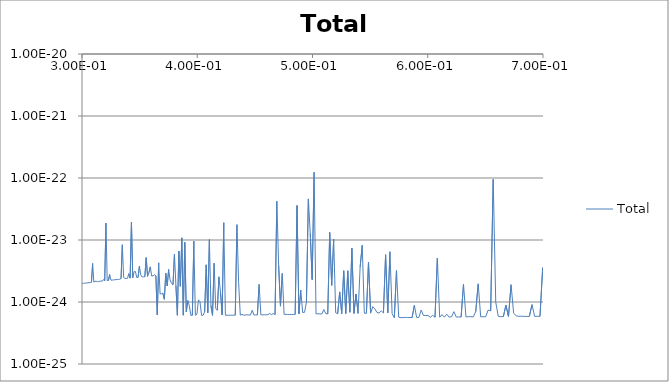
| Category | Total |
|---|---|
| 29929300.0 | 0 |
| 29829700.0 | 0 |
| 29730400.0 | 0 |
| 29631500.0 | 0 |
| 29532900.0 | 0 |
| 29434700.0 | 0 |
| 29336700.0 | 0 |
| 29239100.0 | 0 |
| 29141800.0 | 0 |
| 29044800.0 | 0 |
| 28948200.0 | 0 |
| 28851900.0 | 0 |
| 28755900.0 | 0 |
| 28660200.0 | 0 |
| 28564800.0 | 0 |
| 28469800.0 | 0 |
| 28375000.0 | 0 |
| 28280600.0 | 0 |
| 28186500.0 | 0 |
| 28092700.0 | 0 |
| 27999300.0 | 0 |
| 27906100.0 | 0 |
| 27813200.0 | 0 |
| 27720700.0 | 0 |
| 27628500.0 | 0 |
| 27536500.0 | 0 |
| 27444900.0 | 0 |
| 27353600.0 | 0 |
| 27262600.0 | 0 |
| 27171800.0 | 0 |
| 27081400.0 | 0 |
| 26991300.0 | 0 |
| 26901500.0 | 0 |
| 26812000.0 | 0 |
| 26722800.0 | 0 |
| 26633900.0 | 0 |
| 26545200.0 | 0 |
| 26456900.0 | 0 |
| 26368900.0 | 0 |
| 26281100.0 | 0 |
| 26193700.0 | 0 |
| 26106500.0 | 0 |
| 26019700.0 | 0 |
| 25933100.0 | 0 |
| 25846800.0 | 0 |
| 25760800.0 | 0 |
| 25675100.0 | 0 |
| 25589600.0 | 0 |
| 25504500.0 | 0 |
| 25419600.0 | 0 |
| 25335100.0 | 0 |
| 25250800.0 | 0 |
| 25166700.0 | 0 |
| 25083000.0 | 0 |
| 24999500.0 | 0 |
| 24916300.0 | 0 |
| 24833400.0 | 0 |
| 24750800.0 | 0 |
| 24668500.0 | 0 |
| 24586400.0 | 0 |
| 24504600.0 | 0 |
| 24423000.0 | 0 |
| 24341800.0 | 0 |
| 24260800.0 | 0 |
| 24180000.0 | 0 |
| 24099600.0 | 0 |
| 24019400.0 | 0 |
| 23939500.0 | 0 |
| 23859800.0 | 0 |
| 23780400.0 | 0 |
| 23701300.0 | 0 |
| 23622400.0 | 0 |
| 23543800.0 | 0 |
| 23465500.0 | 0 |
| 23387400.0 | 0 |
| 23309600.0 | 0 |
| 23232000.0 | 0 |
| 23154700.0 | 0 |
| 23077700.0 | 0 |
| 23000900.0 | 0 |
| 22924400.0 | 0 |
| 22848100.0 | 0 |
| 22772000.0 | 0 |
| 22696300.0 | 0 |
| 22620800.0 | 0 |
| 22545500.0 | 0 |
| 22470500.0 | 0 |
| 22395700.0 | 0 |
| 22321200.0 | 0 |
| 22246900.0 | 0 |
| 22172900.0 | 0 |
| 22099100.0 | 0 |
| 22025600.0 | 0 |
| 21952300.0 | 0 |
| 21879200.0 | 0 |
| 21806400.0 | 0 |
| 21733900.0 | 0 |
| 21661600.0 | 0 |
| 21589500.0 | 0 |
| 21517600.0 | 0 |
| 21446000.0 | 0 |
| 21374700.0 | 0 |
| 21303600.0 | 0 |
| 21232700.0 | 0 |
| 21162000.0 | 0 |
| 21091600.0 | 0 |
| 21021400.0 | 0 |
| 20951500.0 | 0 |
| 20881800.0 | 0 |
| 20812300.0 | 0 |
| 20743000.0 | 0 |
| 20674000.0 | 0 |
| 20605200.0 | 0 |
| 20536700.0 | 0 |
| 20468300.0 | 0 |
| 20400200.0 | 0 |
| 20332300.0 | 0 |
| 20264700.0 | 0 |
| 20197300.0 | 0 |
| 20130100.0 | 0 |
| 20063100.0 | 0 |
| 19996300.0 | 0 |
| 19929800.0 | 0 |
| 19863500.0 | 0 |
| 19797400.0 | 0 |
| 19731500.0 | 0 |
| 19665800.0 | 0 |
| 19600400.0 | 0 |
| 19535200.0 | 0 |
| 19470200.0 | 0 |
| 19405400.0 | 0 |
| 19340800.0 | 0 |
| 19276500.0 | 0 |
| 19212300.0 | 0 |
| 19148400.0 | 0 |
| 19084700.0 | 0 |
| 19021200.0 | 0 |
| 18957900.0 | 0 |
| 18894800.0 | 0 |
| 18831900.0 | 0 |
| 18769300.0 | 0 |
| 18706800.0 | 0 |
| 18644600.0 | 0 |
| 18582500.0 | 0 |
| 18520700.0 | 0 |
| 18459100.0 | 0 |
| 18397700.0 | 0 |
| 18336400.0 | 0 |
| 18275400.0 | 0 |
| 18214600.0 | 0 |
| 18154000.0 | 0 |
| 18093600.0 | 0 |
| 18033400.0 | 0 |
| 17973400.0 | 0 |
| 17913600.0 | 0 |
| 17854000.0 | 0 |
| 17794600.0 | 0 |
| 17735400.0 | 0 |
| 17676400.0 | 0 |
| 17617500.0 | 0 |
| 17558900.0 | 0 |
| 17500500.0 | 0 |
| 17442300.0 | 0 |
| 17384200.0 | 0 |
| 17326400.0 | 0 |
| 17268700.0 | 0 |
| 17211300.0 | 0 |
| 17154000.0 | 0 |
| 17096900.0 | 0 |
| 17040000.0 | 0 |
| 16983300.0 | 0 |
| 16926800.0 | 0 |
| 16870500.0 | 0 |
| 16814400.0 | 0 |
| 16758400.0 | 0 |
| 16702700.0 | 0 |
| 16647100.0 | 0 |
| 16591700.0 | 0 |
| 16536500.0 | 0 |
| 16481500.0 | 0 |
| 16426600.0 | 0 |
| 16372000.0 | 0 |
| 16317500.0 | 0 |
| 16263200.0 | 0 |
| 16209100.0 | 0 |
| 16155100.0 | 0 |
| 16101400.0 | 0 |
| 16047800.0 | 0 |
| 15994400.0 | 0 |
| 15941200.0 | 0 |
| 15888100.0 | 0 |
| 15835300.0 | 0 |
| 15782600.0 | 0 |
| 15730100.0 | 0 |
| 15677700.0 | 0 |
| 15625600.0 | 0 |
| 15573600.0 | 0 |
| 15521700.0 | 0 |
| 15470100.0 | 0 |
| 15418600.0 | 0 |
| 15367300.0 | 0 |
| 15316200.0 | 0 |
| 15265200.0 | 0 |
| 15214400.0 | 0 |
| 15163800.0 | 0 |
| 15113300.0 | 0 |
| 15063100.0 | 0 |
| 15012900.0 | 0 |
| 14963000.0 | 0 |
| 14913200.0 | 0 |
| 14863600.0 | 0 |
| 14814100.0 | 0 |
| 14764800.0 | 0 |
| 14715700.0 | 0 |
| 14666700.0 | 0 |
| 14617900.0 | 0 |
| 14569300.0 | 0 |
| 14520800.0 | 0 |
| 14472500.0 | 0 |
| 14424300.0 | 0 |
| 14376300.0 | 0 |
| 14328500.0 | 0 |
| 14280800.0 | 0 |
| 14233300.0 | 0 |
| 14185900.0 | 0 |
| 14138700.0 | 0 |
| 14091700.0 | 0 |
| 14044800.0 | 0 |
| 13998100.0 | 0 |
| 13951500.0 | 0 |
| 13905100.0 | 0 |
| 13858800.0 | 0 |
| 13812700.0 | 0 |
| 13766700.0 | 0 |
| 13720900.0 | 0 |
| 13675300.0 | 0 |
| 13629800.0 | 0 |
| 13584400.0 | 0 |
| 13539200.0 | 0 |
| 13494200.0 | 0 |
| 13449300.0 | 0 |
| 13404500.0 | 0 |
| 13359900.0 | 0 |
| 13315500.0 | 0 |
| 13271200.0 | 0 |
| 13227000.0 | 0 |
| 13183000.0 | 0 |
| 13139100.0 | 0 |
| 13095400.0 | 0 |
| 13051800.0 | 0 |
| 13008400.0 | 0 |
| 12965100.0 | 0 |
| 12922000.0 | 0 |
| 12879000.0 | 0 |
| 12836100.0 | 0 |
| 12793400.0 | 0 |
| 12750800.0 | 0 |
| 12708400.0 | 0 |
| 12666100.0 | 0 |
| 12624000.0 | 0 |
| 12582000.0 | 0 |
| 12540100.0 | 0 |
| 12498400.0 | 0 |
| 12456800.0 | 0 |
| 12415300.0 | 0 |
| 12374000.0 | 0 |
| 12332900.0 | 0 |
| 12291800.0 | 0 |
| 12250900.0 | 0 |
| 12210200.0 | 0 |
| 12169500.0 | 0 |
| 12129000.0 | 0 |
| 12088700.0 | 0 |
| 12048500.0 | 0 |
| 12008400.0 | 0 |
| 11968400.0 | 0 |
| 11928600.0 | 0 |
| 11888900.0 | 0 |
| 11849300.0 | 0 |
| 11809900.0 | 0 |
| 11770600.0 | 0 |
| 11731400.0 | 0 |
| 11692400.0 | 0 |
| 11653500.0 | 0 |
| 11614700.0 | 0 |
| 11576100.0 | 0 |
| 11537600.0 | 0 |
| 11499200.0 | 0 |
| 11460900.0 | 0 |
| 11422800.0 | 0 |
| 11384800.0 | 0 |
| 11346900.0 | 0 |
| 11309100.0 | 0 |
| 11271500.0 | 0 |
| 11234000.0 | 0 |
| 11196600.0 | 0 |
| 11159400.0 | 0 |
| 11122200.0 | 0 |
| 11085200.0 | 0 |
| 11048300.0 | 0 |
| 11011600.0 | 0 |
| 10974900.0 | 0 |
| 10938400.0 | 0 |
| 10902000.0 | 0 |
| 10865700.0 | 0 |
| 10829600.0 | 0 |
| 10793500.0 | 0 |
| 10757600.0 | 0 |
| 10721800.0 | 0 |
| 10686200.0 | 0 |
| 10650600.0 | 0 |
| 10615200.0 | 0 |
| 10579800.0 | 0 |
| 10544600.0 | 0 |
| 10509600.0 | 0 |
| 10474600.0 | 0 |
| 10439700.0 | 0 |
| 10405000.0 | 0 |
| 10370400.0 | 0 |
| 10335900.0 | 0 |
| 10301500.0 | 0 |
| 10267200.0 | 0 |
| 10233000.0 | 0 |
| 10199000.0 | 0 |
| 10165000.0 | 0 |
| 10131200.0 | 0 |
| 10097500.0 | 0 |
| 10063900.0 | 0 |
| 10030400.0 | 0 |
| 9997050.0 | 0 |
| 9963790.0 | 0 |
| 9930630.0 | 0 |
| 9897590.0 | 0 |
| 9864650.0 | 0 |
| 9831830.0 | 0 |
| 9799120.0 | 0 |
| 9766510.0 | 0 |
| 9734010.0 | 0 |
| 9701620.0 | 0 |
| 9669340.0 | 0 |
| 9637170.0 | 0 |
| 9605100.0 | 0 |
| 9573140.0 | 0 |
| 9541290.0 | 0 |
| 9509540.0 | 0 |
| 9477900.0 | 0 |
| 9446360.0 | 0 |
| 9414930.0 | 0 |
| 9383600.0 | 0 |
| 9352380.0 | 0 |
| 9321260.0 | 0 |
| 9290240.0 | 0 |
| 9259330.0 | 0 |
| 9228520.0 | 0 |
| 9197810.0 | 0 |
| 9167210.0 | 0 |
| 9136700.0 | 0 |
| 9106300.0 | 0 |
| 9076000.0 | 0 |
| 9045800.0 | 0 |
| 9015700.0 | 0 |
| 8985700.0 | 0 |
| 8955810.0 | 0 |
| 8926010.0 | 0 |
| 8896300.0 | 0 |
| 8866700.0 | 0 |
| 8837200.0 | 0 |
| 8807790.0 | 0 |
| 8778490.0 | 0 |
| 8749280.0 | 0 |
| 8720160.0 | 0 |
| 8691150.0 | 0 |
| 8662230.0 | 0 |
| 8633410.0 | 0 |
| 8604680.0 | 0 |
| 8576050.0 | 0 |
| 8547510.0 | 0 |
| 8519070.0 | 0 |
| 8490720.0 | 0 |
| 8462470.0 | 0 |
| 8434310.0 | 0 |
| 8406250.0 | 0 |
| 8378280.0 | 0 |
| 8350400.0 | 0 |
| 8322620.0 | 0 |
| 8294920.0 | 0 |
| 8267320.0 | 0 |
| 8239810.0 | 0 |
| 8212400.0 | 0 |
| 8185070.0 | 0 |
| 8157830.0 | 0 |
| 8130690.0 | 0 |
| 8103640.0 | 0 |
| 8076670.0 | 0 |
| 8049800.0 | 0 |
| 8023010.0 | 0 |
| 7996320.0 | 0 |
| 7969710.0 | 0 |
| 7943190.0 | 0 |
| 7916760.0 | 0 |
| 7890420.0 | 0 |
| 7864160.0 | 0 |
| 7838000.0 | 0 |
| 7811910.0 | 0 |
| 7785920.0 | 0 |
| 7760010.0 | 0 |
| 7734190.0 | 0 |
| 7708460.0 | 0 |
| 7682810.0 | 0 |
| 7657250.0 | 0 |
| 7631770.0 | 0 |
| 7606370.0 | 0 |
| 7581060.0 | 0 |
| 7555840.0 | 0 |
| 7530700.0 | 0 |
| 7505640.0 | 0 |
| 7480660.0 | 0 |
| 7455770.0 | 0 |
| 7430960.0 | 0 |
| 7406240.0 | 0 |
| 7381590.0 | 0 |
| 7357030.0 | 0 |
| 7332550.0 | 0 |
| 7308150.0 | 0 |
| 7283840.0 | 0 |
| 7259600.0 | 0 |
| 7235440.0 | 0 |
| 7211370.0 | 0 |
| 7187370.0 | 0 |
| 7163460.0 | 0 |
| 7139620.0 | 0 |
| 7115870.0 | 0 |
| 7092190.0 | 0 |
| 7068590.0 | 0 |
| 7045070.0 | 0 |
| 7021630.0 | 0 |
| 6998260.0 | 0 |
| 6974980.0 | 0 |
| 6951770.0 | 0 |
| 6928640.0 | 0 |
| 6905580.0 | 0 |
| 6882600.0 | 0 |
| 6859700.0 | 0 |
| 6836880.0 | 0 |
| 6814130.0 | 0 |
| 6791460.0 | 0 |
| 6768860.0 | 0 |
| 6746330.0 | 0 |
| 6723890.0 | 0 |
| 6701510.0 | 0 |
| 6679220.0 | 0 |
| 6656990.0 | 0 |
| 6634840.0 | 0 |
| 6612760.0 | 0 |
| 6590760.0 | 0 |
| 6568830.0 | 0 |
| 6546970.0 | 0 |
| 6525190.0 | 0 |
| 6503480.0 | 0 |
| 6481840.0 | 0 |
| 6460270.0 | 0 |
| 6438770.0 | 0 |
| 6417350.0 | 0 |
| 6395990.0 | 0 |
| 6374710.0 | 0 |
| 6353500.0 | 0 |
| 6332360.0 | 0 |
| 6311290.0 | 0 |
| 6290290.0 | 0 |
| 6269360.0 | 0 |
| 6248500.0 | 0 |
| 6227710.0 | 0 |
| 6206980.0 | 0 |
| 6186330.0 | 0 |
| 6165750.0 | 0 |
| 6145230.0 | 0 |
| 6124780.0 | 0 |
| 6104400.0 | 0 |
| 6084090.0 | 0 |
| 6063850.0 | 0 |
| 6043670.0 | 0 |
| 6023560.0 | 0 |
| 6003520.0 | 0 |
| 5983540.0 | 0 |
| 5963630.0 | 0 |
| 5943790.0 | 0 |
| 5924010.0 | 0 |
| 5904300.0 | 0 |
| 5884650.0 | 0 |
| 5865070.0 | 0 |
| 5845560.0 | 0 |
| 5826100.0 | 0 |
| 5806720.0 | 0 |
| 5787400.0 | 0 |
| 5768140.0 | 0 |
| 5748950.0 | 0 |
| 5729820.0 | 0 |
| 5710750.0 | 0 |
| 5691750.0 | 0 |
| 5672810.0 | 0 |
| 5653940.0 | 0 |
| 5635120.0 | 0 |
| 5616370.0 | 0 |
| 5597680.0 | 0 |
| 5579060.0 | 0 |
| 5560490.0 | 0 |
| 5541990.0 | 0 |
| 5523550.0 | 0 |
| 5505170.0 | 0 |
| 5486850.0 | 0 |
| 5468600.0 | 0 |
| 5450400.0 | 0 |
| 5432270.0 | 0 |
| 5414190.0 | 0 |
| 5396180.0 | 0 |
| 5378220.0 | 0 |
| 5360320.0 | 0 |
| 5342490.0 | 0 |
| 5324710.0 | 0 |
| 5306990.0 | 0 |
| 5289340.0 | 0 |
| 5271730.0 | 0 |
| 5254190.0 | 0 |
| 5236710.0 | 0 |
| 5219290.0 | 0 |
| 5201920.0 | 0 |
| 5184610.0 | 0 |
| 5167360.0 | 0 |
| 5150170.0 | 0 |
| 5133030.0 | 0 |
| 5115950.0 | 0 |
| 5098930.0 | 0 |
| 5081960.0 | 0 |
| 5065050.0 | 0 |
| 5048200.0 | 0 |
| 5031400.0 | 0 |
| 5014660.0 | 0 |
| 4997970.0 | 0 |
| 4981340.0 | 0 |
| 4964770.0 | 0 |
| 4948250.0 | 0 |
| 4931780.0 | 0 |
| 4915370.0 | 0 |
| 4899010.0 | 0 |
| 4882710.0 | 0 |
| 4866470.0 | 0 |
| 4850270.0 | 0 |
| 4834140.0 | 0 |
| 4818050.0 | 0 |
| 4802020.0 | 0 |
| 4786040.0 | 0 |
| 4770120.0 | 0 |
| 4754240.0 | 0 |
| 4738420.0 | 0 |
| 4722660.0 | 0 |
| 4706940.0 | 0 |
| 4691280.0 | 0 |
| 4675670.0 | 0 |
| 4660110.0 | 0 |
| 4644610.0 | 0 |
| 4629150.0 | 0 |
| 4613750.0 | 0 |
| 4598400.0 | 0 |
| 4583100.0 | 0 |
| 4567850.0 | 0 |
| 4552650.0 | 0 |
| 4537500.0 | 0 |
| 4522400.0 | 0 |
| 4507350.0 | 0 |
| 4492350.0 | 0 |
| 4477410.0 | 0 |
| 4462510.0 | 0 |
| 4447660.0 | 0 |
| 4432860.0 | 0 |
| 4418110.0 | 0 |
| 4403410.0 | 0 |
| 4388760.0 | 0 |
| 4374150.0 | 0 |
| 4359600.0 | 0 |
| 4345090.0 | 0 |
| 4330640.0 | 0 |
| 4316230.0 | 0 |
| 4301860.0 | 0 |
| 4287550.0 | 0 |
| 4273280.0 | 0 |
| 4259060.0 | 0 |
| 4244890.0 | 0 |
| 4230770.0 | 0 |
| 4216690.0 | 0 |
| 4202660.0 | 0 |
| 4188680.0 | 0 |
| 4174740.0 | 0 |
| 4160850.0 | 0 |
| 4147000.0 | 0 |
| 4133200.0 | 0 |
| 4119450.0 | 0 |
| 4105740.0 | 0 |
| 4092080.0 | 0 |
| 4078470.0 | 0 |
| 4064890.0 | 0 |
| 4051370.0 | 0 |
| 4037890.0 | 0 |
| 4024450.0 | 0 |
| 4011060.0 | 0 |
| 3997720.0 | 0 |
| 3984410.0 | 0 |
| 3971160.0 | 0 |
| 3957940.0 | 0 |
| 3944770.0 | 0 |
| 3931650.0 | 0 |
| 3918560.0 | 0 |
| 3905520.0 | 0 |
| 3892530.0 | 0 |
| 3879580.0 | 0 |
| 3866670.0 | 0 |
| 3853800.0 | 0 |
| 3840980.0 | 0 |
| 3828200.0 | 0 |
| 3815460.0 | 0 |
| 3802760.0 | 0 |
| 3790110.0 | 0 |
| 3777500.0 | 0 |
| 3764930.0 | 0 |
| 3752400.0 | 0 |
| 3739920.0 | 0 |
| 3727470.0 | 0 |
| 3715070.0 | 0 |
| 3702710.0 | 0 |
| 3690390.0 | 0 |
| 3678110.0 | 0 |
| 3665870.0 | 0 |
| 3653670.0 | 0 |
| 3641510.0 | 0 |
| 3629400.0 | 0 |
| 3617320.0 | 0 |
| 3605290.0 | 0 |
| 3593290.0 | 0 |
| 3581330.0 | 0 |
| 3569420.0 | 0 |
| 3557540.0 | 0 |
| 3545700.0 | 0 |
| 3533900.0 | 0 |
| 3522140.0 | 0 |
| 3510420.0 | 0 |
| 3498740.0 | 0 |
| 3487100.0 | 0 |
| 3475500.0 | 0 |
| 3463930.0 | 0 |
| 3452410.0 | 0 |
| 3440920.0 | 0 |
| 3429470.0 | 0 |
| 3418060.0 | 0 |
| 3406690.0 | 0 |
| 3395350.0 | 0 |
| 3384050.0 | 0 |
| 3372790.0 | 0 |
| 3361570.0 | 0 |
| 3350390.0 | 0 |
| 3339240.0 | 0 |
| 3328130.0 | 0 |
| 3317050.0 | 0 |
| 3306020.0 | 0 |
| 3295010.0 | 0 |
| 3284050.0 | 0 |
| 3273120.0 | 0 |
| 3262230.0 | 0 |
| 3251380.0 | 0 |
| 3240560.0 | 0 |
| 3229780.0 | 0 |
| 3219030.0 | 0 |
| 3208320.0 | 0 |
| 3197640.0 | 0 |
| 3187000.0 | 0 |
| 3176400.0 | 0 |
| 3165830.0 | 0 |
| 3155300.0 | 0 |
| 3144800.0 | 0 |
| 3134330.0 | 0 |
| 3123900.0 | 0 |
| 3113510.0 | 0 |
| 3103150.0 | 0 |
| 3092820.0 | 0 |
| 3082530.0 | 0 |
| 3072270.0 | 0 |
| 3062050.0 | 0 |
| 3051860.0 | 0 |
| 3041710.0 | 0 |
| 3031590.0 | 0 |
| 3021500.0 | 0 |
| 3011450.0 | 0 |
| 3001430.0 | 0 |
| 2991440.0 | 0 |
| 2981480.0 | 0 |
| 2971560.0 | 0 |
| 2961680.0 | 0 |
| 2951820.0 | 0 |
| 2942000.0 | 0 |
| 2932210.0 | 0 |
| 2922450.0 | 0 |
| 2912730.0 | 0 |
| 2903040.0 | 0 |
| 2893380.0 | 0 |
| 2883750.0 | 0 |
| 2874160.0 | 0 |
| 2864590.0 | 0 |
| 2855060.0 | 0 |
| 2845560.0 | 0 |
| 2836090.0 | 0 |
| 2826650.0 | 0 |
| 2817250.0 | 0 |
| 2807870.0 | 0 |
| 2798530.0 | 0 |
| 2789220.0 | 0 |
| 2779940.0 | 0 |
| 2770690.0 | 0 |
| 2761470.0 | 0 |
| 2752280.0 | 0 |
| 2743120.0 | 0 |
| 2734000.0 | 0 |
| 2724900.0 | 0 |
| 2715830.0 | 0 |
| 2706800.0 | 0 |
| 2697790.0 | 0 |
| 2688810.0 | 0 |
| 2679860.0 | 0 |
| 2670950.0 | 0 |
| 2662060.0 | 0 |
| 2653200.0 | 0 |
| 2644370.0 | 0 |
| 2635580.0 | 0 |
| 2626810.0 | 0 |
| 2618070.0 | 0 |
| 2609350.0 | 0 |
| 2600670.0 | 0 |
| 2592020.0 | 0 |
| 2583390.0 | 0 |
| 2574800.0 | 0 |
| 2566230.0 | 0 |
| 2557690.0 | 0 |
| 2549180.0 | 0 |
| 2540700.0 | 0 |
| 2532240.0 | 0 |
| 2523820.0 | 0 |
| 2515420.0 | 0 |
| 2507050.0 | 0 |
| 2498710.0 | 0 |
| 2490390.0 | 0 |
| 2482110.0 | 0 |
| 2473850.0 | 0 |
| 2465620.0 | 0 |
| 2457410.0 | 0 |
| 2449240.0 | 0 |
| 2441090.0 | 0 |
| 2432960.0 | 0 |
| 2424870.0 | 0 |
| 2416800.0 | 0 |
| 2408760.0 | 0 |
| 2400740.0 | 0 |
| 2392750.0 | 0 |
| 2384790.0 | 0 |
| 2376860.0 | 0 |
| 2368950.0 | 0 |
| 2361070.0 | 0 |
| 2353210.0 | 0 |
| 2345380.0 | 0 |
| 2337580.0 | 0 |
| 2329800.0 | 0 |
| 2322050.0 | 0 |
| 2314320.0 | 0 |
| 2306620.0 | 0 |
| 2298940.0 | 0 |
| 2291290.0 | 0 |
| 2283670.0 | 0 |
| 2276070.0 | 0 |
| 2268500.0 | 0 |
| 2260950.0 | 0 |
| 2253430.0 | 0 |
| 2245930.0 | 0 |
| 2238460.0 | 0 |
| 2231010.0 | 0 |
| 2223580.0 | 0 |
| 2216180.0 | 0 |
| 2208810.0 | 0 |
| 2201460.0 | 0 |
| 2194140.0 | 0 |
| 2186830.0 | 0 |
| 2179560.0 | 0 |
| 2172310.0 | 0 |
| 2165080.0 | 0 |
| 2157870.0 | 0 |
| 2150690.0 | 0 |
| 2143540.0 | 0 |
| 2136400.0 | 0 |
| 2129300.0 | 0 |
| 2122210.0 | 0 |
| 2115150.0 | 0 |
| 2108110.0 | 0 |
| 2101100.0 | 0 |
| 2094110.0 | 0 |
| 2087140.0 | 0 |
| 2080190.0 | 0 |
| 2073270.0 | 0 |
| 2066370.0 | 0 |
| 2059500.0 | 0 |
| 2052640.0 | 0 |
| 2045810.0 | 0 |
| 2039010.0 | 0 |
| 2032220.0 | 0 |
| 2025460.0 | 0 |
| 2018720.0 | 0 |
| 2012000.0 | 0 |
| 2005310.0 | 0 |
| 1998640.0 | 0 |
| 1991990.0 | 0 |
| 1985360.0 | 0 |
| 1978750.0 | 0 |
| 1972170.0 | 0 |
| 1965600.0 | 0 |
| 1959060.0 | 0 |
| 1952550.0 | 0 |
| 1946050.0 | 0 |
| 1939570.0 | 0 |
| 1933120.0 | 0 |
| 1926690.0 | 0 |
| 1920280.0 | 0 |
| 1913890.0 | 0 |
| 1907520.0 | 0 |
| 1901170.0 | 0 |
| 1894850.0 | 0 |
| 1888540.0 | 0 |
| 1882260.0 | 0 |
| 1875990.0 | 0 |
| 1869750.0 | 0 |
| 1863530.0 | 0 |
| 1857330.0 | 0 |
| 1851150.0 | 0 |
| 1844990.0 | 0 |
| 1838850.0 | 0 |
| 1832730.0 | 0 |
| 1826630.0 | 0 |
| 1820560.0 | 0 |
| 1814500.0 | 0 |
| 1808460.0 | 0 |
| 1802440.0 | 0 |
| 1796450.0 | 0 |
| 1790470.0 | 0 |
| 1784510.0 | 0 |
| 1778570.0 | 0 |
| 1772650.0 | 0 |
| 1766760.0 | 0 |
| 1760880.0 | 0 |
| 1755020.0 | 0 |
| 1749180.0 | 0 |
| 1743360.0 | 0 |
| 1737560.0 | 0 |
| 1731780.0 | 0 |
| 1726010.0 | 0 |
| 1720270.0 | 0 |
| 1714550.0 | 0 |
| 1708840.0 | 0 |
| 1703150.0 | 0 |
| 1697490.0 | 0 |
| 1691840.0 | 0 |
| 1686210.0 | 0 |
| 1680600.0 | 0 |
| 1675010.0 | 0 |
| 1669430.0 | 0 |
| 1663880.0 | 0 |
| 1658340.0 | 0 |
| 1652820.0 | 0 |
| 1647320.0 | 0 |
| 1641840.0 | 0 |
| 1636380.0 | 0 |
| 1630940.0 | 0 |
| 1625510.0 | 0 |
| 1620100.0 | 0 |
| 1614710.0 | 0 |
| 1609340.0 | 0 |
| 1603980.0 | 0 |
| 1598640.0 | 0 |
| 1593320.0 | 0 |
| 1588020.0 | 0 |
| 1582740.0 | 0 |
| 1577470.0 | 0 |
| 1572220.0 | 0 |
| 1566990.0 | 0 |
| 1561780.0 | 0 |
| 1556580.0 | 0 |
| 1551400.0 | 0 |
| 1546240.0 | 0 |
| 1541100.0 | 0 |
| 1535970.0 | 0 |
| 1530860.0 | 0 |
| 1525760.0 | 0 |
| 1520690.0 | 0 |
| 1515630.0 | 0 |
| 1510580.0 | 0 |
| 1505560.0 | 0 |
| 1500550.0 | 0 |
| 1495550.0 | 0 |
| 1490580.0 | 0 |
| 1485620.0 | 0 |
| 1480670.0 | 0 |
| 1475750.0 | 0 |
| 1470840.0 | 0 |
| 1465940.0 | 0 |
| 1461070.0 | 0 |
| 1456200.0 | 0 |
| 1451360.0 | 0 |
| 1446530.0 | 0 |
| 1441720.0 | 0 |
| 1436920.0 | 0 |
| 1432140.0 | 0 |
| 1427370.0 | 0 |
| 1422620.0 | 0 |
| 1417890.0 | 0 |
| 1413170.0 | 0 |
| 1408470.0 | 0 |
| 1403780.0 | 0 |
| 1399110.0 | 0 |
| 1394460.0 | 0 |
| 1389820.0 | 0 |
| 1385190.0 | 0 |
| 1380580.0 | 0 |
| 1375990.0 | 0 |
| 1371410.0 | 0 |
| 1366850.0 | 0 |
| 1362300.0 | 0 |
| 1357770.0 | 0 |
| 1353250.0 | 0 |
| 1348740.0 | 0 |
| 1344260.0 | 0 |
| 1339780.0 | 0 |
| 1335330.0 | 0 |
| 1330880.0 | 0 |
| 1326450.0 | 0 |
| 1322040.0 | 0 |
| 1317640.0 | 0 |
| 1313260.0 | 0 |
| 1308890.0 | 0 |
| 1304530.0 | 0 |
| 1300190.0 | 0 |
| 1295870.0 | 0 |
| 1291550.0 | 0 |
| 1287260.0 | 0 |
| 1282970.0 | 0 |
| 1278700.0 | 0 |
| 1274450.0 | 0 |
| 1270210.0 | 0 |
| 1265980.0 | 0 |
| 1261770.0 | 0 |
| 1257570.0 | 0 |
| 1253390.0 | 0 |
| 1249220.0 | 0 |
| 1245060.0 | 0 |
| 1240920.0 | 0 |
| 1236790.0 | 0 |
| 1232670.0 | 0 |
| 1228570.0 | 0 |
| 1224480.0 | 0 |
| 1220410.0 | 0 |
| 1216350.0 | 0 |
| 1212300.0 | 0 |
| 1208270.0 | 0 |
| 1204250.0 | 0 |
| 1200240.0 | 0 |
| 1196240.0 | 0 |
| 1192260.0 | 0 |
| 1188300.0 | 0 |
| 1184340.0 | 0 |
| 1180400.0 | 0 |
| 1176470.0 | 0 |
| 1172560.0 | 0 |
| 1168660.0 | 0 |
| 1164770.0 | 0 |
| 1160890.0 | 0 |
| 1157030.0 | 0 |
| 1153180.0 | 0 |
| 1149340.0 | 0 |
| 1145520.0 | 0 |
| 1141710.0 | 0 |
| 1137910.0 | 0 |
| 1134120.0 | 0 |
| 1130350.0 | 0 |
| 1126590.0 | 0 |
| 1122840.0 | 0 |
| 1119100.0 | 0 |
| 1115380.0 | 0 |
| 1111670.0 | 0 |
| 1107970.0 | 0 |
| 1104280.0 | 0 |
| 1100610.0 | 0 |
| 1096950.0 | 0 |
| 1093300.0 | 0 |
| 1089660.0 | 0 |
| 1086030.0 | 0 |
| 1082420.0 | 0 |
| 1078820.0 | 0 |
| 1075230.0 | 0 |
| 1071650.0 | 0 |
| 1068080.0 | 0 |
| 1064530.0 | 0 |
| 1060990.0 | 0 |
| 1057460.0 | 0 |
| 1053940.0 | 0 |
| 1050430.0 | 0 |
| 1046940.0 | 0 |
| 1043450.0 | 0 |
| 1039980.0 | 0 |
| 1036520.0 | 0 |
| 1033070.0 | 0 |
| 1029630.0 | 0 |
| 1026210.0 | 0 |
| 1022790.0 | 0 |
| 1019390.0 | 0 |
| 1016000.0 | 0 |
| 1012620.0 | 0 |
| 1009250.0 | 0 |
| 1005890.0 | 0 |
| 1002540.0 | 0 |
| 999207.0 | 0 |
| 995882.0 | 0 |
| 992569.0 | 0 |
| 989266.0 | 0 |
| 985974.0 | 0 |
| 982694.0 | 0 |
| 979424.0 | 0 |
| 976165.0 | 0 |
| 972917.0 | 0 |
| 969679.0 | 0 |
| 966453.0 | 0 |
| 963237.0 | 0 |
| 960032.0 | 0 |
| 956838.0 | 0 |
| 953654.0 | 0 |
| 950481.0 | 0 |
| 947318.0 | 0 |
| 944166.0 | 0 |
| 941024.0 | 0 |
| 937893.0 | 0 |
| 934772.0 | 0 |
| 931662.0 | 0 |
| 928562.0 | 0 |
| 925472.0 | 0 |
| 922393.0 | 0 |
| 919323.0 | 0 |
| 916264.0 | 0 |
| 913216.0 | 0 |
| 910177.0 | 0 |
| 907148.0 | 0 |
| 904130.0 | 0 |
| 901122.0 | 0 |
| 898123.0 | 0 |
| 895135.0 | 0 |
| 892156.0 | 0 |
| 889188.0 | 0 |
| 886229.0 | 0 |
| 883280.0 | 0 |
| 880341.0 | 0 |
| 877412.0 | 0 |
| 874492.0 | 0 |
| 871582.0 | 0 |
| 868682.0 | 0 |
| 865792.0 | 0 |
| 862911.0 | 0 |
| 860040.0 | 0 |
| 857178.0 | 0 |
| 854326.0 | 0 |
| 851483.0 | 0 |
| 848650.0 | 0 |
| 845826.0 | 0 |
| 843012.0 | 0 |
| 840207.0 | 0 |
| 837411.0 | 0 |
| 834624.0 | 0 |
| 831847.0 | 0 |
| 829079.0 | 0 |
| 826321.0 | 0 |
| 823571.0 | 0 |
| 820831.0 | 0 |
| 818100.0 | 0 |
| 815377.0 | 0 |
| 812664.0 | 0 |
| 809960.0 | 0 |
| 807265.0 | 0 |
| 804579.0 | 0 |
| 801902.0 | 0 |
| 799234.0 | 0 |
| 796574.0 | 0 |
| 793924.0 | 0 |
| 791282.0 | 0 |
| 788649.0 | 0 |
| 786025.0 | 0 |
| 783409.0 | 0 |
| 780803.0 | 0 |
| 778205.0 | 0 |
| 775615.0 | 0 |
| 773034.0 | 0 |
| 770462.0 | 0 |
| 767898.0 | 0 |
| 765343.0 | 0 |
| 762797.0 | 0 |
| 760259.0 | 0 |
| 757729.0 | 0 |
| 755208.0 | 0 |
| 752695.0 | 0 |
| 750190.0 | 0 |
| 747694.0 | 0 |
| 745206.0 | 0 |
| 742726.0 | 0 |
| 740255.0 | 0 |
| 737792.0 | 0 |
| 735337.0 | 0 |
| 732890.0 | 0 |
| 730452.0 | 0 |
| 728021.0 | 0 |
| 725599.0 | 0 |
| 723184.0 | 0 |
| 720778.0 | 0 |
| 718380.0 | 0 |
| 715989.0 | 0 |
| 713607.0 | 0 |
| 711232.0 | 0 |
| 708866.0 | 0 |
| 706507.0 | 0 |
| 704156.0 | 0 |
| 701813.0 | 0 |
| 699478.0 | 0 |
| 697151.0 | 0 |
| 694831.0 | 0 |
| 692519.0 | 0 |
| 690215.0 | 0 |
| 687918.0 | 0 |
| 685629.0 | 0 |
| 683348.0 | 0 |
| 681074.0 | 0 |
| 678807.0 | 0 |
| 676549.0 | 0 |
| 674298.0 | 0 |
| 672054.0 | 0 |
| 669818.0 | 0 |
| 667589.0 | 0 |
| 665368.0 | 0 |
| 663154.0 | 0 |
| 660947.0 | 0 |
| 658748.0 | 0 |
| 656556.0 | 0 |
| 654371.0 | 0 |
| 652194.0 | 0 |
| 650024.0 | 0 |
| 647861.0 | 0 |
| 645705.0 | 0 |
| 643557.0 | 0 |
| 641415.0 | 0 |
| 639281.0 | 0 |
| 637154.0 | 0 |
| 635034.0 | 0 |
| 632921.0 | 0 |
| 630815.0 | 0 |
| 628716.0 | 0 |
| 626624.0 | 0 |
| 624539.0 | 0 |
| 622461.0 | 0 |
| 620389.0 | 0 |
| 618325.0 | 0 |
| 616268.0 | 0 |
| 614217.0 | 0 |
| 612173.0 | 0 |
| 610136.0 | 0 |
| 608106.0 | 0 |
| 606083.0 | 0 |
| 604066.0 | 0 |
| 602056.0 | 0 |
| 600053.0 | 0 |
| 598056.0 | 0 |
| 596066.0 | 0 |
| 594083.0 | 0 |
| 592106.0 | 0 |
| 590136.0 | 0 |
| 588172.0 | 0 |
| 586215.0 | 0 |
| 584265.0 | 0 |
| 582320.0 | 0 |
| 580383.0 | 0 |
| 578452.0 | 0 |
| 576527.0 | 0 |
| 574609.0 | 0 |
| 572697.0 | 0 |
| 570791.0 | 0 |
| 568892.0 | 0 |
| 566999.0 | 0 |
| 565112.0 | 0 |
| 563232.0 | 0 |
| 561358.0 | 0 |
| 559490.0 | 0 |
| 557628.0 | 0 |
| 555773.0 | 0 |
| 553923.0 | 0 |
| 552080.0 | 0 |
| 550243.0 | 0 |
| 548412.0 | 0 |
| 546588.0 | 0 |
| 544769.0 | 0 |
| 542956.0 | 0 |
| 541150.0 | 0 |
| 539349.0 | 0 |
| 537554.0 | 0 |
| 535766.0 | 0 |
| 533983.0 | 0 |
| 532206.0 | 0 |
| 530435.0 | 0 |
| 528670.0 | 0 |
| 526911.0 | 0 |
| 525158.0 | 0 |
| 523410.0 | 0 |
| 521669.0 | 0 |
| 519933.0 | 0 |
| 518203.0 | 0 |
| 516479.0 | 0 |
| 514760.0 | 0 |
| 513047.0 | 0 |
| 511340.0 | 0 |
| 509639.0 | 0 |
| 507943.0 | 0 |
| 506253.0 | 0 |
| 504568.0 | 0 |
| 502889.0 | 0 |
| 501216.0 | 0 |
| 499548.0 | 0 |
| 497886.0 | 0 |
| 496229.0 | 0 |
| 494578.0 | 0 |
| 492933.0 | 0 |
| 491292.0 | 0 |
| 489658.0 | 0 |
| 488028.0 | 0 |
| 486404.0 | 0 |
| 484786.0 | 0 |
| 483173.0 | 0 |
| 481565.0 | 0 |
| 479963.0 | 0 |
| 478366.0 | 0 |
| 476774.0 | 0 |
| 475188.0 | 0 |
| 473606.0 | 0 |
| 472031.0 | 0 |
| 470460.0 | 0 |
| 468895.0 | 0 |
| 467334.0 | 0 |
| 465779.0 | 0 |
| 464229.0 | 0 |
| 462685.0 | 0 |
| 461145.0 | 0 |
| 459611.0 | 0 |
| 458081.0 | 0 |
| 456557.0 | 0 |
| 455038.0 | 0 |
| 453524.0 | 0 |
| 452015.0 | 0 |
| 450511.0 | 0 |
| 449012.0 | 0 |
| 447518.0 | 0 |
| 446029.0 | 0 |
| 444545.0 | 0 |
| 443065.0 | 0 |
| 441591.0 | 0 |
| 440122.0 | 0 |
| 438657.0 | 0 |
| 437198.0 | 0 |
| 435743.0 | 0 |
| 434293.0 | 0 |
| 432848.0 | 0 |
| 431408.0 | 0 |
| 429972.0 | 0 |
| 428542.0 | 0 |
| 427116.0 | 0 |
| 425694.0 | 0 |
| 424278.0 | 0 |
| 422866.0 | 0 |
| 421459.0 | 0 |
| 420057.0 | 0 |
| 418659.0 | 0 |
| 417266.0 | 0 |
| 415878.0 | 0 |
| 414494.0 | 0 |
| 413115.0 | 0 |
| 411740.0 | 0 |
| 410370.0 | 0 |
| 409004.0 | 0 |
| 407644.0 | 0 |
| 406287.0 | 0 |
| 404935.0 | 0 |
| 403588.0 | 0 |
| 402245.0 | 0 |
| 400906.0 | 0 |
| 399573.0 | 0 |
| 398243.0 | 0 |
| 396918.0 | 0 |
| 395597.0 | 0 |
| 394281.0 | 0 |
| 392969.0 | 0 |
| 391661.0 | 0 |
| 390358.0 | 0 |
| 389059.0 | 0 |
| 387765.0 | 0 |
| 386474.0 | 0 |
| 385188.0 | 0 |
| 383907.0 | 0 |
| 382629.0 | 0 |
| 381356.0 | 0 |
| 380087.0 | 0 |
| 378822.0 | 0 |
| 377562.0 | 0 |
| 376306.0 | 0 |
| 375054.0 | 0 |
| 373806.0 | 0 |
| 372562.0 | 0 |
| 371322.0 | 0 |
| 370087.0 | 0 |
| 368855.0 | 0 |
| 367628.0 | 0 |
| 366405.0 | 0 |
| 365185.0 | 0 |
| 363970.0 | 0 |
| 362759.0 | 0 |
| 361552.0 | 0 |
| 360349.0 | 0 |
| 359150.0 | 0 |
| 357955.0 | 0 |
| 356764.0 | 0 |
| 355577.0 | 0 |
| 354394.0 | 0 |
| 353214.0 | 0 |
| 352039.0 | 0 |
| 350868.0 | 0 |
| 349700.0 | 0 |
| 348537.0 | 0 |
| 347377.0 | 0 |
| 346221.0 | 0 |
| 345069.0 | 0 |
| 343921.0 | 0 |
| 342776.0 | 0 |
| 341636.0 | 0 |
| 340499.0 | 0 |
| 339366.0 | 0 |
| 338237.0 | 0 |
| 337111.0 | 0 |
| 335990.0 | 0 |
| 334872.0 | 0 |
| 333758.0 | 0 |
| 332647.0 | 0 |
| 331540.0 | 0 |
| 330437.0 | 0 |
| 329337.0 | 0 |
| 328242.0 | 0 |
| 327149.0 | 0 |
| 326061.0 | 0 |
| 324976.0 | 0 |
| 323895.0 | 0 |
| 322817.0 | 0 |
| 321743.0 | 0 |
| 320672.0 | 0 |
| 319605.0 | 0 |
| 318542.0 | 0 |
| 317482.0 | 0 |
| 316425.0 | 0 |
| 315372.0 | 0 |
| 314323.0 | 0 |
| 313277.0 | 0 |
| 312235.0 | 0 |
| 311196.0 | 0 |
| 310160.0 | 0 |
| 309128.0 | 0 |
| 308100.0 | 0 |
| 307075.0 | 0 |
| 306053.0 | 0 |
| 305034.0 | 0 |
| 304019.0 | 0 |
| 303008.0 | 0 |
| 302000.0 | 0 |
| 300995.0 | 0 |
| 299993.0 | 0 |
| 298995.0 | 0 |
| 298000.0 | 0 |
| 297009.0 | 0 |
| 296020.0 | 0 |
| 295035.0 | 0 |
| 294054.0 | 0 |
| 293075.0 | 0 |
| 292100.0 | 0 |
| 291128.0 | 0 |
| 290159.0 | 0 |
| 289194.0 | 0 |
| 288232.0 | 0 |
| 287272.0 | 0 |
| 286317.0 | 0 |
| 285364.0 | 0 |
| 284414.0 | 0 |
| 283468.0 | 0 |
| 282525.0 | 0 |
| 281585.0 | 0 |
| 280648.0 | 0 |
| 279714.0 | 0 |
| 278783.0 | 0 |
| 277856.0 | 0 |
| 276931.0 | 0 |
| 276010.0 | 0 |
| 275091.0 | 0 |
| 274176.0 | 0 |
| 273264.0 | 0 |
| 272354.0 | 0 |
| 271448.0 | 0 |
| 270545.0 | 0 |
| 269645.0 | 0 |
| 268747.0 | 0 |
| 267853.0 | 0 |
| 266962.0 | 0 |
| 266074.0 | 0 |
| 265188.0 | 0 |
| 264306.0 | 0 |
| 263426.0 | 0 |
| 262550.0 | 0 |
| 261676.0 | 0 |
| 260806.0 | 0 |
| 259938.0 | 0 |
| 259073.0 | 0 |
| 258211.0 | 0 |
| 257352.0 | 0 |
| 256495.0 | 0 |
| 255642.0 | 0 |
| 254791.0 | 0 |
| 253943.0 | 0 |
| 253098.0 | 0 |
| 252256.0 | 0 |
| 251417.0 | 0 |
| 250580.0 | 0 |
| 249746.0 | 0 |
| 248915.0 | 0 |
| 248087.0 | 0 |
| 247262.0 | 0 |
| 246439.0 | 0 |
| 245619.0 | 0 |
| 244802.0 | 0 |
| 243987.0 | 0 |
| 243175.0 | 0 |
| 242366.0 | 0 |
| 241560.0 | 0 |
| 240756.0 | 0 |
| 239955.0 | 0 |
| 239156.0 | 0 |
| 238361.0 | 0 |
| 237567.0 | 0 |
| 236777.0 | 0 |
| 235989.0 | 0 |
| 235204.0 | 0 |
| 234421.0 | 0 |
| 233641.0 | 0 |
| 232864.0 | 0 |
| 232089.0 | 0 |
| 231317.0 | 0 |
| 230547.0 | 0 |
| 229780.0 | 0 |
| 229015.0 | 0 |
| 228253.0 | 0 |
| 227494.0 | 0 |
| 226737.0 | 0 |
| 225982.0 | 0 |
| 225230.0 | 0 |
| 224481.0 | 0 |
| 223734.0 | 0 |
| 222990.0 | 0 |
| 222248.0 | 0 |
| 221508.0 | 0 |
| 220771.0 | 0 |
| 220036.0 | 0 |
| 219304.0 | 0 |
| 218575.0 | 0 |
| 217847.0 | 0 |
| 217122.0 | 0 |
| 216400.0 | 0 |
| 215680.0 | 0 |
| 214962.0 | 0 |
| 214247.0 | 0 |
| 213534.0 | 0 |
| 212824.0 | 0 |
| 212115.0 | 0 |
| 211410.0 | 0 |
| 210706.0 | 0 |
| 210005.0 | 0 |
| 209306.0 | 0 |
| 208610.0 | 0 |
| 207916.0 | 0 |
| 207224.0 | 0 |
| 206534.0 | 0 |
| 205847.0 | 0 |
| 205162.0 | 0 |
| 204480.0 | 0 |
| 203799.0 | 0 |
| 203121.0 | 0 |
| 202445.0 | 0 |
| 201772.0 | 0 |
| 201100.0 | 0 |
| 200431.0 | 0 |
| 199764.0 | 0 |
| 199099.0 | 0 |
| 198437.0 | 0 |
| 197777.0 | 0 |
| 197119.0 | 0 |
| 196463.0 | 0 |
| 195809.0 | 0 |
| 195157.0 | 0 |
| 194508.0 | 0 |
| 193861.0 | 0 |
| 193216.0 | 0 |
| 192573.0 | 0 |
| 191932.0 | 0 |
| 191293.0 | 0 |
| 190657.0 | 0 |
| 190023.0 | 0 |
| 189390.0 | 0 |
| 188760.0 | 0 |
| 188132.0 | 0 |
| 187506.0 | 0 |
| 186882.0 | 0 |
| 186260.0 | 0 |
| 185640.0 | 0 |
| 185023.0 | 0 |
| 184407.0 | 0 |
| 183794.0 | 0 |
| 183182.0 | 0 |
| 182572.0 | 0 |
| 181965.0 | 0 |
| 181359.0 | 0 |
| 180756.0 | 0 |
| 180155.0 | 0 |
| 179555.0 | 0 |
| 178958.0 | 0 |
| 178362.0 | 0 |
| 177769.0 | 0 |
| 177177.0 | 0 |
| 176588.0 | 0 |
| 176000.0 | 0 |
| 175414.0 | 0 |
| 174831.0 | 0 |
| 174249.0 | 0 |
| 173669.0 | 0 |
| 173091.0 | 0 |
| 172515.0 | 0 |
| 171941.0 | 0 |
| 171369.0 | 0 |
| 170799.0 | 0 |
| 170231.0 | 0 |
| 169664.0 | 0 |
| 169100.0 | 0 |
| 168537.0 | 0 |
| 167976.0 | 0 |
| 167417.0 | 0 |
| 166860.0 | 0 |
| 166305.0 | 0 |
| 165752.0 | 0 |
| 165200.0 | 0 |
| 164650.0 | 0 |
| 164103.0 | 0 |
| 163557.0 | 0 |
| 163012.0 | 0 |
| 162470.0 | 0 |
| 161929.0 | 0 |
| 161391.0 | 0 |
| 160854.0 | 0 |
| 160318.0 | 0 |
| 159785.0 | 0 |
| 159253.0 | 0 |
| 158723.0 | 0 |
| 158195.0 | 0 |
| 157669.0 | 0 |
| 157144.0 | 0 |
| 156621.0 | 0 |
| 156100.0 | 0 |
| 155581.0 | 0 |
| 155063.0 | 0 |
| 154547.0 | 0 |
| 154033.0 | 0 |
| 153520.0 | 0 |
| 153009.0 | 0 |
| 152500.0 | 0 |
| 151993.0 | 0 |
| 151487.0 | 0 |
| 150983.0 | 0 |
| 150481.0 | 0 |
| 149980.0 | 0 |
| 149481.0 | 0 |
| 148984.0 | 0 |
| 148488.0 | 0 |
| 147994.0 | 0 |
| 147501.0 | 0 |
| 147010.0 | 0 |
| 146521.0 | 0 |
| 146034.0 | 0 |
| 145548.0 | 0 |
| 145064.0 | 0 |
| 144581.0 | 0 |
| 144100.0 | 0 |
| 143620.0 | 0 |
| 143142.0 | 0 |
| 142666.0 | 0 |
| 142191.0 | 0 |
| 141718.0 | 0 |
| 141247.0 | 0 |
| 140777.0 | 0 |
| 140308.0 | 0 |
| 139841.0 | 0 |
| 139376.0 | 0 |
| 138912.0 | 0 |
| 138450.0 | 0 |
| 137989.0 | 0 |
| 137530.0 | 0 |
| 137073.0 | 0 |
| 136617.0 | 0 |
| 136162.0 | 0 |
| 135709.0 | 0 |
| 135257.0 | 0 |
| 134807.0 | 0 |
| 134359.0 | 0 |
| 133912.0 | 0 |
| 133466.0 | 0 |
| 133022.0 | 0 |
| 132579.0 | 0 |
| 132138.0 | 0 |
| 131699.0 | 0 |
| 131260.0 | 0 |
| 130824.0 | 0 |
| 130388.0 | 0 |
| 129954.0 | 0 |
| 129522.0 | 0 |
| 129091.0 | 0 |
| 128662.0 | 0 |
| 128233.0 | 0 |
| 127807.0 | 0 |
| 127381.0 | 0 |
| 126958.0 | 0 |
| 126535.0 | 0 |
| 126114.0 | 0 |
| 125694.0 | 0 |
| 125276.0 | 0 |
| 124859.0 | 0 |
| 124444.0 | 0 |
| 124030.0 | 0 |
| 123617.0 | 0 |
| 123206.0 | 0 |
| 122796.0 | 0 |
| 122387.0 | 0 |
| 121980.0 | 0 |
| 121574.0 | 0 |
| 121170.0 | 0 |
| 120766.0 | 0 |
| 120365.0 | 0 |
| 119964.0 | 0 |
| 119565.0 | 0 |
| 119167.0 | 0 |
| 118771.0 | 0 |
| 118375.0 | 0 |
| 117981.0 | 0 |
| 117589.0 | 0 |
| 117198.0 | 0 |
| 116808.0 | 0 |
| 116419.0 | 0 |
| 116032.0 | 0 |
| 115646.0 | 0 |
| 115261.0 | 0 |
| 114877.0 | 0 |
| 114495.0 | 0 |
| 114114.0 | 0 |
| 113734.0 | 0 |
| 113356.0 | 0 |
| 112979.0 | 0 |
| 112603.0 | 0 |
| 112228.0 | 0 |
| 111855.0 | 0 |
| 111482.0 | 0 |
| 111112.0 | 0 |
| 110742.0 | 0 |
| 110373.0 | 0 |
| 110006.0 | 0 |
| 109640.0 | 0 |
| 109275.0 | 0 |
| 108912.0 | 0 |
| 108549.0 | 0 |
| 108188.0 | 0 |
| 107828.0 | 0 |
| 107469.0 | 0 |
| 107112.0 | 0 |
| 106755.0 | 0 |
| 106400.0 | 0 |
| 106046.0 | 0 |
| 105693.0 | 0 |
| 105341.0 | 0 |
| 104991.0 | 0 |
| 104642.0 | 0 |
| 104293.0 | 0 |
| 103946.0 | 0 |
| 103600.0 | 0 |
| 103256.0 | 0 |
| 102912.0 | 0 |
| 102570.0 | 0 |
| 102228.0 | 0 |
| 101888.0 | 0 |
| 101549.0 | 0 |
| 101211.0 | 0 |
| 100875.0 | 0 |
| 100539.0 | 0 |
| 100204.0 | 0 |
| 99871.0 | 0 |
| 99538.7 | 0 |
| 99207.5 | 0 |
| 98877.4 | 0 |
| 98548.4 | 0 |
| 98220.4 | 0 |
| 97893.6 | 0 |
| 97567.9 | 0 |
| 97243.2 | 0 |
| 96919.7 | 0 |
| 96597.2 | 0 |
| 96275.8 | 0 |
| 95955.4 | 0 |
| 95636.1 | 0 |
| 95317.9 | 0 |
| 95000.7 | 0 |
| 94684.6 | 0 |
| 94369.6 | 0 |
| 94055.6 | 0 |
| 93742.6 | 0 |
| 93430.7 | 0 |
| 93119.8 | 0 |
| 92809.9 | 0 |
| 92501.1 | 0 |
| 92193.3 | 0 |
| 91886.6 | 0 |
| 91580.8 | 0 |
| 91276.1 | 0 |
| 90972.4 | 0 |
| 90669.7 | 0 |
| 90368.0 | 0 |
| 90067.3 | 0 |
| 89767.6 | 0 |
| 89468.9 | 0 |
| 89171.2 | 0 |
| 88874.5 | 0 |
| 88578.8 | 0 |
| 88284.0 | 0 |
| 87990.3 | 0 |
| 87697.5 | 0 |
| 87405.7 | 0 |
| 87114.9 | 0 |
| 86825.0 | 0 |
| 86536.1 | 0 |
| 86248.1 | 0 |
| 85961.2 | 0 |
| 85675.1 | 0 |
| 85390.1 | 0 |
| 85105.9 | 0 |
| 84822.7 | 0 |
| 84540.5 | 0 |
| 84259.2 | 0 |
| 83978.8 | 0 |
| 83699.4 | 0 |
| 83420.9 | 0 |
| 83143.3 | 0 |
| 82866.7 | 0 |
| 82590.9 | 0 |
| 82316.1 | 0 |
| 82042.2 | 0 |
| 81769.2 | 0 |
| 81497.1 | 0 |
| 81226.0 | 0 |
| 80955.7 | 0 |
| 80686.3 | 0 |
| 80417.9 | 0 |
| 80150.3 | 0 |
| 79883.6 | 0 |
| 79617.8 | 0 |
| 79352.8 | 0 |
| 79088.8 | 0 |
| 78825.6 | 0 |
| 78563.4 | 0 |
| 78301.9 | 0 |
| 78041.4 | 0 |
| 77781.7 | 0 |
| 77522.9 | 0 |
| 77265.0 | 0 |
| 77007.9 | 0 |
| 76751.6 | 0 |
| 76496.2 | 0 |
| 76241.7 | 0 |
| 75988.0 | 0 |
| 75735.2 | 0 |
| 75483.2 | 0 |
| 75232.0 | 0 |
| 74981.7 | 0 |
| 74732.2 | 0 |
| 74483.5 | 0 |
| 74235.7 | 0 |
| 73988.7 | 0 |
| 73742.5 | 0 |
| 73497.1 | 0 |
| 73252.5 | 0 |
| 73008.8 | 0 |
| 72765.9 | 0 |
| 72523.7 | 0 |
| 72282.4 | 0 |
| 72041.9 | 0 |
| 71802.2 | 0 |
| 71563.3 | 0 |
| 71325.2 | 0 |
| 71087.8 | 0 |
| 70851.3 | 0 |
| 70615.5 | 0 |
| 70380.6 | 0 |
| 70146.4 | 0 |
| 69913.0 | 0 |
| 69680.3 | 0 |
| 69448.5 | 0 |
| 69217.4 | 0 |
| 68987.1 | 0 |
| 68757.5 | 0 |
| 68528.8 | 0 |
| 68300.7 | 0 |
| 68073.5 | 0 |
| 67847.0 | 0 |
| 67621.2 | 0 |
| 67396.2 | 0 |
| 67171.9 | 0 |
| 66948.4 | 0 |
| 66725.7 | 0 |
| 66503.6 | 0 |
| 66282.4 | 0 |
| 66061.8 | 0 |
| 65842.0 | 0 |
| 65622.9 | 0 |
| 65404.6 | 0 |
| 65186.9 | 0 |
| 64970.0 | 0 |
| 64753.8 | 0 |
| 64538.4 | 0 |
| 64323.6 | 0 |
| 64109.6 | 0 |
| 63896.3 | 0 |
| 63683.7 | 0 |
| 63471.8 | 0 |
| 63260.6 | 0 |
| 63050.1 | 0 |
| 62840.3 | 0 |
| 62631.2 | 0 |
| 62422.8 | 0 |
| 62215.1 | 0 |
| 62008.1 | 0 |
| 61801.7 | 0 |
| 61596.1 | 0 |
| 61391.1 | 0 |
| 61186.9 | 0 |
| 60983.3 | 0 |
| 60780.3 | 0 |
| 60578.1 | 0 |
| 60376.5 | 0 |
| 60175.6 | 0 |
| 59975.4 | 0 |
| 59775.8 | 0 |
| 59576.9 | 0 |
| 59378.7 | 0 |
| 59181.1 | 0 |
| 58984.2 | 0 |
| 58787.9 | 0 |
| 58592.3 | 0 |
| 58397.4 | 0 |
| 58203.1 | 0 |
| 58009.4 | 0 |
| 57816.4 | 0 |
| 57624.0 | 0 |
| 57432.3 | 0 |
| 57241.2 | 0 |
| 57050.7 | 0 |
| 56860.9 | 0 |
| 56671.7 | 0 |
| 56483.1 | 0 |
| 56295.1 | 0 |
| 56107.8 | 0 |
| 55921.1 | 0 |
| 55735.1 | 0 |
| 55549.6 | 0 |
| 55364.8 | 0 |
| 55180.5 | 0 |
| 54996.9 | 0 |
| 54813.9 | 0 |
| 54631.5 | 0 |
| 54449.8 | 0 |
| 54268.6 | 0 |
| 54088.0 | 0 |
| 53908.0 | 0 |
| 53728.7 | 0 |
| 53549.9 | 0 |
| 53371.7 | 0 |
| 53194.1 | 0 |
| 53017.1 | 0 |
| 52840.7 | 0 |
| 52664.9 | 0 |
| 52489.6 | 0 |
| 52315.0 | 0 |
| 52140.9 | 0 |
| 51967.4 | 0 |
| 51794.5 | 0 |
| 51622.2 | 0 |
| 51450.4 | 0 |
| 51279.2 | 0 |
| 51108.6 | 0 |
| 50938.5 | 0 |
| 50769.0 | 0 |
| 50600.1 | 0 |
| 50431.7 | 0 |
| 50263.9 | 0 |
| 50096.7 | 0 |
| 49930.0 | 0 |
| 49763.8 | 0 |
| 49598.2 | 0 |
| 49433.2 | 0 |
| 49268.7 | 0 |
| 49104.8 | 0 |
| 48941.4 | 0 |
| 48778.5 | 0 |
| 48616.2 | 0 |
| 48454.5 | 0 |
| 48293.2 | 0 |
| 48132.5 | 0 |
| 47972.4 | 0 |
| 47812.8 | 0 |
| 47653.7 | 0 |
| 47495.1 | 0 |
| 47337.1 | 0 |
| 47179.6 | 0 |
| 47022.6 | 0 |
| 46866.1 | 0 |
| 46710.2 | 0 |
| 46554.7 | 0 |
| 46399.8 | 0 |
| 46245.4 | 0 |
| 46091.6 | 0 |
| 45938.2 | 0 |
| 45785.3 | 0 |
| 45633.0 | 0 |
| 45481.2 | 0 |
| 45329.8 | 0 |
| 45179.0 | 0 |
| 45028.7 | 0 |
| 44878.8 | 0 |
| 44729.5 | 0 |
| 44580.7 | 0 |
| 44432.3 | 0 |
| 44284.5 | 0 |
| 44137.1 | 0 |
| 43990.3 | 0 |
| 43843.9 | 0 |
| 43698.0 | 0 |
| 43552.6 | 0 |
| 43407.7 | 0 |
| 43263.2 | 0 |
| 43119.3 | 0 |
| 42975.8 | 0 |
| 42832.8 | 0 |
| 42690.3 | 0 |
| 42548.2 | 0 |
| 42406.7 | 0 |
| 42265.6 | 0 |
| 42124.9 | 0 |
| 41984.8 | 0 |
| 41845.1 | 0 |
| 41705.8 | 0 |
| 41567.1 | 0 |
| 41428.7 | 0 |
| 41290.9 | 0 |
| 41153.5 | 0 |
| 41016.6 | 0 |
| 40880.1 | 0 |
| 40744.1 | 0 |
| 40608.5 | 0 |
| 40473.4 | 0 |
| 40338.7 | 0 |
| 40204.5 | 0 |
| 40070.7 | 0 |
| 39937.4 | 0 |
| 39804.5 | 0 |
| 39672.0 | 0 |
| 39540.0 | 0 |
| 39408.5 | 0 |
| 39277.3 | 0 |
| 39146.6 | 0 |
| 39016.4 | 0 |
| 38886.6 | 0 |
| 38757.2 | 0 |
| 38628.2 | 0 |
| 38499.7 | 0 |
| 38371.6 | 0 |
| 38243.9 | 0 |
| 38116.6 | 0 |
| 37989.8 | 0 |
| 37863.4 | 0 |
| 37737.4 | 0 |
| 37611.8 | 0 |
| 37486.7 | 0 |
| 37361.9 | 0 |
| 37237.6 | 0 |
| 37113.7 | 0 |
| 36990.2 | 0 |
| 36867.1 | 0 |
| 36744.5 | 0 |
| 36622.2 | 0 |
| 36500.4 | 0 |
| 36378.9 | 0 |
| 36257.9 | 0 |
| 36137.2 | 0 |
| 36017.0 | 0 |
| 35897.1 | 0 |
| 35777.7 | 0 |
| 35658.6 | 0 |
| 35540.0 | 0 |
| 35421.7 | 0 |
| 35303.9 | 0 |
| 35186.4 | 0 |
| 35069.3 | 0 |
| 34952.6 | 0 |
| 34836.3 | 0 |
| 34720.4 | 0 |
| 34604.9 | 0 |
| 34489.7 | 0 |
| 34375.0 | 0 |
| 34260.6 | 0 |
| 34146.6 | 0 |
| 34033.0 | 0 |
| 33919.7 | 0 |
| 33806.9 | 0 |
| 33694.4 | 0 |
| 33582.3 | 0 |
| 33470.5 | 0 |
| 33359.1 | 0 |
| 33248.1 | 0 |
| 33137.5 | 0 |
| 33027.2 | 0 |
| 32917.4 | 0 |
| 32807.8 | 0 |
| 32698.7 | 0 |
| 32589.9 | 0 |
| 32481.4 | 0 |
| 32373.3 | 0 |
| 32265.6 | 0 |
| 32158.3 | 0 |
| 32051.2 | 0 |
| 31944.6 | 0 |
| 31838.3 | 0 |
| 31732.4 | 0 |
| 31626.8 | 0 |
| 31521.5 | 0 |
| 31416.7 | 0 |
| 31312.1 | 0 |
| 31207.9 | 0 |
| 31104.1 | 0 |
| 31000.6 | 0 |
| 30897.4 | 0 |
| 30794.6 | 0 |
| 30692.2 | 0 |
| 30590.0 | 0 |
| 30488.3 | 0 |
| 30386.8 | 0 |
| 30285.7 | 0 |
| 30184.9 | 0 |
| 30084.5 | 0 |
| 29984.4 | 0 |
| 29884.6 | 0 |
| 29785.2 | 0 |
| 29686.1 | 0 |
| 29587.3 | 0 |
| 29488.8 | 0 |
| 29390.7 | 0 |
| 29292.9 | 0 |
| 29195.5 | 0 |
| 29098.3 | 0 |
| 29001.5 | 0 |
| 28905.0 | 0 |
| 28808.8 | 0 |
| 28712.9 | 0 |
| 28617.4 | 0 |
| 28522.2 | 0 |
| 28427.3 | 0 |
| 28332.7 | 0 |
| 28238.4 | 0 |
| 28144.5 | 0 |
| 28050.8 | 0 |
| 27957.5 | 0 |
| 27864.4 | 0 |
| 27771.7 | 0 |
| 27679.3 | 0 |
| 27587.2 | 0 |
| 27495.4 | 0 |
| 27403.9 | 0 |
| 27312.7 | 0 |
| 27221.9 | 0 |
| 27131.3 | 0 |
| 27041.0 | 0 |
| 26951.0 | 0 |
| 26861.4 | 0 |
| 26772.0 | 0 |
| 26682.9 | 0 |
| 26594.1 | 0 |
| 26505.6 | 0 |
| 26417.4 | 0 |
| 26329.5 | 0 |
| 26241.9 | 0 |
| 26154.6 | 0 |
| 26067.6 | 0 |
| 25980.8 | 0 |
| 25894.4 | 0 |
| 25808.2 | 0 |
| 25722.3 | 0 |
| 25636.8 | 0 |
| 25551.5 | 0 |
| 25466.4 | 0 |
| 25381.7 | 0 |
| 25297.2 | 0 |
| 25213.1 | 0 |
| 25129.2 | 0 |
| 25045.6 | 0 |
| 24962.2 | 0 |
| 24879.2 | 0 |
| 24796.4 | 0 |
| 24713.9 | 0 |
| 24631.6 | 0 |
| 24549.7 | 0 |
| 24468.0 | 0 |
| 24386.6 | 0 |
| 24305.4 | 0 |
| 24224.5 | 0 |
| 24143.9 | 0 |
| 24063.6 | 0 |
| 23983.5 | 0 |
| 23903.7 | 0 |
| 23824.2 | 0 |
| 23744.9 | 0 |
| 23665.9 | 0 |
| 23587.2 | 0 |
| 23508.7 | 0 |
| 23430.5 | 0 |
| 23352.5 | 0 |
| 23274.8 | 0 |
| 23197.3 | 0 |
| 23120.2 | 0 |
| 23043.2 | 0 |
| 22966.6 | 0 |
| 22890.1 | 0 |
| 22814.0 | 0 |
| 22738.1 | 0 |
| 22662.4 | 0 |
| 22587.0 | 0 |
| 22511.8 | 0 |
| 22436.9 | 0 |
| 22362.3 | 0 |
| 22287.9 | 0 |
| 22213.7 | 0 |
| 22139.8 | 0 |
| 22066.1 | 0 |
| 21992.7 | 0 |
| 21919.5 | 0 |
| 21846.6 | 0 |
| 21773.9 | 0 |
| 21701.4 | 0 |
| 21629.2 | 0 |
| 21557.3 | 0 |
| 21485.5 | 0 |
| 21414.0 | 0 |
| 21342.8 | 0 |
| 21271.8 | 0 |
| 21201.0 | 0 |
| 21130.4 | 0 |
| 21060.1 | 0 |
| 20990.1 | 0 |
| 20920.2 | 0 |
| 20850.6 | 0 |
| 20781.2 | 0 |
| 20712.1 | 0 |
| 20643.2 | 0 |
| 20574.5 | 0 |
| 20506.0 | 0 |
| 20437.8 | 0 |
| 20369.8 | 0 |
| 20302.0 | 0 |
| 20234.4 | 0 |
| 20167.1 | 0 |
| 20100.0 | 0 |
| 20033.1 | 0 |
| 19966.5 | 0 |
| 19900.0 | 0 |
| 19833.8 | 0 |
| 19767.8 | 0 |
| 19702.0 | 0 |
| 19636.5 | 0 |
| 19571.1 | 0 |
| 19506.0 | 0 |
| 19441.1 | 0 |
| 19376.4 | 0 |
| 19312.0 | 0 |
| 19247.7 | 0 |
| 19183.7 | 0 |
| 19119.8 | 0 |
| 19056.2 | 0 |
| 18992.8 | 0 |
| 18929.6 | 0 |
| 18866.6 | 0 |
| 18803.8 | 0 |
| 18741.3 | 0 |
| 18678.9 | 0 |
| 18616.8 | 0 |
| 18554.8 | 0 |
| 18493.1 | 0 |
| 18431.5 | 0 |
| 18370.2 | 0 |
| 18309.1 | 0 |
| 18248.2 | 0 |
| 18187.4 | 0 |
| 18126.9 | 0 |
| 18066.6 | 0 |
| 18006.5 | 0 |
| 17946.6 | 0 |
| 17886.9 | 0 |
| 17827.3 | 0 |
| 17768.0 | 0 |
| 17708.9 | 0 |
| 17650.0 | 0 |
| 17591.2 | 0 |
| 17532.7 | 0 |
| 17474.4 | 0 |
| 17416.2 | 0 |
| 17358.3 | 0 |
| 17300.5 | 0 |
| 17243.0 | 0 |
| 17185.6 | 0 |
| 17128.4 | 0 |
| 17071.4 | 0 |
| 17014.6 | 0 |
| 16958.0 | 0 |
| 16901.6 | 0 |
| 16845.3 | 0 |
| 16789.3 | 0 |
| 16733.4 | 0 |
| 16677.7 | 0 |
| 16622.2 | 0 |
| 16566.9 | 0 |
| 16511.8 | 0 |
| 16456.9 | 0 |
| 16402.1 | 0 |
| 16347.5 | 0 |
| 16293.1 | 0 |
| 16238.9 | 0 |
| 16184.9 | 0 |
| 16131.0 | 0 |
| 16077.3 | 0 |
| 16023.8 | 0 |
| 15970.5 | 0 |
| 15917.4 | 0 |
| 15864.4 | 0 |
| 15811.6 | 0 |
| 15759.0 | 0 |
| 15706.6 | 0 |
| 15654.3 | 0 |
| 15602.2 | 0 |
| 15550.3 | 0 |
| 15498.6 | 0 |
| 15447.0 | 0 |
| 15395.6 | 0 |
| 15344.4 | 0 |
| 15293.3 | 0 |
| 15242.4 | 0 |
| 15191.7 | 0 |
| 15141.2 | 0 |
| 15090.8 | 0 |
| 15040.6 | 0 |
| 14990.5 | 0 |
| 14940.7 | 0 |
| 14890.9 | 0 |
| 14841.4 | 0 |
| 14792.0 | 0 |
| 14742.8 | 0 |
| 14693.7 | 0 |
| 14644.8 | 0 |
| 14596.1 | 0 |
| 14547.5 | 0 |
| 14499.1 | 0 |
| 14450.9 | 0 |
| 14402.8 | 0 |
| 14354.9 | 0 |
| 14307.1 | 0 |
| 14259.5 | 0 |
| 14212.1 | 0 |
| 14164.8 | 0 |
| 14117.6 | 0 |
| 14070.7 | 0 |
| 14023.8 | 0 |
| 13977.2 | 0 |
| 13930.7 | 0 |
| 13884.3 | 0 |
| 13838.1 | 0 |
| 13792.1 | 0 |
| 13746.2 | 0 |
| 13700.4 | 0 |
| 13654.9 | 0 |
| 13609.4 | 0 |
| 13564.1 | 0 |
| 13519.0 | 0 |
| 13474.0 | 0 |
| 13429.2 | 0 |
| 13384.5 | 0 |
| 13340.0 | 0 |
| 13295.6 | 0 |
| 13251.3 | 0 |
| 13207.2 | 0 |
| 13163.3 | 0 |
| 13119.5 | 0 |
| 13075.8 | 0 |
| 13032.3 | 0 |
| 12989.0 | 0 |
| 12945.8 | 0 |
| 12902.7 | 0 |
| 12859.7 | 0 |
| 12817.0 | 0 |
| 12774.3 | 0 |
| 12731.8 | 0 |
| 12689.4 | 0 |
| 12647.2 | 0 |
| 12605.1 | 0 |
| 12563.2 | 0 |
| 12521.4 | 0 |
| 12479.7 | 0 |
| 12438.2 | 0 |
| 12396.8 | 0 |
| 12355.6 | 0 |
| 12314.5 | 0 |
| 12273.5 | 0 |
| 12232.6 | 0 |
| 12191.9 | 0 |
| 12151.4 | 0 |
| 12110.9 | 0 |
| 12070.6 | 0 |
| 12030.5 | 0 |
| 11990.4 | 0 |
| 11950.5 | 0 |
| 11910.8 | 0 |
| 11871.1 | 0 |
| 11831.6 | 0 |
| 11792.3 | 0 |
| 11753.0 | 0 |
| 11713.9 | 0 |
| 11675.0 | 0 |
| 11636.1 | 0 |
| 11597.4 | 0 |
| 11558.8 | 0 |
| 11520.3 | 0 |
| 11482.0 | 0 |
| 11443.8 | 0 |
| 11405.7 | 0 |
| 11367.8 | 0 |
| 11329.9 | 0 |
| 11292.2 | 0 |
| 11254.7 | 0 |
| 11217.2 | 0 |
| 11179.9 | 0 |
| 11142.7 | 0 |
| 11105.6 | 0 |
| 11068.7 | 0 |
| 11031.8 | 0 |
| 10995.1 | 0 |
| 10958.5 | 0 |
| 10922.1 | 0 |
| 10885.7 | 0 |
| 10849.5 | 0 |
| 10813.4 | 0 |
| 10777.4 | 0 |
| 10741.6 | 0 |
| 10705.8 | 0 |
| 10670.2 | 0 |
| 10634.7 | 0 |
| 10599.3 | 0 |
| 10564.1 | 0 |
| 10528.9 | 0 |
| 10493.9 | 0 |
| 10458.9 | 0 |
| 10424.1 | 0 |
| 10389.5 | 0 |
| 10354.9 | 0 |
| 10320.4 | 0 |
| 10286.1 | 0 |
| 10251.9 | 0 |
| 10217.8 | 0 |
| 10183.8 | 0 |
| 10149.9 | 0 |
| 10116.1 | 0 |
| 10082.4 | 0 |
| 10048.9 | 0 |
| 10015.5 | 0 |
| 9982.13 | 0 |
| 9948.91 | 0 |
| 9915.81 | 0 |
| 9882.81 | 0 |
| 9849.93 | 0 |
| 9817.16 | 0 |
| 9784.49 | 0 |
| 9751.93 | 0 |
| 9719.48 | 0 |
| 9687.14 | 0 |
| 9654.91 | 0 |
| 9622.78 | 0 |
| 9590.76 | 0 |
| 9558.85 | 0 |
| 9527.05 | 0 |
| 9495.35 | 0 |
| 9463.75 | 0 |
| 9432.26 | 0 |
| 9400.87 | 0 |
| 9369.59 | 0 |
| 9338.42 | 0 |
| 9307.34 | 0 |
| 9276.38 | 0 |
| 9245.51 | 0 |
| 9214.75 | 0 |
| 9184.08 | 0 |
| 9153.52 | 0 |
| 9123.07 | 0 |
| 9092.71 | 0 |
| 9062.46 | 0 |
| 9032.3 | 0 |
| 9002.25 | 0 |
| 8972.29 | 0 |
| 8942.44 | 0 |
| 8912.68 | 0 |
| 8883.03 | 0 |
| 8853.47 | 0 |
| 8824.01 | 0 |
| 8794.65 | 0 |
| 8765.38 | 0 |
| 8736.22 | 0 |
| 8707.15 | 0 |
| 8678.18 | 0 |
| 8649.3 | 0 |
| 8620.52 | 0 |
| 8591.84 | 0 |
| 8563.25 | 0 |
| 8534.75 | 0 |
| 8506.36 | 0 |
| 8478.05 | 0 |
| 8449.84 | 0 |
| 8421.73 | 0 |
| 8393.7 | 0 |
| 8365.77 | 0 |
| 8337.94 | 0 |
| 8310.19 | 0 |
| 8282.54 | 0 |
| 8254.98 | 0 |
| 8227.51 | 0 |
| 8200.14 | 0 |
| 8172.85 | 0 |
| 8145.66 | 0 |
| 8118.55 | 0 |
| 8091.54 | 0 |
| 8064.62 | 0 |
| 8037.78 | 0 |
| 8011.04 | 0 |
| 7984.38 | 0 |
| 7957.81 | 0 |
| 7931.33 | 0 |
| 7904.94 | 0 |
| 7878.64 | 0 |
| 7852.42 | 0 |
| 7826.3 | 0 |
| 7800.25 | 0 |
| 7774.3 | 0 |
| 7748.43 | 0 |
| 7722.65 | 0 |
| 7696.95 | 0 |
| 7671.34 | 0 |
| 7645.82 | 0 |
| 7620.38 | 0 |
| 7595.02 | 0 |
| 7569.75 | 0 |
| 7544.56 | 0 |
| 7519.46 | 0 |
| 7494.44 | 0 |
| 7469.5 | 0 |
| 7444.64 | 0 |
| 7419.87 | 0 |
| 7395.18 | 0 |
| 7370.58 | 0 |
| 7346.05 | 0 |
| 7321.61 | 0 |
| 7297.25 | 0 |
| 7272.96 | 0 |
| 7248.76 | 0 |
| 7224.64 | 0 |
| 7200.61 | 0 |
| 7176.65 | 0 |
| 7152.77 | 0 |
| 7128.97 | 0 |
| 7105.24 | 0 |
| 7081.6 | 0 |
| 7058.04 | 0 |
| 7034.55 | 0 |
| 7011.15 | 0 |
| 6987.82 | 0 |
| 6964.57 | 0 |
| 6941.39 | 0 |
| 6918.3 | 0 |
| 6895.28 | 0 |
| 6872.33 | 0 |
| 6849.47 | 0 |
| 6826.67 | 0 |
| 6803.96 | 0 |
| 6781.32 | 0 |
| 6758.75 | 0 |
| 6736.27 | 0 |
| 6713.85 | 0 |
| 6691.51 | 0 |
| 6669.25 | 0 |
| 6647.05 | 0 |
| 6624.94 | 0 |
| 6602.89 | 0 |
| 6580.92 | 0 |
| 6559.02 | 0 |
| 6537.2 | 0 |
| 6515.45 | 0 |
| 6493.77 | 0 |
| 6472.16 | 0 |
| 6450.63 | 0 |
| 6429.16 | 0 |
| 6407.77 | 0 |
| 6386.45 | 0 |
| 6365.2 | 0 |
| 6344.02 | 0 |
| 6322.91 | 0 |
| 6301.87 | 0 |
| 6280.9 | 0 |
| 6260.0 | 0 |
| 6239.17 | 0 |
| 6218.41 | 0 |
| 6197.72 | 0 |
| 6177.1 | 0 |
| 6156.54 | 0 |
| 6136.06 | 0 |
| 6115.64 | 0 |
| 6095.29 | 0 |
| 6075.01 | 0 |
| 6054.8 | 0 |
| 6034.65 | 0 |
| 6014.57 | 0 |
| 5994.56 | 0 |
| 5974.61 | 0 |
| 5954.73 | 0 |
| 5934.92 | 0 |
| 5915.17 | 0 |
| 5895.49 | 0 |
| 5875.87 | 0 |
| 5856.32 | 0 |
| 5836.83 | 0 |
| 5817.41 | 0 |
| 5798.05 | 0 |
| 5778.76 | 0 |
| 5759.53 | 0 |
| 5740.37 | 0 |
| 5721.27 | 0 |
| 5702.23 | 0 |
| 5683.25 | 0 |
| 5664.34 | 0 |
| 5645.5 | 0 |
| 5626.71 | 0 |
| 5607.99 | 0 |
| 5589.33 | 0 |
| 5570.73 | 0 |
| 5552.2 | 0 |
| 5533.72 | 0 |
| 5515.31 | 0 |
| 5496.96 | 0 |
| 5478.67 | 0 |
| 5460.44 | 0 |
| 5442.27 | 0 |
| 5424.16 | 0 |
| 5406.11 | 0 |
| 5388.12 | 0 |
| 5370.19 | 0 |
| 5352.32 | 0 |
| 5334.51 | 0 |
| 5316.76 | 0 |
| 5299.07 | 0 |
| 5281.44 | 0 |
| 5263.87 | 0 |
| 5246.35 | 0 |
| 5228.89 | 0 |
| 5211.5 | 0 |
| 5194.15 | 0 |
| 5176.87 | 0 |
| 5159.65 | 0 |
| 5142.48 | 0 |
| 5125.37 | 0 |
| 5108.31 | 0 |
| 5091.31 | 0 |
| 5074.37 | 0 |
| 5057.49 | 0 |
| 5040.66 | 0 |
| 5023.89 | 0 |
| 5007.17 | 0 |
| 4990.51 | 0 |
| 4973.91 | 0 |
| 4957.35 | 0 |
| 4940.86 | 0 |
| 4924.42 | 0 |
| 4908.03 | 0 |
| 4891.7 | 0 |
| 4875.43 | 0 |
| 4859.2 | 0 |
| 4843.03 | 0 |
| 4826.92 | 0 |
| 4810.86 | 0 |
| 4794.85 | 0 |
| 4778.9 | 0 |
| 4763.0 | 0 |
| 4747.15 | 0 |
| 4731.35 | 0 |
| 4715.61 | 0 |
| 4699.92 | 0 |
| 4684.28 | 0 |
| 4668.69 | 0 |
| 4653.16 | 0 |
| 4637.67 | 0 |
| 4622.24 | 0 |
| 4606.86 | 0 |
| 4591.53 | 0 |
| 4576.26 | 0 |
| 4561.03 | 0 |
| 4545.85 | 0 |
| 4530.73 | 0 |
| 4515.65 | 0 |
| 4500.62 | 0 |
| 4485.65 | 0 |
| 4470.72 | 0 |
| 4455.85 | 0 |
| 4441.02 | 0 |
| 4426.24 | 0 |
| 4411.52 | 0 |
| 4396.84 | 0 |
| 4382.21 | 0 |
| 4367.63 | 0 |
| 4353.09 | 0 |
| 4338.61 | 0 |
| 4324.17 | 0 |
| 4309.78 | 0 |
| 4295.44 | 0 |
| 4281.15 | 0 |
| 4266.9 | 0 |
| 4252.71 | 0 |
| 4238.56 | 0 |
| 4224.45 | 0 |
| 4210.4 | 0 |
| 4196.39 | 0 |
| 4182.42 | 0 |
| 4168.51 | 0 |
| 4154.64 | 0 |
| 4140.81 | 0 |
| 4127.03 | 0 |
| 4113.3 | 0 |
| 4099.61 | 0 |
| 4085.97 | 0 |
| 4072.38 | 0 |
| 4058.83 | 0 |
| 4045.32 | 0 |
| 4031.86 | 0 |
| 4018.45 | 0 |
| 4005.07 | 0 |
| 3991.75 | 0 |
| 3978.47 | 0 |
| 3965.23 | 0 |
| 3952.03 | 0 |
| 3938.88 | 0 |
| 3925.78 | 0 |
| 3912.71 | 0 |
| 3899.7 | 0 |
| 3886.72 | 0 |
| 3873.79 | 0 |
| 3860.9 | 0 |
| 3848.05 | 0 |
| 3835.25 | 0 |
| 3822.48 | 0 |
| 3809.77 | 0 |
| 3797.09 | 0 |
| 3784.45 | 0 |
| 3771.86 | 0 |
| 3759.31 | 0 |
| 3746.8 | 0 |
| 3734.34 | 0 |
| 3721.91 | 0 |
| 3709.53 | 0 |
| 3697.18 | 0 |
| 3684.88 | 0 |
| 3672.62 | 0 |
| 3660.4 | 0 |
| 3648.22 | 0 |
| 3636.08 | 0 |
| 3623.98 | 0 |
| 3611.92 | 0 |
| 3599.9 | 0 |
| 3587.93 | 0 |
| 3575.99 | 0 |
| 3564.09 | 0 |
| 3552.23 | 0 |
| 3540.41 | 0 |
| 3528.63 | 0 |
| 3516.89 | 0 |
| 3505.19 | 0 |
| 3493.52 | 0 |
| 3481.9 | 0 |
| 3470.31 | 0 |
| 3458.76 | 0 |
| 3447.26 | 0 |
| 3435.79 | 0 |
| 3424.35 | 0 |
| 3412.96 | 0 |
| 3401.6 | 0 |
| 3390.28 | 0 |
| 3379.0 | 0 |
| 3367.76 | 0 |
| 3356.55 | 0 |
| 3345.38 | 0 |
| 3334.25 | 0 |
| 3323.16 | 0 |
| 3312.1 | 0 |
| 3301.08 | 0 |
| 3290.1 | 0 |
| 3279.15 | 0 |
| 3268.24 | 0 |
| 3257.36 | 0 |
| 3246.52 | 0 |
| 3235.72 | 0 |
| 3224.96 | 0 |
| 3214.22 | 0 |
| 3203.53 | 0 |
| 3192.87 | 0 |
| 3182.25 | 0 |
| 3171.66 | 0 |
| 3161.1 | 0 |
| 3150.59 | 0 |
| 3140.1 | 0 |
| 3129.65 | 0 |
| 3119.24 | 0 |
| 3108.86 | 0 |
| 3098.52 | 0 |
| 3088.21 | 0 |
| 3077.93 | 0 |
| 3067.69 | 0 |
| 3057.48 | 0 |
| 3047.31 | 0 |
| 3037.17 | 0 |
| 3027.06 | 0 |
| 3016.99 | 0 |
| 3006.95 | 0 |
| 2996.95 | 0 |
| 2986.97 | 0 |
| 2977.03 | 0 |
| 2967.13 | 0 |
| 2957.26 | 0 |
| 2947.42 | 0 |
| 2937.61 | 0 |
| 2927.83 | 0 |
| 2918.09 | 0 |
| 2908.38 | 0 |
| 2898.7 | 0 |
| 2889.06 | 0 |
| 2879.45 | 0 |
| 2869.87 | 0 |
| 2860.32 | 0 |
| 2850.8 | 0 |
| 2841.31 | 0 |
| 2831.86 | 0 |
| 2822.44 | 0 |
| 2813.04 | 0 |
| 2803.68 | 0 |
| 2794.35 | 0 |
| 2785.06 | 0 |
| 2775.79 | 0 |
| 2766.55 | 0 |
| 2757.35 | 0 |
| 2748.17 | 0 |
| 2739.03 | 0 |
| 2729.92 | 0 |
| 2720.83 | 0 |
| 2711.78 | 0 |
| 2702.75 | 0 |
| 2693.76 | 0 |
| 2684.8 | 0 |
| 2675.86 | 0 |
| 2666.96 | 0 |
| 2658.09 | 0 |
| 2649.24 | 0 |
| 2640.43 | 0 |
| 2631.64 | 0 |
| 2622.89 | 0 |
| 2614.16 | 0 |
| 2605.46 | 0 |
| 2596.79 | 0 |
| 2588.15 | 0 |
| 2579.54 | 0 |
| 2570.95 | 0 |
| 2562.4 | 0 |
| 2553.87 | 0 |
| 2545.38 | 0 |
| 2536.91 | 0 |
| 2528.46 | 0 |
| 2520.05 | 0 |
| 2511.67 | 0 |
| 2503.31 | 0 |
| 2494.98 | 0 |
| 2486.68 | 0 |
| 2478.4 | 0 |
| 2470.16 | 0 |
| 2461.94 | 0 |
| 2453.75 | 0 |
| 2445.58 | 0 |
| 2437.44 | 0 |
| 2429.33 | 0 |
| 2421.25 | 0 |
| 2413.19 | 0 |
| 2405.16 | 0 |
| 2397.16 | 0 |
| 2389.18 | 0 |
| 2381.23 | 0 |
| 2373.31 | 0 |
| 2365.41 | 0 |
| 2357.54 | 0 |
| 2349.7 | 0 |
| 2341.88 | 0 |
| 2334.09 | 0 |
| 2326.32 | 0 |
| 2318.58 | 0 |
| 2310.87 | 0 |
| 2303.18 | 0 |
| 2295.51 | 0 |
| 2287.87 | 0 |
| 2280.26 | 0 |
| 2272.67 | 0 |
| 2265.11 | 0 |
| 2257.57 | 0 |
| 2250.06 | 0 |
| 2242.58 | 0 |
| 2235.11 | 0 |
| 2227.68 | 0 |
| 2220.26 | 0 |
| 2212.88 | 0 |
| 2205.51 | 0 |
| 2198.17 | 0 |
| 2190.86 | 0 |
| 2183.57 | 0 |
| 2176.31 | 0 |
| 2169.06 | 0 |
| 2161.85 | 0 |
| 2154.65 | 0 |
| 2147.48 | 0 |
| 2140.34 | 0 |
| 2133.22 | 0 |
| 2126.12 | 0 |
| 2119.04 | 0 |
| 2111.99 | 0 |
| 2104.96 | 0 |
| 2097.96 | 0 |
| 2090.98 | 0 |
| 2084.02 | 0 |
| 2077.09 | 0 |
| 2070.18 | 0 |
| 2063.29 | 0 |
| 2056.42 | 0 |
| 2049.58 | 0 |
| 2042.76 | 0 |
| 2035.96 | 0 |
| 2029.19 | 0 |
| 2022.44 | 0 |
| 2015.71 | 0 |
| 2009.0 | 0 |
| 2002.32 | 0 |
| 1995.65 | 0 |
| 1989.01 | 0 |
| 1982.39 | 0 |
| 1975.8 | 0 |
| 1969.22 | 0 |
| 1962.67 | 0 |
| 1956.14 | 0 |
| 1949.63 | 0 |
| 1943.14 | 0 |
| 1936.68 | 0 |
| 1930.23 | 0 |
| 1923.81 | 0 |
| 1917.41 | 0 |
| 1911.03 | 0 |
| 1904.67 | 0 |
| 1898.33 | 0 |
| 1892.02 | 0 |
| 1885.72 | 0 |
| 1879.45 | 0 |
| 1873.19 | 0 |
| 1866.96 | 0 |
| 1860.75 | 0 |
| 1854.56 | 0 |
| 1848.39 | 0 |
| 1842.24 | 0 |
| 1836.11 | 0 |
| 1830.0 | 0 |
| 1823.91 | 0 |
| 1817.84 | 0 |
| 1811.79 | 0 |
| 1805.76 | 0 |
| 1799.75 | 0 |
| 1793.76 | 0 |
| 1787.8 | 0 |
| 1781.85 | 0 |
| 1775.92 | 0 |
| 1770.01 | 0 |
| 1764.12 | 0 |
| 1758.25 | 0 |
| 1752.4 | 0 |
| 1746.57 | 0 |
| 1740.76 | 0 |
| 1734.96 | 0 |
| 1729.19 | 0 |
| 1723.44 | 0 |
| 1717.7 | 0 |
| 1711.99 | 0 |
| 1706.29 | 0 |
| 1700.61 | 0 |
| 1694.95 | 0 |
| 1689.31 | 0 |
| 1683.69 | 0 |
| 1678.09 | 0 |
| 1672.51 | 0 |
| 1666.94 | 0 |
| 1661.4 | 0 |
| 1655.87 | 0 |
| 1650.36 | 0 |
| 1644.87 | 0 |
| 1639.39 | 0 |
| 1633.94 | 0 |
| 1628.5 | 0 |
| 1623.08 | 0 |
| 1617.68 | 0 |
| 1612.3 | 0 |
| 1606.93 | 0 |
| 1601.59 | 0 |
| 1596.26 | 0 |
| 1590.95 | 0 |
| 1585.65 | 0 |
| 1580.38 | 0 |
| 1575.12 | 0 |
| 1569.88 | 0 |
| 1564.65 | 0 |
| 1559.45 | 0 |
| 1554.26 | 0 |
| 1549.09 | 0 |
| 1543.93 | 0 |
| 1538.79 | 0 |
| 1533.67 | 0 |
| 1528.57 | 0 |
| 1523.49 | 0 |
| 1518.42 | 0 |
| 1513.36 | 0 |
| 1508.33 | 0 |
| 1503.31 | 0 |
| 1498.31 | 0 |
| 1493.32 | 0 |
| 1488.35 | 0 |
| 1483.4 | 0 |
| 1478.46 | 0 |
| 1473.54 | 0 |
| 1468.64 | 0 |
| 1463.75 | 0 |
| 1458.88 | 0 |
| 1454.03 | 0 |
| 1449.19 | 0 |
| 1444.37 | 0 |
| 1439.56 | 0 |
| 1434.77 | 0 |
| 1430.0 | 0 |
| 1425.24 | 0 |
| 1420.5 | 0 |
| 1415.77 | 0 |
| 1411.06 | 0 |
| 1406.37 | 0 |
| 1401.69 | 0 |
| 1397.02 | 0 |
| 1392.37 | 0 |
| 1387.74 | 0 |
| 1383.12 | 0 |
| 1378.52 | 0 |
| 1373.93 | 0 |
| 1369.36 | 0 |
| 1364.81 | 0 |
| 1360.27 | 0 |
| 1355.74 | 0 |
| 1351.23 | 0 |
| 1346.73 | 0 |
| 1342.25 | 0 |
| 1337.78 | 0 |
| 1333.33 | 0 |
| 1328.9 | 0 |
| 1324.47 | 0 |
| 1320.07 | 0 |
| 1315.68 | 0 |
| 1311.3 | 0 |
| 1306.93 | 0 |
| 1302.59 | 0 |
| 1298.25 | 0 |
| 1293.93 | 0 |
| 1289.63 | 0 |
| 1285.33 | 0 |
| 1281.06 | 0 |
| 1276.8 | 0 |
| 1272.55 | 0 |
| 1268.31 | 0 |
| 1264.09 | 0 |
| 1259.89 | 0 |
| 1255.69 | 0 |
| 1251.52 | 0 |
| 1247.35 | 0 |
| 1243.2 | 0 |
| 1239.06 | 0 |
| 1234.94 | 0 |
| 1230.83 | 0 |
| 1226.74 | 0 |
| 1222.65 | 0 |
| 1218.59 | 0 |
| 1214.53 | 0 |
| 1210.49 | 0 |
| 1206.46 | 0 |
| 1202.45 | 0 |
| 1198.45 | 0 |
| 1194.46 | 0 |
| 1190.48 | 0 |
| 1186.52 | 0 |
| 1182.58 | 0 |
| 1178.64 | 0 |
| 1174.72 | 0 |
| 1170.81 | 0 |
| 1166.91 | 0 |
| 1163.03 | 0 |
| 1159.16 | 0 |
| 1155.3 | 0 |
| 1151.46 | 0 |
| 1147.63 | 0 |
| 1143.81 | 0 |
| 1140.0 | 0 |
| 1136.21 | 0 |
| 1132.43 | 0 |
| 1128.66 | 0 |
| 1124.91 | 0 |
| 1121.16 | 0 |
| 1117.43 | 0 |
| 1113.72 | 0 |
| 1110.01 | 0 |
| 1106.32 | 0 |
| 1102.63 | 0 |
| 1098.97 | 0 |
| 1095.31 | 0 |
| 1091.66 | 0 |
| 1088.03 | 0 |
| 1084.41 | 0 |
| 1080.8 | 0 |
| 1077.21 | 0 |
| 1073.62 | 0 |
| 1070.05 | 0 |
| 1066.49 | 0 |
| 1062.94 | 0 |
| 1059.4 | 0 |
| 1055.88 | 0 |
| 1052.37 | 0 |
| 1048.86 | 0 |
| 1045.37 | 0 |
| 1041.9 | 0 |
| 1038.43 | 0 |
| 1034.97 | 0 |
| 1031.53 | 0 |
| 1028.1 | 0 |
| 1024.68 | 0 |
| 1021.27 | 0 |
| 1017.87 | 0 |
| 1014.48 | 0 |
| 1011.11 | 0 |
| 1007.74 | 0 |
| 1004.39 | 0 |
| 1001.05 | 0 |
| 997.716 | 0 |
| 994.396 | 0 |
| 991.087 | 0 |
| 987.79 | 0 |
| 984.503 | 0 |
| 981.227 | 0 |
| 977.962 | 0 |
| 974.708 | 0 |
| 971.465 | 0 |
| 968.232 | 0 |
| 965.01 | 0 |
| 961.799 | 0 |
| 958.599 | 0 |
| 955.409 | 0 |
| 952.23 | 0 |
| 949.062 | 0 |
| 945.904 | 0 |
| 942.757 | 0 |
| 939.62 | 0 |
| 936.493 | 0 |
| 933.377 | 0 |
| 930.271 | 0 |
| 927.176 | 0 |
| 924.091 | 0 |
| 921.016 | 0 |
| 917.951 | 0 |
| 914.897 | 0 |
| 911.853 | 0 |
| 908.818 | 0 |
| 905.794 | 0 |
| 902.78 | 0 |
| 899.777 | 0 |
| 896.783 | 0 |
| 893.799 | 0 |
| 890.825 | 0 |
| 887.86 | 0 |
| 884.906 | 0 |
| 881.962 | 0 |
| 879.027 | 0 |
| 876.102 | 0 |
| 873.187 | 0 |
| 870.281 | 0 |
| 867.386 | 0 |
| 864.5 | 0 |
| 861.623 | 0 |
| 858.756 | 0 |
| 855.899 | 0 |
| 853.051 | 0 |
| 850.212 | 0 |
| 847.383 | 0 |
| 844.564 | 0 |
| 841.753 | 0 |
| 838.952 | 0 |
| 836.161 | 0 |
| 833.379 | 0 |
| 830.606 | 0 |
| 827.842 | 0 |
| 825.087 | 0 |
| 822.342 | 0 |
| 819.606 | 0 |
| 816.878 | 0 |
| 814.16 | 0 |
| 811.451 | 0 |
| 808.751 | 0 |
| 806.06 | 0 |
| 803.378 | 0 |
| 800.705 | 0 |
| 798.041 | 0 |
| 795.385 | 0 |
| 792.739 | 0 |
| 790.101 | 0 |
| 787.472 | 0 |
| 784.852 | 0 |
| 782.24 | 0 |
| 779.637 | 0 |
| 777.043 | 0 |
| 774.457 | 0 |
| 771.881 | 0 |
| 769.312 | 0 |
| 766.752 | 0 |
| 764.201 | 0 |
| 761.658 | 0 |
| 759.124 | 0 |
| 756.598 | 0 |
| 754.08 | 0 |
| 751.571 | 0 |
| 749.07 | 0 |
| 746.578 | 0 |
| 744.094 | 0 |
| 741.618 | 0 |
| 739.15 | 0 |
| 736.691 | 0 |
| 734.239 | 0 |
| 731.796 | 0 |
| 729.361 | 0 |
| 726.934 | 0 |
| 724.516 | 0 |
| 722.105 | 0 |
| 719.702 | 0 |
| 717.307 | 0 |
| 714.921 | 0 |
| 712.542 | 0 |
| 710.171 | 0 |
| 707.808 | 0 |
| 705.453 | 0 |
| 703.105 | 0 |
| 700.766 | 0 |
| 698.434 | 0 |
| 696.11 | 0 |
| 693.794 | 0 |
| 691.485 | 0 |
| 689.184 | 0 |
| 686.891 | 0 |
| 684.606 | 0 |
| 682.328 | 0 |
| 680.057 | 0 |
| 677.794 | 0 |
| 675.539 | 0 |
| 673.291 | 0 |
| 671.051 | 0 |
| 668.818 | 0 |
| 666.593 | 0 |
| 664.375 | 0 |
| 662.164 | 0 |
| 659.961 | 0 |
| 657.765 | 0 |
| 655.576 | 0 |
| 653.395 | 0 |
| 651.22 | 0 |
| 649.054 | 0 |
| 646.894 | 0 |
| 644.741 | 0 |
| 642.596 | 0 |
| 640.458 | 0 |
| 638.327 | 0 |
| 636.203 | 0 |
| 634.086 | 0 |
| 631.976 | 0 |
| 629.873 | 0 |
| 627.777 | 0 |
| 625.688 | 0 |
| 623.607 | 0 |
| 621.532 | 0 |
| 619.463 | 0 |
| 617.402 | 0 |
| 615.348 | 0 |
| 613.3 | 0 |
| 611.26 | 0 |
| 609.226 | 0 |
| 607.199 | 0 |
| 605.178 | 0 |
| 603.164 | 0 |
| 601.157 | 0 |
| 599.157 | 0 |
| 597.163 | 0 |
| 595.177 | 0 |
| 593.196 | 0 |
| 591.222 | 0 |
| 589.255 | 0 |
| 587.294 | 0 |
| 585.34 | 0 |
| 583.393 | 0 |
| 581.451 | 0 |
| 579.517 | 0 |
| 577.588 | 0 |
| 575.666 | 0 |
| 573.751 | 0 |
| 571.842 | 0 |
| 569.939 | 0 |
| 568.043 | 0 |
| 566.153 | 0 |
| 564.269 | 0 |
| 562.391 | 0 |
| 560.52 | 0 |
| 558.655 | 0 |
| 556.796 | 0 |
| 554.943 | 0 |
| 553.097 | 0 |
| 551.256 | 0 |
| 549.422 | 0 |
| 547.594 | 0 |
| 545.772 | 0 |
| 543.956 | 0 |
| 542.146 | 0 |
| 540.342 | 0 |
| 538.544 | 0 |
| 536.752 | 0 |
| 534.966 | 0 |
| 533.186 | 0 |
| 531.412 | 0 |
| 529.643 | 0 |
| 527.881 | 0 |
| 526.125 | 0 |
| 524.374 | 0 |
| 522.629 | 0 |
| 520.89 | 0 |
| 519.157 | 0 |
| 517.429 | 0 |
| 515.708 | 0 |
| 513.992 | 0 |
| 512.282 | 0 |
| 510.577 | 0 |
| 508.878 | 0 |
| 507.185 | 0 |
| 505.497 | 0 |
| 503.815 | 0 |
| 502.139 | 0 |
| 500.468 | 0 |
| 498.803 | 0 |
| 497.143 | 0 |
| 495.489 | 0 |
| 493.84 | 0 |
| 492.197 | 0 |
| 490.559 | 0 |
| 488.927 | 0 |
| 487.3 | 0 |
| 485.678 | 0 |
| 484.062 | 0 |
| 482.452 | 0 |
| 480.846 | 0 |
| 479.246 | 0 |
| 477.652 | 0 |
| 476.062 | 0 |
| 474.478 | 0 |
| 472.9 | 0 |
| 471.326 | 0 |
| 469.758 | 0 |
| 468.195 | 0 |
| 466.637 | 0 |
| 465.084 | 0 |
| 463.537 | 0 |
| 461.994 | 0 |
| 460.457 | 0 |
| 458.925 | 0 |
| 457.398 | 0 |
| 455.876 | 0 |
| 454.359 | 0 |
| 452.847 | 0 |
| 451.34 | 0 |
| 449.838 | 0 |
| 448.342 | 0 |
| 446.85 | 0 |
| 445.363 | 0 |
| 443.881 | 0 |
| 442.404 | 0 |
| 440.932 | 0 |
| 439.465 | 0 |
| 438.003 | 0 |
| 436.545 | 0 |
| 435.093 | 0 |
| 433.645 | 0 |
| 432.202 | 0 |
| 430.764 | 0 |
| 429.33 | 0 |
| 427.902 | 0 |
| 426.478 | 0 |
| 425.059 | 0 |
| 423.645 | 0 |
| 422.235 | 0 |
| 420.83 | 0 |
| 419.43 | 0 |
| 418.034 | 0 |
| 416.643 | 0 |
| 415.257 | 0 |
| 413.875 | 0 |
| 412.498 | 0 |
| 411.125 | 0 |
| 409.757 | 0 |
| 408.394 | 0 |
| 407.035 | 0 |
| 405.681 | 0 |
| 404.331 | 0 |
| 402.985 | 0 |
| 401.645 | 0 |
| 400.308 | 0 |
| 398.976 | 0 |
| 397.649 | 0 |
| 396.325 | 0 |
| 395.007 | 0 |
| 393.692 | 0 |
| 392.382 | 0 |
| 391.077 | 0 |
| 389.775 | 0 |
| 388.478 | 0 |
| 387.186 | 0 |
| 385.898 | 0 |
| 384.613 | 0 |
| 383.334 | 0 |
| 382.058 | 0 |
| 380.787 | 0 |
| 379.52 | 0 |
| 378.257 | 0 |
| 376.998 | 0 |
| 375.744 | 0 |
| 374.494 | 0 |
| 373.248 | 0 |
| 372.006 | 0 |
| 370.768 | 0 |
| 369.534 | 0 |
| 368.305 | 0 |
| 367.079 | 0 |
| 365.858 | 0 |
| 364.64 | 0 |
| 363.427 | 0 |
| 362.218 | 0 |
| 361.012 | 0 |
| 359.811 | 0 |
| 358.614 | 0 |
| 357.421 | 0 |
| 356.231 | 0 |
| 355.046 | 0 |
| 353.865 | 0 |
| 352.687 | 0 |
| 351.514 | 0 |
| 350.344 | 0 |
| 349.178 | 0 |
| 348.016 | 0 |
| 346.858 | 0 |
| 345.704 | 0 |
| 344.554 | 0 |
| 343.408 | 0 |
| 342.265 | 0 |
| 341.126 | 0 |
| 339.991 | 0 |
| 338.86 | 0 |
| 337.732 | 0 |
| 336.608 | 0 |
| 335.488 | 0 |
| 334.372 | 0 |
| 333.259 | 0 |
| 332.15 | 0 |
| 331.045 | 0 |
| 329.944 | 0 |
| 328.846 | 0 |
| 327.752 | 0 |
| 326.661 | 0 |
| 325.574 | 0 |
| 324.491 | 0 |
| 323.411 | 0 |
| 322.335 | 0 |
| 321.262 | 0 |
| 320.193 | 0 |
| 319.128 | 0 |
| 318.066 | 0 |
| 317.008 | 0 |
| 315.953 | 0 |
| 314.902 | 0 |
| 313.854 | 0 |
| 312.81 | 0 |
| 311.769 | 0 |
| 310.731 | 0 |
| 309.697 | 0 |
| 308.667 | 0 |
| 307.64 | 0 |
| 306.616 | 0 |
| 305.596 | 0 |
| 304.579 | 0 |
| 303.566 | 0 |
| 302.556 | 0 |
| 301.549 | 0 |
| 300.545 | 0 |
| 299.545 | 0 |
| 298.549 | 0 |
| 297.555 | 0 |
| 296.565 | 0 |
| 295.578 | 0 |
| 294.595 | 0 |
| 293.615 | 0 |
| 292.638 | 0 |
| 291.664 | 0 |
| 290.693 | 0 |
| 289.726 | 0 |
| 288.762 | 0 |
| 287.801 | 0 |
| 286.844 | 0 |
| 285.889 | 0 |
| 284.938 | 0 |
| 283.99 | 0 |
| 283.045 | 0 |
| 282.103 | 0 |
| 281.164 | 0 |
| 280.229 | 0 |
| 279.296 | 0 |
| 278.367 | 0 |
| 277.441 | 0 |
| 276.518 | 0 |
| 275.598 | 0 |
| 274.681 | 0 |
| 273.767 | 0 |
| 272.856 | 0 |
| 271.948 | 0 |
| 271.043 | 0 |
| 270.141 | 0 |
| 269.242 | 0 |
| 268.346 | 0 |
| 267.453 | 0 |
| 266.563 | 0 |
| 265.676 | 0 |
| 264.792 | 0 |
| 263.911 | 0 |
| 263.033 | 0 |
| 262.158 | 0 |
| 261.286 | 0 |
| 260.416 | 0 |
| 259.55 | 0 |
| 258.686 | 0 |
| 257.825 | 0 |
| 256.967 | 0 |
| 256.112 | 0 |
| 255.26 | 0 |
| 254.411 | 0 |
| 253.564 | 0 |
| 252.721 | 0 |
| 251.88 | 0 |
| 251.042 | 0 |
| 250.206 | 0 |
| 249.374 | 0 |
| 248.544 | 0 |
| 247.717 | 0 |
| 246.893 | 0 |
| 246.071 | 0 |
| 245.252 | 0 |
| 244.436 | 0 |
| 243.623 | 0 |
| 242.812 | 0 |
| 242.004 | 0 |
| 241.199 | 0 |
| 240.397 | 0 |
| 239.597 | 0 |
| 238.799 | 0 |
| 238.005 | 0 |
| 237.213 | 0 |
| 236.424 | 0 |
| 235.637 | 0 |
| 234.853 | 0 |
| 234.071 | 0 |
| 233.293 | 0 |
| 232.516 | 0 |
| 231.743 | 0 |
| 230.971 | 0 |
| 230.203 | 0 |
| 229.437 | 0 |
| 228.674 | 0 |
| 227.913 | 0 |
| 227.154 | 0 |
| 226.398 | 0 |
| 225.645 | 0 |
| 224.894 | 0 |
| 224.146 | 0 |
| 223.4 | 0 |
| 222.657 | 0 |
| 221.916 | 0 |
| 221.178 | 0 |
| 220.442 | 0 |
| 219.708 | 0 |
| 218.977 | 0 |
| 218.248 | 0 |
| 217.522 | 0 |
| 216.798 | 0 |
| 216.077 | 0 |
| 215.358 | 0 |
| 214.641 | 0 |
| 213.927 | 0 |
| 213.215 | 0 |
| 212.506 | 0 |
| 211.799 | 0 |
| 211.094 | 0 |
| 210.392 | 0 |
| 209.692 | 0 |
| 208.994 | 0 |
| 208.299 | 0 |
| 207.605 | 0 |
| 206.915 | 0 |
| 206.226 | 0 |
| 205.54 | 0 |
| 204.856 | 0 |
| 204.174 | 0 |
| 203.495 | 0 |
| 202.818 | 0 |
| 202.143 | 0 |
| 201.47 | 0 |
| 200.8 | 0 |
| 200.132 | 0 |
| 199.466 | 0 |
| 198.802 | 0 |
| 198.141 | 0 |
| 197.481 | 0 |
| 196.824 | 0 |
| 196.169 | 0 |
| 195.517 | 0 |
| 194.866 | 0 |
| 194.218 | 0 |
| 193.571 | 0 |
| 192.927 | 0 |
| 192.285 | 0 |
| 191.646 | 0 |
| 191.008 | 0 |
| 190.372 | 0 |
| 189.739 | 0 |
| 189.108 | 0 |
| 188.478 | 0 |
| 187.851 | 0 |
| 187.226 | 0 |
| 186.603 | 0 |
| 185.982 | 0 |
| 185.363 | 0 |
| 184.747 | 0 |
| 184.132 | 0 |
| 183.519 | 0 |
| 182.909 | 0 |
| 182.3 | 0 |
| 181.693 | 0 |
| 181.089 | 0 |
| 180.486 | 0 |
| 179.886 | 0 |
| 179.287 | 0 |
| 178.691 | 0 |
| 178.096 | 0 |
| 177.503 | 0 |
| 176.913 | 0 |
| 176.324 | 0 |
| 175.737 | 0 |
| 175.153 | 0 |
| 174.57 | 0 |
| 173.989 | 0 |
| 173.41 | 0 |
| 172.833 | 0 |
| 172.258 | 0 |
| 171.685 | 0 |
| 171.113 | 0 |
| 170.544 | 0 |
| 169.977 | 0 |
| 169.411 | 0 |
| 168.847 | 0 |
| 168.286 | 0 |
| 167.726 | 0 |
| 167.167 | 0 |
| 166.611 | 0 |
| 166.057 | 0 |
| 165.504 | 0 |
| 164.954 | 0 |
| 164.405 | 0 |
| 163.858 | 0 |
| 163.312 | 0 |
| 162.769 | 0 |
| 162.227 | 0 |
| 161.688 | 0 |
| 161.15 | 0 |
| 160.613 | 0 |
| 160.079 | 0 |
| 159.546 | 0 |
| 159.015 | 0 |
| 158.486 | 0 |
| 157.959 | 0 |
| 157.433 | 0 |
| 156.91 | 0 |
| 156.387 | 0 |
| 155.867 | 0 |
| 155.348 | 0 |
| 154.832 | 0 |
| 154.316 | 0 |
| 153.803 | 0 |
| 153.291 | 0 |
| 152.781 | 0 |
| 152.273 | 0 |
| 151.766 | 0 |
| 151.261 | 0 |
| 150.758 | 0 |
| 150.256 | 0 |
| 149.756 | 0 |
| 149.258 | 0 |
| 148.761 | 0 |
| 148.266 | 0 |
| 147.773 | 0 |
| 147.281 | 0 |
| 146.791 | 0 |
| 146.303 | 0 |
| 145.816 | 0 |
| 145.331 | 0 |
| 144.847 | 0 |
| 144.365 | 0 |
| 143.885 | 0 |
| 143.406 | 0 |
| 142.929 | 0 |
| 142.453 | 0 |
| 141.979 | 0 |
| 141.507 | 0 |
| 141.036 | 0 |
| 140.567 | 0 |
| 140.099 | 0 |
| 139.633 | 0 |
| 139.168 | 0 |
| 138.705 | 0 |
| 138.244 | 0 |
| 137.784 | 0 |
| 137.325 | 0 |
| 136.868 | 0 |
| 136.413 | 0 |
| 135.959 | 0 |
| 135.506 | 0 |
| 135.056 | 0 |
| 134.606 | 0 |
| 134.158 | 0 |
| 133.712 | 0 |
| 133.267 | 0 |
| 132.823 | 0 |
| 132.382 | 0 |
| 131.941 | 0 |
| 131.502 | 0 |
| 131.064 | 0 |
| 130.628 | 0 |
| 130.194 | 0 |
| 129.76 | 0 |
| 129.329 | 0 |
| 128.898 | 0 |
| 128.469 | 0 |
| 128.042 | 0 |
| 127.616 | 0 |
| 127.191 | 0 |
| 126.768 | 0 |
| 126.346 | 0 |
| 125.926 | 0 |
| 125.507 | 0 |
| 125.089 | 0 |
| 124.673 | 0 |
| 124.258 | 0 |
| 123.845 | 0 |
| 123.433 | 0 |
| 123.022 | 0 |
| 122.613 | 0 |
| 122.205 | 0 |
| 121.798 | 0 |
| 121.393 | 0 |
| 120.989 | 0 |
| 120.586 | 0 |
| 120.185 | 0 |
| 119.785 | 0 |
| 119.386 | 0 |
| 118.989 | 0 |
| 118.593 | 0 |
| 118.199 | 0 |
| 117.805 | 0 |
| 117.413 | 0 |
| 117.023 | 0 |
| 116.633 | 0 |
| 116.245 | 0 |
| 115.858 | 0 |
| 115.473 | 0 |
| 115.089 | 0 |
| 114.706 | 0 |
| 114.324 | 0 |
| 113.944 | 0 |
| 113.565 | 0 |
| 113.187 | 0 |
| 112.81 | 0 |
| 112.435 | 0 |
| 112.061 | 0 |
| 111.688 | 0 |
| 111.316 | 0 |
| 110.946 | 0 |
| 110.577 | 0 |
| 110.209 | 0 |
| 109.842 | 0 |
| 109.476 | 0 |
| 109.112 | 0 |
| 108.749 | 0 |
| 108.387 | 0 |
| 108.027 | 0 |
| 107.667 | 0 |
| 107.309 | 0 |
| 106.952 | 0 |
| 106.596 | 0 |
| 106.241 | 0 |
| 105.888 | 0 |
| 105.535 | 0 |
| 105.184 | 0 |
| 104.834 | 0 |
| 104.485 | 0 |
| 104.138 | 0 |
| 103.791 | 0 |
| 103.446 | 0 |
| 103.102 | 0 |
| 102.759 | 0 |
| 102.417 | 0 |
| 102.076 | 0 |
| 101.736 | 0 |
| 101.398 | 0 |
| 101.06 | 0 |
| 100.724 | 0 |
| 100.389 | 0 |
| 100.055 | 0 |
| 99.7219 | 0 |
| 99.3901 | 0 |
| 99.0594 | 0 |
| 98.7298 | 0 |
| 98.4013 | 0 |
| 98.0738 | 0 |
| 97.7475 | 0 |
| 97.4223 | 0 |
| 97.0981 | 0 |
| 96.775 | 0 |
| 96.453 | 0 |
| 96.1321 | 0 |
| 95.8122 | 0 |
| 95.4934 | 0 |
| 95.1756 | 0 |
| 94.8589 | 0 |
| 94.5433 | 0 |
| 94.2287 | 0 |
| 93.9152 | 0 |
| 93.6027 | 0 |
| 93.2912 | 0 |
| 92.9808 | 0 |
| 92.6714 | 0 |
| 92.3631 | 0 |
| 92.0557 | 0 |
| 91.7494 | 0 |
| 91.4441 | 0 |
| 91.1399 | 0 |
| 90.8366 | 0 |
| 90.5344 | 0 |
| 90.2331 | 0 |
| 89.9329 | 0 |
| 89.6336 | 0 |
| 89.3354 | 0 |
| 89.0381 | 0 |
| 88.7418 | 0 |
| 88.4466 | 0 |
| 88.1523 | 0 |
| 87.8589 | 0 |
| 87.5666 | 0 |
| 87.2752 | 0 |
| 86.9848 | 0 |
| 86.6954 | 0 |
| 86.4069 | 0 |
| 86.1194 | 0 |
| 85.8329 | 0 |
| 85.5472 | 0 |
| 85.2626 | 0 |
| 84.9789 | 0 |
| 84.6961 | 0 |
| 84.4143 | 0 |
| 84.1334 | 0 |
| 83.8535 | 0 |
| 83.5745 | 0 |
| 83.2964 | 0 |
| 83.0192 | 0 |
| 82.743 | 0 |
| 82.4677 | 0 |
| 82.1933 | 0 |
| 81.9198 | 0 |
| 81.6472 | 0 |
| 81.3755 | 0 |
| 81.1047 | 0 |
| 80.8349 | 0 |
| 80.5659 | 0 |
| 80.2978 | 0 |
| 80.0306 | 0 |
| 79.7643 | 0 |
| 79.4989 | 0 |
| 79.2344 | 0 |
| 78.9707 | 0 |
| 78.708 | 0 |
| 78.4461 | 0 |
| 78.1851 | 0 |
| 77.9249 | 0 |
| 77.6656 | 0 |
| 77.4072 | 0 |
| 77.1496 | 0 |
| 76.8929 | 0 |
| 76.6371 | 0 |
| 76.3821 | 0 |
| 76.1279 | 0 |
| 75.8746 | 0 |
| 75.6221 | 0 |
| 75.3705 | 0 |
| 75.1197 | 0 |
| 74.8698 | 0 |
| 74.6206 | 0 |
| 74.3723 | 0 |
| 74.1249 | 0 |
| 73.8782 | 0 |
| 73.6324 | 0 |
| 73.3874 | 0 |
| 73.1432 | 0 |
| 72.8998 | 0 |
| 72.6573 | 0 |
| 72.4155 | 0 |
| 72.1745 | 0 |
| 71.9344 | 0 |
| 71.695 | 0 |
| 71.4565 | 0 |
| 71.2187 | 0 |
| 70.9817 | 0 |
| 70.7455 | 0 |
| 70.5101 | 0 |
| 70.2755 | 0 |
| 70.0417 | 0 |
| 69.8086 | 0 |
| 69.5763 | 0 |
| 69.3448 | 0 |
| 69.1141 | 0 |
| 68.8841 | 0 |
| 68.6549 | 0 |
| 68.4265 | 0 |
| 68.1988 | 0 |
| 67.9719 | 0 |
| 67.7457 | 0 |
| 67.5203 | 0 |
| 67.2956 | 0 |
| 67.0717 | 0 |
| 66.8485 | 0 |
| 66.6261 | 0 |
| 66.4044 | 0 |
| 66.1834 | 0 |
| 65.9632 | 0 |
| 65.7437 | 0 |
| 65.525 | 0 |
| 65.3069 | 0 |
| 65.0896 | 0 |
| 64.8731 | 0 |
| 64.6572 | 0 |
| 64.442 | 0 |
| 64.2276 | 0 |
| 64.0139 | 0 |
| 63.8009 | 0 |
| 63.5886 | 0 |
| 63.377 | 0 |
| 63.1661 | 0 |
| 62.956 | 0 |
| 62.7465 | 0 |
| 62.5377 | 0 |
| 62.3296 | 0 |
| 62.1222 | 0 |
| 61.9155 | 0 |
| 61.7095 | 0 |
| 61.5042 | 0 |
| 61.2995 | 0 |
| 61.0955 | 0 |
| 60.8922 | 0 |
| 60.6896 | 0 |
| 60.4877 | 0 |
| 60.2864 | 0 |
| 60.0858 | 0 |
| 59.8859 | 0 |
| 59.6866 | 0 |
| 59.488 | 0 |
| 59.2901 | 0 |
| 59.0928 | 0 |
| 58.8962 | 0 |
| 58.7002 | 0 |
| 58.5049 | 0 |
| 58.3102 | 0 |
| 58.1162 | 0 |
| 57.9228 | 0 |
| 57.7301 | 0 |
| 57.538 | 0 |
| 57.3465 | 0 |
| 57.1557 | 0 |
| 56.9655 | 0 |
| 56.776 | 0 |
| 56.5871 | 0 |
| 56.3988 | 0 |
| 56.2111 | 0 |
| 56.0241 | 0 |
| 55.8377 | 0 |
| 55.6519 | 0 |
| 55.4667 | 0 |
| 55.2821 | 0 |
| 55.0982 | 0 |
| 54.9148 | 0 |
| 54.7321 | 0 |
| 54.55 | 0 |
| 54.3685 | 0 |
| 54.1876 | 0 |
| 54.0073 | 0 |
| 53.8276 | 0 |
| 53.6485 | 0 |
| 53.47 | 0 |
| 53.292 | 0 |
| 53.1147 | 0 |
| 52.938 | 0 |
| 52.7618 | 0 |
| 52.5863 | 0 |
| 52.4113 | 0 |
| 52.2369 | 0 |
| 52.0631 | 0 |
| 51.8898 | 0 |
| 51.7172 | 0 |
| 51.5451 | 0 |
| 51.3736 | 0 |
| 51.2026 | 0 |
| 51.0323 | 0 |
| 50.8625 | 0 |
| 50.6932 | 0 |
| 50.5246 | 0 |
| 50.3564 | 0 |
| 50.1889 | 0 |
| 50.0219 | 0 |
| 49.8554 | 0 |
| 49.6895 | 0 |
| 49.5242 | 0 |
| 49.3594 | 0 |
| 49.1952 | 0 |
| 49.0315 | 0 |
| 48.8683 | 0 |
| 48.7057 | 0 |
| 48.5437 | 0 |
| 48.3821 | 0 |
| 48.2212 | 0 |
| 48.0607 | 0 |
| 47.9008 | 0 |
| 47.7414 | 0 |
| 47.5825 | 0 |
| 47.4242 | 0 |
| 47.2664 | 0 |
| 47.1091 | 0 |
| 46.9524 | 0 |
| 46.7962 | 0 |
| 46.6404 | 0 |
| 46.4853 | 0 |
| 46.3306 | 0 |
| 46.1764 | 0 |
| 46.0228 | 0 |
| 45.8696 | 0 |
| 45.717 | 0 |
| 45.5649 | 0 |
| 45.4133 | 0 |
| 45.2622 | 0 |
| 45.1116 | 0 |
| 44.9614 | 0 |
| 44.8118 | 0 |
| 44.6627 | 0 |
| 44.5141 | 0 |
| 44.366 | 0 |
| 44.2184 | 0 |
| 44.0712 | 0 |
| 43.9246 | 0 |
| 43.7785 | 0 |
| 43.6328 | 0 |
| 43.4876 | 0 |
| 43.3429 | 0 |
| 43.1987 | 0 |
| 43.0549 | 0 |
| 42.9117 | 0 |
| 42.7689 | 0 |
| 42.6266 | 0 |
| 42.4847 | 0 |
| 42.3434 | 0 |
| 42.2025 | 0 |
| 42.0621 | 0 |
| 41.9221 | 0 |
| 41.7826 | 0 |
| 41.6436 | 0 |
| 41.505 | 0 |
| 41.3669 | 0 |
| 41.2293 | 0 |
| 41.0921 | 0 |
| 40.9553 | 0 |
| 40.8191 | 0 |
| 40.6832 | 0 |
| 40.5479 | 0 |
| 40.413 | 0 |
| 40.2785 | 0 |
| 40.1445 | 0 |
| 40.0109 | 0 |
| 39.8777 | 0 |
| 39.7451 | 0 |
| 39.6128 | 0 |
| 39.481 | 0 |
| 39.3496 | 0 |
| 39.2187 | 0 |
| 39.0882 | 0 |
| 38.9581 | 0 |
| 38.8285 | 0 |
| 38.6993 | 0 |
| 38.5705 | 0 |
| 38.4422 | 0 |
| 38.3143 | 0 |
| 38.1868 | 0 |
| 38.0597 | 0 |
| 37.9331 | 0 |
| 37.8069 | 0 |
| 37.6811 | 0 |
| 37.5557 | 0 |
| 37.4307 | 0 |
| 37.3062 | 0 |
| 37.1821 | 0 |
| 37.0583 | 0 |
| 36.935 | 0 |
| 36.8121 | 0 |
| 36.6896 | 0 |
| 36.5676 | 0 |
| 36.4459 | 0 |
| 36.3246 | 0 |
| 36.2037 | 0 |
| 36.0833 | 0 |
| 35.9632 | 0 |
| 35.8435 | 0 |
| 35.7243 | 0 |
| 35.6054 | 0 |
| 35.4869 | 0 |
| 35.3689 | 0 |
| 35.2512 | 0 |
| 35.1339 | 0 |
| 35.017 | 0 |
| 34.9004 | 0 |
| 34.7843 | 0 |
| 34.6686 | 0 |
| 34.5532 | 0 |
| 34.4382 | 0 |
| 34.3237 | 0 |
| 34.2094 | 0 |
| 34.0956 | 0 |
| 33.9822 | 0 |
| 33.8691 | 0 |
| 33.7564 | 0 |
| 33.6441 | 0 |
| 33.5321 | 0 |
| 33.4206 | 0 |
| 33.3093 | 0 |
| 33.1985 | 0 |
| 33.088 | 0 |
| 32.9779 | 0 |
| 32.8682 | 0 |
| 32.7589 | 0 |
| 32.6498 | 0 |
| 32.5412 | 0 |
| 32.4329 | 0 |
| 32.325 | 0 |
| 32.2175 | 0 |
| 32.1103 | 0 |
| 32.0034 | 0 |
| 31.8969 | 0 |
| 31.7908 | 0 |
| 31.685 | 0 |
| 31.5796 | 0 |
| 31.4745 | 0 |
| 31.3698 | 0 |
| 31.2654 | 0 |
| 31.1614 | 0 |
| 31.0577 | 0 |
| 30.9543 | 0 |
| 30.8513 | 0 |
| 30.7487 | 0 |
| 30.6464 | 0 |
| 30.5444 | 0 |
| 30.4427 | 0 |
| 30.3415 | 0 |
| 30.2405 | 0 |
| 30.1399 | 0 |
| 30.0396 | 0 |
| 29.9396 | 0 |
| 29.84 | 0 |
| 29.7407 | 0 |
| 29.6418 | 0 |
| 29.5431 | 0 |
| 29.4448 | 0 |
| 29.3468 | 0 |
| 29.2492 | 0 |
| 29.1519 | 0 |
| 29.0549 | 0 |
| 28.9582 | 0 |
| 28.8618 | 0 |
| 28.7658 | 0 |
| 28.6701 | 0 |
| 28.5747 | 0 |
| 28.4796 | 0 |
| 28.3848 | 0 |
| 28.2904 | 0 |
| 28.1963 | 0 |
| 28.1024 | 0 |
| 28.0089 | 0 |
| 27.9157 | 0 |
| 27.8228 | 0 |
| 27.7303 | 0 |
| 27.638 | 0 |
| 27.546 | 0 |
| 27.4544 | 0 |
| 27.363 | 0 |
| 27.272 | 0 |
| 27.1812 | 0 |
| 27.0908 | 0 |
| 27.0006 | 0 |
| 26.9108 | 0 |
| 26.8213 | 0 |
| 26.732 | 0 |
| 26.6431 | 0 |
| 26.5544 | 0 |
| 26.4661 | 0 |
| 26.378 | 0 |
| 26.2902 | 0 |
| 26.2027 | 0 |
| 26.1156 | 0 |
| 26.0287 | 0 |
| 25.9421 | 0 |
| 25.8557 | 0 |
| 25.7697 | 0 |
| 25.684 | 0 |
| 25.5985 | 0 |
| 25.5133 | 0 |
| 25.4284 | 0 |
| 25.3438 | 0 |
| 25.2595 | 0 |
| 25.1754 | 0 |
| 25.0917 | 0 |
| 25.0082 | 0 |
| 24.925 | 0 |
| 24.842 | 0 |
| 24.7594 | 0 |
| 24.677 | 0 |
| 24.5949 | 0 |
| 24.513 | 0 |
| 24.4315 | 0 |
| 24.3502 | 0 |
| 24.2691 | 0 |
| 24.1884 | 0 |
| 24.1079 | 0 |
| 24.0277 | 0 |
| 23.9477 | 0 |
| 23.8681 | 0 |
| 23.7886 | 0 |
| 23.7095 | 0 |
| 23.6306 | 0 |
| 23.552 | 0 |
| 23.4736 | 0 |
| 23.3955 | 0 |
| 23.3176 | 0 |
| 23.2401 | 0 |
| 23.1627 | 0 |
| 23.0857 | 0 |
| 23.0088 | 0 |
| 22.9323 | 0 |
| 22.856 | 0 |
| 22.7799 | 0 |
| 22.7041 | 0 |
| 22.6286 | 0 |
| 22.5533 | 0 |
| 22.4782 | 0 |
| 22.4034 | 0 |
| 22.3289 | 0 |
| 22.2546 | 0 |
| 22.1805 | 0 |
| 22.1067 | 0 |
| 22.0332 | 0 |
| 21.9599 | 0 |
| 21.8868 | 0 |
| 21.814 | 0 |
| 21.7414 | 0 |
| 21.669 | 0 |
| 21.5969 | 0 |
| 21.5251 | 0 |
| 21.4535 | 0 |
| 21.3821 | 0 |
| 21.3109 | 0 |
| 21.24 | 0 |
| 21.1693 | 0 |
| 21.0989 | 0 |
| 21.0287 | 0 |
| 20.9587 | 0 |
| 20.889 | 0 |
| 20.8195 | 0 |
| 20.7502 | 0 |
| 20.6812 | 0 |
| 20.6123 | 0 |
| 20.5438 | 0 |
| 20.4754 | 0 |
| 20.4073 | 0 |
| 20.3394 | 0 |
| 20.2717 | 0 |
| 20.2042 | 0 |
| 20.137 | 0 |
| 20.07 | 0 |
| 20.0032 | 0 |
| 19.9367 | 0 |
| 19.8703 | 0 |
| 19.8042 | 0 |
| 19.7383 | 0 |
| 19.6726 | 0 |
| 19.6072 | 0 |
| 19.5419 | 0 |
| 19.4769 | 0 |
| 19.4121 | 0 |
| 19.3475 | 0 |
| 19.2831 | 0 |
| 19.219 | 0 |
| 19.155 | 0 |
| 19.0913 | 0 |
| 19.0278 | 0 |
| 18.9644 | 0 |
| 18.9013 | 0 |
| 18.8385 | 0 |
| 18.7758 | 0 |
| 18.7133 | 0 |
| 18.651 | 0 |
| 18.589 | 0 |
| 18.5271 | 0 |
| 18.4655 | 0 |
| 18.404 | 0 |
| 18.3428 | 0 |
| 18.2817 | 0 |
| 18.2209 | 0 |
| 18.1603 | 0 |
| 18.0999 | 0 |
| 18.0396 | 0 |
| 17.9796 | 0 |
| 17.9198 | 0 |
| 17.8602 | 0 |
| 17.8007 | 0 |
| 17.7415 | 0 |
| 17.6825 | 0 |
| 17.6236 | 0 |
| 17.565 | 0 |
| 17.5065 | 0 |
| 17.4483 | 0 |
| 17.3902 | 0 |
| 17.3324 | 0 |
| 17.2747 | 0 |
| 17.2172 | 0 |
| 17.1599 | 0 |
| 17.1028 | 0 |
| 17.0459 | 0 |
| 16.9892 | 0 |
| 16.9327 | 0 |
| 16.8763 | 0 |
| 16.8202 | 0 |
| 16.7642 | 0 |
| 16.7084 | 0 |
| 16.6528 | 0 |
| 16.5974 | 0 |
| 16.5422 | 0 |
| 16.4871 | 0 |
| 16.4323 | 0 |
| 16.3776 | 0 |
| 16.3231 | 0 |
| 16.2688 | 0 |
| 16.2147 | 0 |
| 16.1607 | 0 |
| 16.1069 | 0 |
| 16.0533 | 0 |
| 15.9999 | 0 |
| 15.9467 | 0 |
| 15.8936 | 0 |
| 15.8407 | 0 |
| 15.788 | 0 |
| 15.7355 | 0 |
| 15.6831 | 0 |
| 15.631 | 0 |
| 15.5789 | 0 |
| 15.5271 | 0 |
| 15.4754 | 0 |
| 15.424 | 0 |
| 15.3726 | 0 |
| 15.3215 | 0 |
| 15.2705 | 0 |
| 15.2197 | 0 |
| 15.169 | 0 |
| 15.1186 | 0 |
| 15.0683 | 0 |
| 15.0181 | 0 |
| 14.9682 | 0 |
| 14.9183 | 0 |
| 14.8687 | 0 |
| 14.8192 | 0 |
| 14.7699 | 0 |
| 14.7208 | 0 |
| 14.6718 | 0 |
| 14.623 | 0 |
| 14.5743 | 0 |
| 14.5258 | 0 |
| 14.4775 | 0 |
| 14.4293 | 0 |
| 14.3813 | 0 |
| 14.3335 | 0 |
| 14.2858 | 0 |
| 14.2382 | 0 |
| 14.1909 | 0 |
| 14.1436 | 0 |
| 14.0966 | 0 |
| 14.0497 | 0 |
| 14.0029 | 0 |
| 13.9563 | 0 |
| 13.9099 | 0 |
| 13.8636 | 0 |
| 13.8175 | 0 |
| 13.7715 | 0 |
| 13.7257 | 0 |
| 13.68 | 0 |
| 13.6345 | 0 |
| 13.5891 | 0 |
| 13.5439 | 0 |
| 13.4988 | 0 |
| 13.4539 | 0 |
| 13.4091 | 0 |
| 13.3645 | 0 |
| 13.3201 | 0 |
| 13.2757 | 0 |
| 13.2316 | 0 |
| 13.1875 | 0 |
| 13.1437 | 0 |
| 13.0999 | 0 |
| 13.0563 | 0 |
| 13.0129 | 0 |
| 12.9696 | 0 |
| 12.9264 | 0 |
| 12.8834 | 0 |
| 12.8406 | 0 |
| 12.7978 | 0 |
| 12.7552 | 0 |
| 12.7128 | 0 |
| 12.6705 | 0 |
| 12.6283 | 0 |
| 12.5863 | 0 |
| 12.5444 | 0 |
| 12.5027 | 0 |
| 12.4611 | 0 |
| 12.4196 | 0 |
| 12.3783 | 0 |
| 12.3371 | 0 |
| 12.2961 | 0 |
| 12.2552 | 0 |
| 12.2144 | 0 |
| 12.1737 | 0 |
| 12.1332 | 0 |
| 12.0929 | 0 |
| 12.0526 | 0 |
| 12.0125 | 0 |
| 11.9725 | 0 |
| 11.9327 | 0 |
| 11.893 | 0 |
| 11.8534 | 0 |
| 11.814 | 0 |
| 11.7747 | 0 |
| 11.7355 | 0 |
| 11.6964 | 0 |
| 11.6575 | 0 |
| 11.6187 | 0 |
| 11.5801 | 0 |
| 11.5415 | 0 |
| 11.5031 | 0 |
| 11.4649 | 0 |
| 11.4267 | 0 |
| 11.3887 | 0 |
| 11.3508 | 0 |
| 11.313 | 0 |
| 11.2754 | 0 |
| 11.2379 | 0 |
| 11.2005 | 0 |
| 11.1632 | 0 |
| 11.1261 | 0 |
| 11.089 | 0 |
| 11.0521 | 0 |
| 11.0154 | 0 |
| 10.9787 | 0 |
| 10.9422 | 0 |
| 10.9058 | 0 |
| 10.8695 | 0 |
| 10.8333 | 0 |
| 10.7973 | 0 |
| 10.7613 | 0 |
| 10.7255 | 0 |
| 10.6899 | 0 |
| 10.6543 | 0 |
| 10.6188 | 0 |
| 10.5835 | 0 |
| 10.5483 | 0 |
| 10.5132 | 0 |
| 10.4782 | 0 |
| 10.4433 | 0 |
| 10.4086 | 0 |
| 10.374 | 0 |
| 10.3394 | 0 |
| 10.305 | 0 |
| 10.2707 | 0 |
| 10.2366 | 0 |
| 10.2025 | 0 |
| 10.1686 | 0 |
| 10.1347 | 0 |
| 10.101 | 0 |
| 10.0674 | 0 |
| 10.0339 | 0 |
| 10.0005 | 0 |
| 9.96723 | 0 |
| 9.93406 | 0 |
| 9.90101 | 0 |
| 9.86806 | 0 |
| 9.83523 | 0 |
| 9.8025 | 0 |
| 9.76989 | 0 |
| 9.73738 | 0 |
| 9.70498 | 0 |
| 9.67268 | 0 |
| 9.6405 | 0 |
| 9.60842 | 0 |
| 9.57645 | 0 |
| 9.54458 | 0 |
| 9.51283 | 0 |
| 9.48117 | 0 |
| 9.44962 | 0 |
| 9.41818 | 0 |
| 9.38684 | 0 |
| 9.35561 | 0 |
| 9.32448 | 0 |
| 9.29345 | 0 |
| 9.26253 | 0 |
| 9.23171 | 0 |
| 9.20099 | 0 |
| 9.17038 | 0 |
| 9.13986 | 0 |
| 9.10945 | 0 |
| 9.07914 | 0 |
| 9.04893 | 0 |
| 9.01882 | 0 |
| 8.98881 | 0 |
| 8.9589 | 0 |
| 8.92909 | 0 |
| 8.89938 | 0 |
| 8.86977 | 0 |
| 8.84025 | 0 |
| 8.81084 | 0 |
| 8.78152 | 0 |
| 8.7523 | 0 |
| 8.72318 | 0 |
| 8.69415 | 0 |
| 8.66522 | 0 |
| 8.63639 | 0 |
| 8.60765 | 0 |
| 8.57901 | 0 |
| 8.55047 | 0 |
| 8.52202 | 0 |
| 8.49366 | 0 |
| 8.4654 | 0 |
| 8.43723 | 0 |
| 8.40915 | 0 |
| 8.38117 | 0 |
| 8.35329 | 0 |
| 8.32549 | 0 |
| 8.29779 | 0 |
| 8.27018 | 0 |
| 8.24266 | 0 |
| 8.21523 | 0 |
| 8.1879 | 0 |
| 8.16065 | 0 |
| 8.1335 | 0 |
| 8.10644 | 0 |
| 8.07946 | 0 |
| 8.05258 | 0 |
| 8.02578 | 0 |
| 7.99908 | 0 |
| 7.97246 | 0 |
| 7.94594 | 0 |
| 7.9195 | 0 |
| 7.89314 | 0 |
| 7.86688 | 0 |
| 7.8407 | 0 |
| 7.81461 | 0 |
| 7.78861 | 0 |
| 7.7627 | 0 |
| 7.73687 | 0 |
| 7.71112 | 0 |
| 7.68546 | 0 |
| 7.65989 | 0 |
| 7.6344 | 0 |
| 7.609 | 0 |
| 7.58368 | 0 |
| 7.55845 | 0 |
| 7.5333 | 0 |
| 7.50823 | 0 |
| 7.48325 | 0 |
| 7.45835 | 0 |
| 7.43353 | 0 |
| 7.4088 | 0 |
| 7.38415 | 0 |
| 7.35957 | 0 |
| 7.33509 | 0 |
| 7.31068 | 0 |
| 7.28635 | 0 |
| 7.26211 | 0 |
| 7.23794 | 0 |
| 7.21386 | 0 |
| 7.18986 | 0 |
| 7.16593 | 0 |
| 7.14209 | 0 |
| 7.11833 | 0 |
| 7.09464 | 0 |
| 7.07103 | 0 |
| 7.0475 | 0 |
| 7.02405 | 0 |
| 7.00068 | 0 |
| 6.97739 | 0 |
| 6.95417 | 0 |
| 6.93103 | 0 |
| 6.90797 | 0 |
| 6.88498 | 0 |
| 6.86207 | 0 |
| 6.83924 | 0 |
| 6.81648 | 0 |
| 6.7938 | 0 |
| 6.7712 | 0 |
| 6.74867 | 0 |
| 6.72621 | 0 |
| 6.70383 | 0 |
| 6.68152 | 0 |
| 6.65929 | 0 |
| 6.63713 | 0 |
| 6.61505 | 0 |
| 6.59304 | 0 |
| 6.5711 | 0 |
| 6.54923 | 0 |
| 6.52744 | 0 |
| 6.50572 | 0 |
| 6.48408 | 0 |
| 6.4625 | 0 |
| 6.441 | 0 |
| 6.41957 | 0 |
| 6.3982 | 0 |
| 6.37691 | 0 |
| 6.3557 | 0 |
| 6.33455 | 0 |
| 6.31347 | 0 |
| 6.29246 | 0 |
| 6.27153 | 0 |
| 6.25066 | 0 |
| 6.22986 | 0 |
| 6.20913 | 0 |
| 6.18847 | 0 |
| 6.16788 | 0 |
| 6.14735 | 0 |
| 6.1269 | 0 |
| 6.10651 | 0 |
| 6.08619 | 0 |
| 6.06594 | 0 |
| 6.04576 | 0 |
| 6.02564 | 0 |
| 6.00559 | 0 |
| 5.98561 | 0 |
| 5.96569 | 0 |
| 5.94584 | 0 |
| 5.92606 | 0 |
| 5.90634 | 0 |
| 5.88669 | 0 |
| 5.8671 | 0 |
| 5.84758 | 0 |
| 5.82812 | 0 |
| 5.80873 | 0 |
| 5.7894 | 0 |
| 5.77013 | 0 |
| 5.75093 | 0 |
| 5.7318 | 0 |
| 5.71273 | 0 |
| 5.69372 | 0 |
| 5.67477 | 0 |
| 5.65589 | 0 |
| 5.637069999999999 | 0 |
| 5.61831 | 0 |
| 5.59962 | 0 |
| 5.58099 | 0 |
| 5.56242 | 0 |
| 5.54391 | 0 |
| 5.52546 | 0 |
| 5.50708 | 0 |
| 5.48875 | 0 |
| 5.47049 | 0 |
| 5.45229 | 0 |
| 5.43414 | 0 |
| 5.41606 | 0 |
| 5.39804 | 0 |
| 5.38008 | 0 |
| 5.36218 | 0 |
| 5.34433 | 0 |
| 5.32655 | 0 |
| 5.30883 | 0 |
| 5.29116 | 0 |
| 5.27356 | 0 |
| 5.25601 | 0 |
| 5.23852 | 0 |
| 5.22109 | 0 |
| 5.20372 | 0 |
| 5.1864 | 0 |
| 5.16914 | 0 |
| 5.15194 | 0 |
| 5.1348 | 0 |
| 5.11772 | 0 |
| 5.10069 | 0 |
| 5.08372 | 0 |
| 5.0668 | 0 |
| 5.04994 | 0 |
| 5.03314 | 0 |
| 5.01639 | 0 |
| 4.9997 | 0 |
| 4.98306 | 0 |
| 4.96648 | 0 |
| 4.94996 | 0 |
| 4.93348 | 0 |
| 4.91707 | 0 |
| 4.90071 | 0 |
| 4.8844 | 0 |
| 4.86815 | 0 |
| 4.85195 | 0 |
| 4.83581 | 0 |
| 4.81972 | 0 |
| 4.80368 | 0 |
| 4.787689999999999 | 0 |
| 4.77176 | 0 |
| 4.75589 | 0 |
| 4.74006 | 0 |
| 4.72429 | 0 |
| 4.70857 | 0 |
| 4.6929 | 0 |
| 4.67729 | 0 |
| 4.66172 | 0 |
| 4.64621 | 0 |
| 4.63075 | 0 |
| 4.61534 | 0 |
| 4.59999 | 0 |
| 4.58468 | 0 |
| 4.56942 | 0 |
| 4.55422 | 0 |
| 4.53907 | 0 |
| 4.52396 | 0 |
| 4.50891 | 0 |
| 4.49391 | 0 |
| 4.47895 | 0 |
| 4.46405 | 0 |
| 4.4492 | 0 |
| 4.43439 | 0 |
| 4.41964 | 0 |
| 4.40493 | 0 |
| 4.39027 | 0 |
| 4.37567 | 0 |
| 4.36111 | 0 |
| 4.34659 | 0 |
| 4.33213 | 0 |
| 4.31772 | 0 |
| 4.30335 | 0 |
| 4.28903 | 0 |
| 4.27476 | 0 |
| 4.26054 | 0 |
| 4.24636 | 0 |
| 4.23223 | 0 |
| 4.21815 | 0 |
| 4.20411 | 0 |
| 4.19012 | 0 |
| 4.17618 | 0 |
| 4.16228 | 0 |
| 4.14843 | 0 |
| 4.13463 | 0 |
| 4.12087 | 0 |
| 4.10716 | 0 |
| 4.0935 | 0 |
| 4.07987 | 0 |
| 4.0663 | 0 |
| 4.05277 | 0 |
| 4.03928 | 0 |
| 4.02584 | 0 |
| 4.01245 | 0 |
| 3.9991 | 0 |
| 3.98579 | 0 |
| 3.97253 | 0 |
| 3.95931 | 0 |
| 3.94613 | 0 |
| 3.933 | 0 |
| 3.91992 | 0 |
| 3.90687 | 0 |
| 3.89387 | 0 |
| 3.88092 | 0 |
| 3.868 | 0 |
| 3.85513 | 0 |
| 3.84231 | 0 |
| 3.82952 | 0 |
| 3.81678 | 0 |
| 3.80408 | 0 |
| 3.79142 | 0 |
| 3.77881 | 0 |
| 3.76623 | 0 |
| 3.7537 | 0 |
| 3.74121 | 0 |
| 3.72876 | 0 |
| 3.71635 | 0 |
| 3.70399 | 0 |
| 3.69166 | 0 |
| 3.67938 | 0 |
| 3.66714 | 0 |
| 3.65493 | 0 |
| 3.64277 | 0 |
| 3.63065 | 0 |
| 3.61857 | 0 |
| 3.60653 | 0 |
| 3.59453 | 0 |
| 3.58257 | 0 |
| 3.57065 | 0 |
| 3.55877 | 0 |
| 3.54693 | 0 |
| 3.53512 | 0 |
| 3.52336 | 0 |
| 3.51164 | 0 |
| 3.49995 | 0 |
| 3.48831 | 0 |
| 3.4767 | 0 |
| 3.46513 | 0 |
| 3.4536 | 0 |
| 3.44211 | 0 |
| 3.43066 | 0 |
| 3.41924 | 0 |
| 3.40786 | 0 |
| 3.39652 | 0 |
| 3.38522 | 0 |
| 3.37396 | 0 |
| 3.36273 | 0 |
| 3.35154 | 0 |
| 3.34039 | 0 |
| 3.32928 | 0 |
| 3.3182 | 0 |
| 3.30716 | 0 |
| 3.29615 | 0 |
| 3.28519 | 0 |
| 3.27425 | 0 |
| 3.26336 | 0 |
| 3.2525 | 0 |
| 3.24168 | 0 |
| 3.23089 | 0 |
| 3.22014 | 0 |
| 3.20943 | 0 |
| 3.19875 | 0 |
| 3.1881 | 0 |
| 3.1775 | 0 |
| 3.16692 | 0 |
| 3.15639 | 0 |
| 3.14588 | 0 |
| 3.13542 | 0 |
| 3.12498 | 0 |
| 3.11458 | 0 |
| 3.10422 | 0 |
| 3.09389 | 0 |
| 3.0836 | 0 |
| 3.07334 | 0 |
| 3.06311 | 0 |
| 3.05292 | 0 |
| 3.04276 | 0 |
| 3.03263 | 0 |
| 3.02254 | 0 |
| 3.01249 | 0 |
| 3.00246 | 0 |
| 2.99247 | 0 |
| 2.98252 | 0 |
| 2.97259 | 0 |
| 2.9627 | 0 |
| 2.95284 | 0 |
| 2.94302 | 0 |
| 2.93322 | 0 |
| 2.92346 | 0 |
| 2.91374 | 0 |
| 2.90404 | 0 |
| 2.89438 | 0 |
| 2.88475 | 0 |
| 2.87515 | 0 |
| 2.86558 | 0 |
| 2.85605 | 0 |
| 2.84654 | 0 |
| 2.83707 | 0 |
| 2.82763 | 0 |
| 2.81822 | 0 |
| 2.80885 | 0 |
| 2.7995 | 0 |
| 2.79018 | 0 |
| 2.7809 | 0 |
| 2.77165 | 0 |
| 2.76242 | 0 |
| 2.75323 | 0 |
| 2.74407 | 0 |
| 2.73494 | 0 |
| 2.72584 | 0 |
| 2.71677 | 0 |
| 2.70773 | 0 |
| 2.69872 | 0 |
| 2.68974 | 0 |
| 2.68079 | 0 |
| 2.67187 | 0 |
| 2.66298 | 0 |
| 2.65412 | 0 |
| 2.64529 | 0 |
| 2.63649 | 0 |
| 2.62771 | 0 |
| 2.61897 | 0 |
| 2.61026 | 0 |
| 2.60157 | 0 |
| 2.59291 | 0 |
| 2.58429 | 0 |
| 2.57569 | 0 |
| 2.56712 | 0 |
| 2.55857 | 0 |
| 2.55006 | 0 |
| 2.54158 | 0 |
| 2.53312 | 0 |
| 2.52469 | 0 |
| 2.51629 | 0 |
| 2.50792 | 0 |
| 2.49957 | 0 |
| 2.49125 | 0 |
| 2.48297 | 0 |
| 2.4747 | 0 |
| 2.46647 | 0 |
| 2.45826 | 0 |
| 2.45008 | 0 |
| 2.44193 | 0 |
| 2.4338 | 0 |
| 2.42571 | 0 |
| 2.41764 | 0 |
| 2.40959 | 0 |
| 2.40157 | 0 |
| 2.39358 | 0 |
| 2.38562 | 0 |
| 2.37768 | 0 |
| 2.36977 | 0 |
| 2.36188 | 0 |
| 2.35402 | 0 |
| 2.34619 | 0 |
| 2.33838 | 0 |
| 2.3306 | 0 |
| 2.32285 | 0 |
| 2.31512 | 0 |
| 2.30742 | 0 |
| 2.29974 | 0 |
| 2.29209 | 0 |
| 2.28446 | 0 |
| 2.27686 | 0 |
| 2.26928 | 0 |
| 2.26173 | 0 |
| 2.25421 | 0 |
| 2.2467 | 0 |
| 2.23923 | 0 |
| 2.23178 | 0 |
| 2.22435 | 0 |
| 2.21695 | 0 |
| 2.20957 | 0 |
| 2.20222 | 0 |
| 2.19489 | 0 |
| 2.18759 | 0 |
| 2.18031 | 0 |
| 2.17306 | 0 |
| 2.16583 | 0 |
| 2.15862 | 0 |
| 2.15144 | 0 |
| 2.14428 | 0 |
| 2.13714 | 0 |
| 2.13003 | 0 |
| 2.12294 | 0 |
| 2.11588 | 0 |
| 2.10884 | 0 |
| 2.10182 | 0 |
| 2.09483 | 0 |
| 2.08786 | 0 |
| 2.08091 | 0 |
| 2.07399 | 0 |
| 2.06709 | 0 |
| 2.06021 | 0 |
| 2.05335 | 0 |
| 2.04652 | 0 |
| 2.03971 | 0 |
| 2.03292 | 0 |
| 2.02616 | 0 |
| 2.01942 | 0 |
| 2.0127 | 0 |
| 2.006 | 0 |
| 1.99933 | 0 |
| 1.99267 | 0 |
| 1.98604 | 0 |
| 1.97944 | 0 |
| 1.97285 | 0 |
| 1.96628 | 0 |
| 1.95974 | 0 |
| 1.95322 | 0 |
| 1.94672 | 0 |
| 1.94024 | 0 |
| 1.93379 | 0 |
| 1.92735 | 0 |
| 1.92094 | 0 |
| 1.91455 | 0 |
| 1.90818 | 0 |
| 1.90183 | 0 |
| 1.8955 | 0 |
| 1.88919 | 0 |
| 1.88291 | 0 |
| 1.87664 | 0 |
| 1.8704 | 0 |
| 1.86417 | 0 |
| 1.85797 | 0 |
| 1.85179 | 0 |
| 1.84563 | 0 |
| 1.83949 | 0 |
| 1.83337 | 0 |
| 1.82726 | 0 |
| 1.82118 | 0 |
| 1.81512 | 0 |
| 1.80909 | 0 |
| 1.80307 | 0 |
| 1.79707 | 0 |
| 1.79109 | 0 |
| 1.78513 | 0 |
| 1.77919 | 0 |
| 1.77327 | 0 |
| 1.76737 | 0 |
| 1.76149 | 0 |
| 1.75562 | 0 |
| 1.74978 | 0 |
| 1.74396 | 0 |
| 1.73816 | 0 |
| 1.73237 | 0 |
| 1.72661 | 0 |
| 1.72086 | 0 |
| 1.71514 | 0 |
| 1.70943 | 0 |
| 1.70374 | 0 |
| 1.69807 | 0 |
| 1.69242 | 0 |
| 1.68679 | 0 |
| 1.68118 | 0 |
| 1.67559 | 0 |
| 1.67001 | 0 |
| 1.66445 | 0 |
| 1.65892 | 0 |
| 1.6534 | 0 |
| 1.64789 | 0 |
| 1.64241 | 0 |
| 1.63695 | 0 |
| 1.6315 | 0 |
| 1.62607 | 0 |
| 1.62066 | 0 |
| 1.61527 | 0 |
| 1.60989 | 0 |
| 1.60454 | 0 |
| 1.5992 | 0 |
| 1.59388 | 0 |
| 1.58857 | 0 |
| 1.58329 | 0 |
| 1.57802 | 0 |
| 1.57277 | 0 |
| 1.56753 | 0 |
| 1.56232 | 0 |
| 1.55712 | 0 |
| 1.55194 | 0 |
| 1.54677 | 0 |
| 1.54163 | 0 |
| 1.5365 | 0 |
| 1.53139 | 0 |
| 1.52629 | 0 |
| 1.52121 | 0 |
| 1.51615 | 0 |
| 1.5111 | 0 |
| 1.50608 | 0 |
| 1.50107 | 0 |
| 1.49607 | 0 |
| 1.49109 | 0 |
| 1.48613 | 0 |
| 1.48119 | 0 |
| 1.47626 | 0 |
| 1.47135 | 0 |
| 1.46645 | 0 |
| 1.46157 | 0 |
| 1.45671 | 0 |
| 1.45186 | 0 |
| 1.44703 | 0 |
| 1.44221 | 0 |
| 1.43742 | 0 |
| 1.43263 | 0 |
| 1.42787 | 0 |
| 1.42311 | 0 |
| 1.41838 | 0 |
| 1.41366 | 0 |
| 1.40896 | 0 |
| 1.40427 | 0 |
| 1.39959 | 0 |
| 1.39494 | 0 |
| 1.3903 | 0 |
| 1.38567 | 0 |
| 1.38106 | 0 |
| 1.37646 | 0 |
| 1.37188 | 0 |
| 1.36732 | 0 |
| 1.36277 | 0 |
| 1.35823 | 0 |
| 1.35372 | 0 |
| 1.34921 | 0 |
| 1.34472 | 0 |
| 1.34025 | 0 |
| 1.33579 | 0 |
| 1.33134 | 0 |
| 1.32691 | 0 |
| 1.3225 | 0 |
| 1.3181 | 0 |
| 1.31371 | 0 |
| 1.30934 | 0 |
| 1.30498 | 0 |
| 1.30064 | 0 |
| 1.29631 | 0 |
| 1.292 | 0 |
| 1.2877 | 0 |
| 1.28342 | 0 |
| 1.27915 | 0 |
| 1.27489 | 0 |
| 1.27065 | 0 |
| 1.26642 | 0 |
| 1.26221 | 0 |
| 1.25801 | 0 |
| 1.25382 | 0 |
| 1.24965 | 0 |
| 1.24549 | 0 |
| 1.24135 | 0 |
| 1.23721 | 0 |
| 1.2331 | 0 |
| 1.22899 | 0 |
| 1.22491 | 0 |
| 1.22083 | 0 |
| 1.21677 | 0 |
| 1.21272 | 0 |
| 1.20868 | 0 |
| 1.20466 | 0 |
| 1.20065 | 0 |
| 1.19666 | 0 |
| 1.19268 | 0 |
| 1.18871 | 0 |
| 1.18475 | 0 |
| 1.18081 | 0 |
| 1.17688 | 0 |
| 1.17297 | 0 |
| 1.16906 | 0 |
| 1.16517 | 0 |
| 1.1613 | 0 |
| 1.15743 | 0 |
| 1.15358 | 0 |
| 1.14974 | 0 |
| 1.14592 | 0 |
| 1.1421 | 0 |
| 1.1383 | 0 |
| 1.13452 | 0 |
| 1.13074 | 0 |
| 1.12698 | 0 |
| 1.12323 | 0 |
| 1.11949 | 0 |
| 1.11577 | 0 |
| 1.11205 | 0 |
| 1.10835 | 0 |
| 1.10466 | 0 |
| 1.10099 | 0 |
| 1.09733 | 0 |
| 1.09367 | 0 |
| 1.09003 | 0 |
| 1.08641 | 0 |
| 1.08279 | 0 |
| 1.07919 | 0 |
| 1.0756 | 0 |
| 1.07202 | 0 |
| 1.06845 | 0 |
| 1.0649 | 0 |
| 1.06135 | 0 |
| 1.05782 | 0 |
| 1.0543 | 0 |
| 1.0508 | 0 |
| 1.0473 | 0 |
| 1.04381 | 0 |
| 1.04034 | 0 |
| 1.03688 | 0 |
| 1.03343 | 0 |
| 1.02999 | 0 |
| 1.02656 | 0 |
| 1.02315 | 0 |
| 1.01974 | 0 |
| 1.01635 | 0 |
| 1.01297 | 0 |
| 1.0096 | 0 |
| 1.00624 | 0 |
| 1.00289 | 0 |
| 0.999553 | 0 |
| 0.996227 | 0 |
| 0.992912 | 0 |
| 0.989608 | 0 |
| 0.986315 | 0 |
| 0.983033 | 0 |
| 0.979762 | 0 |
| 0.976502 | 0 |
| 0.973253 | 0 |
| 0.970014 | 0 |
| 0.966787 | 0 |
| 0.96357 | 0 |
| 0.960364 | 0 |
| 0.957168 | 0 |
| 0.953983 | 0 |
| 0.950809 | 0 |
| 0.947645 | 0 |
| 0.944492 | 0 |
| 0.941349 | 0 |
| 0.938217 | 0 |
| 0.935095 | 0 |
| 0.931984 | 0 |
| 0.928883 | 0 |
| 0.925792 | 0 |
| 0.922711 | 0 |
| 0.919641 | 0 |
| 0.916581 | 0 |
| 0.913531 | 0 |
| 0.910492 | 0 |
| 0.907462 | 0 |
| 0.904442 | 0 |
| 0.901433 | 0 |
| 0.898434 | 0 |
| 0.895444 | 0 |
| 0.892465 | 0 |
| 0.889495 | 0 |
| 0.886535 | 0 |
| 0.883585 | 0 |
| 0.880645 | 0 |
| 0.877715 | 0 |
| 0.874794 | 0 |
| 0.871884 | 0 |
| 0.868983 | 0 |
| 0.866091 | 0 |
| 0.863209 | 0 |
| 0.860337 | 0 |
| 0.857474 | 0 |
| 0.854621 | 0 |
| 0.851777 | 0 |
| 0.848943 | 0 |
| 0.846118 | 0 |
| 0.843303 | 0 |
| 0.840497 | 0 |
| 0.8377 | 0 |
| 0.834913 | 0 |
| 0.832135 | 0 |
| 0.829366 | 0 |
| 0.826606 | 0 |
| 0.823856 | 0 |
| 0.821114 | 0 |
| 0.818382 | 0 |
| 0.815659 | 0 |
| 0.812945 | 0 |
| 0.81024 | 0 |
| 0.807544 | 0 |
| 0.804857 | 0 |
| 0.802179 | 0 |
| 0.79951 | 0 |
| 0.796849 | 0 |
| 0.794198 | 0 |
| 0.791555 | 0 |
| 0.788921 | 0 |
| 0.786296 | 0 |
| 0.78368 | 0 |
| 0.781072 | 0 |
| 0.778473 | 0 |
| 0.775883 | 0 |
| 0.773301 | 0 |
| 0.770728 | 0 |
| 0.768164 | 0 |
| 0.765608 | 0 |
| 0.76306 | 0 |
| 0.760521 | 0 |
| 0.757991 | 0 |
| 0.755469 | 0 |
| 0.752955 | 0 |
| 0.750449 | 0 |
| 0.747952 | 0 |
| 0.745464 | 0 |
| 0.742983 | 0 |
| 0.740511 | 0 |
| 0.738047 | 0 |
| 0.735591 | 0 |
| 0.733144 | 0 |
| 0.730704 | 0 |
| 0.728273 | 0 |
| 0.725849 | 0 |
| 0.723434 | 0 |
| 0.721027 | 0 |
| 0.718628 | 0 |
| 0.716237 | 0 |
| 0.713853 | 0 |
| 0.711478 | 0 |
| 0.709111 | 0 |
| 0.706751 | 0 |
| 0.7044 | 0 |
| 0.702056 | 0 |
| 0.69972 | 0 |
| 0.697391 | 0 |
| 0.695071 | 0 |
| 0.692758 | 0 |
| 0.690453 | 0 |
| 0.688156 | 0 |
| 0.685866 | 0 |
| 0.683584 | 0 |
| 0.681309 | 0 |
| 0.679042 | 0 |
| 0.676783 | 0 |
| 0.674531 | 0 |
| 0.672286 | 0 |
| 0.670049 | 0 |
| 0.66782 | 0 |
| 0.665598 | 0 |
| 0.663383 | 0 |
| 0.661176 | 0 |
| 0.658976 | 0 |
| 0.656783 | 0 |
| 0.654597 | 0 |
| 0.652419 | 0 |
| 0.650248 | 0 |
| 0.648085 | 0 |
| 0.645928 | 0 |
| 0.643779 | 0 |
| 0.641637 | 0 |
| 0.639502 | 0 |
| 0.637374 | 0 |
| 0.635253 | 0 |
| 0.633139 | 0 |
| 0.631033 | 0 |
| 0.628933 | 0 |
| 0.62684 | 0 |
| 0.624755 | 0 |
| 0.622676 | 0 |
| 0.620604 | 0 |
| 0.618539 | 0 |
| 0.616481 | 0 |
| 0.614429 | 0 |
| 0.612385 | 0 |
| 0.610347 | 0 |
| 0.608316 | 0 |
| 0.606292 | 0 |
| 0.604275 | 0 |
| 0.602264 | 0 |
| 0.60026 | 0 |
| 0.598263 | 0 |
| 0.596272 | 0 |
| 0.594288 | 0 |
| 0.592311 | 0 |
| 0.59034 | 0 |
| 0.588376 | 0 |
| 0.586418 | 0 |
| 0.584466 | 0 |
| 0.582522 | 0 |
| 0.580583 | 0 |
| 0.578652 | 0 |
| 0.576726 | 0 |
| 0.574807 | 0 |
| 0.572895 | 0 |
| 0.570988 | 0 |
| 0.569088 | 0 |
| 0.567195 | 0 |
| 0.565307 | 0 |
| 0.563426 | 0 |
| 0.561552 | 0 |
| 0.559683 | 0 |
| 0.557821 | 0 |
| 0.555965 | 0 |
| 0.554115 | 0 |
| 0.552271 | 0 |
| 0.550433 | 0 |
| 0.548602 | 0 |
| 0.546776 | 0 |
| 0.544957 | 0 |
| 0.543144 | 0 |
| 0.541336 | 0 |
| 0.539535 | 0 |
| 0.53774 | 0 |
| 0.535951 | 0 |
| 0.534167 | 0 |
| 0.53239 | 0 |
| 0.530618 | 0 |
| 0.528853 | 0 |
| 0.527093 | 0 |
| 0.525339 | 0 |
| 0.523591 | 0 |
| 0.521849 | 0 |
| 0.520113 | 0 |
| 0.518382 | 0 |
| 0.516657 | 0 |
| 0.514938 | 0 |
| 0.513225 | 0 |
| 0.511517 | 0 |
| 0.509815 | 0 |
| 0.508118 | 0 |
| 0.506428 | 0 |
| 0.504743 | 0 |
| 0.503063 | 0 |
| 0.501389 | 0 |
| 0.499721 | 0 |
| 0.498058 | 0 |
| 0.496401 | 0 |
| 0.494749 | 0 |
| 0.493103 | 0 |
| 0.491462 | 0 |
| 0.489827 | 0 |
| 0.488197 | 0 |
| 0.486573 | 0 |
| 0.484954 | 0 |
| 0.48334 | 0 |
| 0.481732 | 0 |
| 0.480129 | 0 |
| 0.478531 | 0 |
| 0.476939 | 0 |
| 0.475352 | 0 |
| 0.47377 | 0 |
| 0.472194 | 0 |
| 0.470623 | 0 |
| 0.469057 | 0 |
| 0.467496 | 0 |
| 0.46594 | 0 |
| 0.46439 | 0 |
| 0.462845 | 0 |
| 0.461305 | 0 |
| 0.45977 | 0 |
| 0.45824 | 0 |
| 0.456715 | 0 |
| 0.455195 | 0 |
| 0.453681 | 0 |
| 0.452171 | 0 |
| 0.450667 | 0 |
| 0.449167 | 0 |
| 0.447672 | 0 |
| 0.446183 | 0 |
| 0.444698 | 0 |
| 0.443218 | 0 |
| 0.441744 | 0 |
| 0.440274 | 0 |
| 0.438809 | 0 |
| 0.437349 | 0 |
| 0.435893 | 0 |
| 0.434443 | 0 |
| 0.432998 | 0 |
| 0.431557 | 0 |
| 0.430121 | 0 |
| 0.42869 | 0 |
| 0.427263 | 0 |
| 0.425841 | 0 |
| 0.424425 | 0 |
| 0.423012 | 0 |
| 0.421605 | 0 |
| 0.420202 | 0 |
| 0.418804 | 0 |
| 0.41741 | 0 |
| 0.416021 | 0 |
| 0.414637 | 0 |
| 0.413257 | 0 |
| 0.411882 | 0 |
| 0.410512 | 0 |
| 0.409146 | 0 |
| 0.407784 | 0 |
| 0.406427 | 0 |
| 0.405075 | 0 |
| 0.403727 | 0 |
| 0.402384 | 0 |
| 0.401045 | 0 |
| 0.399711 | 0 |
| 0.398381 | 0 |
| 0.397055 | 0 |
| 0.395734 | 0 |
| 0.394417 | 0 |
| 0.393105 | 0 |
| 0.391797 | 0 |
| 0.390493 | 0 |
| 0.389194 | 0 |
| 0.387899 | 0 |
| 0.386608 | 0 |
| 0.385321 | 0 |
| 0.384039 | 0 |
| 0.382762 | 0 |
| 0.381488 | 0 |
| 0.380219 | 0 |
| 0.378953 | 0 |
| 0.377692 | 0 |
| 0.376436 | 0 |
| 0.375183 | 0 |
| 0.373935 | 0 |
| 0.372691 | 0 |
| 0.37145 | 0 |
| 0.370214 | 0 |
| 0.368983 | 0 |
| 0.367755 | 0 |
| 0.366531 | 0 |
| 0.365312 | 0 |
| 0.364096 | 0 |
| 0.362885 | 0 |
| 0.361678 | 0 |
| 0.360474 | 0 |
| 0.359275 | 0 |
| 0.35808 | 0 |
| 0.356888 | 0 |
| 0.355701 | 0 |
| 0.354518 | 0 |
| 0.353338 | 0 |
| 0.352163 | 0 |
| 0.350991 | 0 |
| 0.349823 | 0 |
| 0.34866 | 0 |
| 0.3475 | 0 |
| 0.346344 | 0 |
| 0.345191 | 0 |
| 0.344043 | 0 |
| 0.342898 | 0 |
| 0.341758 | 0 |
| 0.340621 | 0 |
| 0.339487 | 0 |
| 0.338358 | 0 |
| 0.337232 | 0 |
| 0.33611 | 0 |
| 0.334992 | 0 |
| 0.333878 | 0 |
| 0.332767 | 0 |
| 0.33166 | 0 |
| 0.330556 | 0 |
| 0.329457 | 0 |
| 0.328361 | 0 |
| 0.327268 | 0 |
| 0.326179 | 0 |
| 0.325094 | 0 |
| 0.324013 | 0 |
| 0.322935 | 0 |
| 0.32186 | 0 |
| 0.320789 | 0 |
| 0.319722 | 0 |
| 0.318659 | 0 |
| 0.317598 | 0 |
| 0.316542 | 0 |
| 0.315489 | 0 |
| 0.314439 | 0 |
| 0.313393 | 0 |
| 0.31235 | 0 |
| 0.311311 | 0 |
| 0.310276 | 0 |
| 0.309243 | 0 |
| 0.308214 | 0 |
| 0.307189 | 0 |
| 0.306167 | 0 |
| 0.305148 | 0 |
| 0.304133 | 0 |
| 0.303122 | 0 |
| 0.302113 | 0 |
| 0.301108 | 0 |
| 0.300106 | 0 |
| 0.299108 | 0 |
| 0.298113 | 0 |
| 0.297121 | 0 |
| 0.296132 | 0 |
| 0.295147 | 0 |
| 0.294165 | 0 |
| 0.293187 | 0 |
| 0.292211 | 0 |
| 0.291239 | 0 |
| 0.29027 | 0 |
| 0.289304 | 0 |
| 0.288342 | 0 |
| 0.287383 | 0 |
| 0.286427 | 0 |
| 0.285474 | 0 |
| 0.284524 | 0 |
| 0.283577 | 0 |
| 0.282634 | 0 |
| 0.281694 | 0 |
| 0.280756 | 0 |
| 0.279822 | 0 |
| 0.278891 | 0 |
| 0.277964 | 0 |
| 0.277039 | 0 |
| 0.276117 | 0 |
| 0.275199 | 0 |
| 0.274283 | 0 |
| 0.273371 | 0 |
| 0.272461 | 0 |
| 0.271555 | 0 |
| 0.270651 | 0 |
| 0.269751 | 0 |
| 0.268853 | 0 |
| 0.267959 | 0 |
| 0.267067 | 0 |
| 0.266179 | 0 |
| 0.265293 | 0 |
| 0.264411 | 0 |
| 0.263531 | 0 |
| 0.262654 | 0 |
| 0.261781 | 0 |
| 0.26091 | 0 |
| 0.260042 | 0 |
| 0.259176 | 0 |
| 0.258314 | 0 |
| 0.257455 | 0 |
| 0.256598 | 0 |
| 0.255745 | 0 |
| 0.254894 | 0 |
| 0.254046 | 0 |
| 0.253201 | 0 |
| 0.252358 | 0 |
| 0.251519 | 0 |
| 0.250682 | 0 |
| 0.249848 | 0 |
| 0.249017 | 0 |
| 0.248188 | 0 |
| 0.247363 | 0 |
| 0.24654 | 0 |
| 0.245719 | 0 |
| 0.244902 | 0 |
| 0.244087 | 0 |
| 0.243275 | 0 |
| 0.242466 | 0 |
| 0.241659 | 0 |
| 0.240855 | 0 |
| 0.240054 | 0 |
| 0.239255 | 0 |
| 0.238459 | 0 |
| 0.237666 | 0 |
| 0.236875 | 0 |
| 0.236087 | 0 |
| 0.235302 | 0 |
| 0.234519 | 0 |
| 0.233739 | 0 |
| 0.232961 | 0 |
| 0.232186 | 0 |
| 0.231414 | 0 |
| 0.230644 | 0 |
| 0.229876 | 0 |
| 0.229112 | 0 |
| 0.228349 | 0 |
| 0.22759 | 0 |
| 0.226832 | 0 |
| 0.226078 | 0 |
| 0.225326 | 0 |
| 0.224576 | 0 |
| 0.223829 | 0 |
| 0.223084 | 0 |
| 0.222342 | 0 |
| 0.221602 | 0 |
| 0.220865 | 0 |
| 0.22013 | 0 |
| 0.219398 | 0 |
| 0.218668 | 0 |
| 0.217941 | 0 |
| 0.217215 | 0 |
| 0.216493 | 0 |
| 0.215773 | 0 |
| 0.215055 | 0 |
| 0.214339 | 0 |
| 0.213626 | 0 |
| 0.212915 | 0 |
| 0.212207 | 0 |
| 0.211501 | 0 |
| 0.210797 | 0 |
| 0.210096 | 0 |
| 0.209397 | 0 |
| 0.208701 | 0 |
| 0.208006 | 0 |
| 0.207314 | 0 |
| 0.206625 | 0 |
| 0.205937 | 0 |
| 0.205252 | 0 |
| 0.204569 | 0 |
| 0.203889 | 0 |
| 0.20321 | 0 |
| 0.202534 | 0 |
| 0.20186 | 0 |
| 0.201189 | 0 |
| 0.200519 | 0 |
| 0.199852 | 0 |
| 0.199187 | 0 |
| 0.198525 | 0 |
| 0.197864 | 0 |
| 0.197206 | 0 |
| 0.19655 | 0 |
| 0.195896 | 0 |
| 0.195244 | 0 |
| 0.194595 | 0 |
| 0.193947 | 0 |
| 0.193302 | 0 |
| 0.192659 | 0 |
| 0.192018 | 0 |
| 0.191379 | 0 |
| 0.190743 | 0 |
| 0.190108 | 0 |
| 0.189476 | 0 |
| 0.188845 | 0 |
| 0.188217 | 0 |
| 0.187591 | 0 |
| 0.186967 | 0 |
| 0.186345 | 0 |
| 0.185725 | 0 |
| 0.185107 | 0 |
| 0.184491 | 0 |
| 0.183877 | 0 |
| 0.183265 | 0 |
| 0.182656 | 0 |
| 0.182048 | 0 |
| 0.181442 | 0 |
| 0.180839 | 0 |
| 0.180237 | 0 |
| 0.179637 | 0 |
| 0.17904 | 0 |
| 0.178444 | 0 |
| 0.177851 | 0 |
| 0.177259 | 0 |
| 0.176669 | 0 |
| 0.176081 | 0 |
| 0.175496 | 0 |
| 0.174912 | 0 |
| 0.17433 | 0 |
| 0.17375 | 0 |
| 0.173172 | 0 |
| 0.172596 | 0 |
| 0.172021 | 0 |
| 0.171449 | 0 |
| 0.170879 | 0 |
| 0.17031 | 0 |
| 0.169744 | 0 |
| 0.169179 | 0 |
| 0.168616 | 0 |
| 0.168055 | 0 |
| 0.167496 | 0 |
| 0.166939 | 0 |
| 0.166383 | 0 |
| 0.16583 | 0 |
| 0.165278 | 0 |
| 0.164728 | 0 |
| 0.16418 | 0 |
| 0.163634 | 0 |
| 0.16309 | 0 |
| 0.162547 | 0 |
| 0.162006 | 0 |
| 0.161467 | 0 |
| 0.16093 | 0 |
| 0.160395 | 0 |
| 0.159861 | 0 |
| 0.159329 | 0 |
| 0.158799 | 0 |
| 0.158271 | 0 |
| 0.157744 | 0 |
| 0.15722 | 0 |
| 0.156697 | 0 |
| 0.156175 | 0 |
| 0.155656 | 0 |
| 0.155138 | 0 |
| 0.154622 | 0 |
| 0.154107 | 0 |
| 0.153595 | 0 |
| 0.153084 | 0 |
| 0.152574 | 0 |
| 0.152067 | 0 |
| 0.151561 | 0 |
| 0.151057 | 0 |
| 0.150554 | 0 |
| 0.150053 | 0 |
| 0.149554 | 0 |
| 0.149056 | 0 |
| 0.14856 | 0 |
| 0.148066 | 0 |
| 0.147574 | 0 |
| 0.147083 | 0 |
| 0.146593 | 0 |
| 0.146106 | 0 |
| 0.14562 | 0 |
| 0.145135 | 0 |
| 0.144652 | 0 |
| 0.144171 | 0 |
| 0.143691 | 0 |
| 0.143213 | 0 |
| 0.142737 | 0 |
| 0.142262 | 0 |
| 0.141789 | 0 |
| 0.141317 | 0 |
| 0.140847 | 0 |
| 0.140378 | 0 |
| 0.139911 | 0 |
| 0.139446 | 0 |
| 0.138982 | 0 |
| 0.138519 | 0 |
| 0.138059 | 0 |
| 0.137599 | 0 |
| 0.137142 | 0 |
| 0.136685 | 0 |
| 0.136231 | 0 |
| 0.135777 | 0 |
| 0.135326 | 0 |
| 0.134875 | 0 |
| 0.134427 | 0 |
| 0.133979 | 0 |
| 0.133534 | 0 |
| 0.133089 | 0 |
| 0.132647 | 0 |
| 0.132205 | 0 |
| 0.131766 | 0 |
| 0.131327 | 0 |
| 0.13089 | 0 |
| 0.130455 | 0 |
| 0.130021 | 0 |
| 0.129588 | 0 |
| 0.129157 | 0 |
| 0.128727 | 0 |
| 0.128299 | 0 |
| 0.127872 | 0 |
| 0.127447 | 0 |
| 0.127023 | 0 |
| 0.1266 | 0 |
| 0.126179 | 0 |
| 0.125759 | 0 |
| 0.125341 | 0 |
| 0.124924 | 0 |
| 0.124508 | 0 |
| 0.124094 | 0 |
| 0.123681 | 0 |
| 0.12327 | 0 |
| 0.12286 | 0 |
| 0.122451 | 0 |
| 0.122044 | 0 |
| 0.121638 | 0 |
| 0.121233 | 0 |
| 0.12083 | 0 |
| 0.120428 | 0 |
| 0.120027 | 0 |
| 0.119628 | 0 |
| 0.11923 | 0 |
| 0.118833 | 0 |
| 0.118438 | 0 |
| 0.118044 | 0 |
| 0.117651 | 0 |
| 0.117259 | 0 |
| 0.116869 | 0 |
| 0.11648 | 0 |
| 0.116093 | 0 |
| 0.115707 | 0 |
| 0.115322 | 0 |
| 0.114938 | 0 |
| 0.114556 | 0 |
| 0.114175 | 0 |
| 0.113795 | 0 |
| 0.113416 | 0 |
| 0.113039 | 0 |
| 0.112663 | 0 |
| 0.112288 | 0 |
| 0.111914 | 0 |
| 0.111542 | 0 |
| 0.111171 | 0 |
| 0.110801 | 0 |
| 0.110433 | 0 |
| 0.110065 | 0 |
| 0.109699 | 0 |
| 0.109334 | 0 |
| 0.10897 | 0 |
| 0.108608 | 0 |
| 0.108246 | 0 |
| 0.107886 | 0 |
| 0.107527 | 0 |
| 0.10717 | 0 |
| 0.106813 | 0 |
| 0.106458 | 0 |
| 0.106104 | 0 |
| 0.105751 | 0 |
| 0.105399 | 0 |
| 0.105048 | 0 |
| 0.104699 | 0 |
| 0.10435 | 0 |
| 0.104003 | 0 |
| 0.103657 | 0 |
| 0.103312 | 0 |
| 0.102969 | 0 |
| 0.102626 | 0 |
| 0.102285 | 0 |
| 0.101944 | 0 |
| 0.101605 | 0 |
| 0.101267 | 0 |
| 0.10093 | 0 |
| 0.100594 | 0 |
| 0.10026 | 0 |
| 0.0999262 | 0 |
| 0.0995937 | 0 |
| 0.0992624 | 0 |
| 0.0989322 | 0 |
| 0.098603 | 0 |
| 0.098275 | 0 |
| 0.097948 | 0 |
| 0.0976222 | 0 |
| 0.0972974 | 0 |
| 0.0969737 | 0 |
| 0.0966511 | 0 |
| 0.0963295 | 0 |
| 0.096009 | 0 |
| 0.0956896 | 0 |
| 0.0953713 | 0 |
| 0.095054 | 0 |
| 0.0947378 | 0 |
| 0.0944226 | 0 |
| 0.0941084 | 0 |
| 0.0937954 | 0 |
| 0.0934833 | 0 |
| 0.0931723 | 0 |
| 0.0928623 | 0 |
| 0.0925534 | 0 |
| 0.0922455 | 0 |
| 0.0919386 | 0 |
| 0.0916327 | 0 |
| 0.0913279 | 0 |
| 0.0911592 | 0 |
| 0.0909909 | 0 |
| 0.0906888 | 0 |
| 0.0903877 | 0 |
| 0.0900877 | 0 |
| 0.0897886 | 0 |
| 0.0894905 | 0 |
| 0.0891934 | 0 |
| 0.0888973 | 0 |
| 0.0886022 | 0 |
| 0.088308 | 0 |
| 0.0880148 | 0 |
| 0.0877227 | 0 |
| 0.0874314 | 0 |
| 0.0871412 | 0 |
| 0.0868519 | 0 |
| 0.0865635 | 0 |
| 0.0862762 | 0 |
| 0.0859897 | 0 |
| 0.0857043 | 0 |
| 0.0854197 | 0 |
| 0.0851362 | 0 |
| 0.0848535 | 0 |
| 0.0845718 | 0 |
| 0.084291 | 0 |
| 0.0840112 | 0 |
| 0.0837323 | 0 |
| 0.0834543 | 0 |
| 0.0831773 | 0 |
| 0.0829011 | 0 |
| 0.0826259 | 0 |
| 0.0823516 | 0 |
| 0.0820782 | 0 |
| 0.0818057 | 0 |
| 0.0815341 | 0 |
| 0.0812635 | 0 |
| 0.0809937 | 0 |
| 0.0807248 | 0 |
| 0.0804568 | 0 |
| 0.0801897 | 0 |
| 0.0799235 | 0 |
| 0.0796581 | 0 |
| 0.0793937 | 0 |
| 0.0791301 | 0 |
| 0.0788674 | 0 |
| 0.0786056 | 0 |
| 0.0783446 | 0 |
| 0.0780845 | 0 |
| 0.0778253 | 0 |
| 0.0775669 | 0 |
| 0.0773094 | 0 |
| 0.0770528 | 0 |
| 0.076797 | 0 |
| 0.076542 | 0 |
| 0.0762879 | 0 |
| 0.0760346 | 0 |
| 0.0757822 | 0 |
| 0.0755306 | 0 |
| 0.0752799 | 0 |
| 0.0750299 | 0 |
| 0.0747809 | 0 |
| 0.0745326 | 0 |
| 0.0742852 | 0 |
| 0.0740385 | 0 |
| 0.0737927 | 0 |
| 0.0735478 | 0 |
| 0.0733036 | 0 |
| 0.0730602 | 0 |
| 0.0728177 | 0 |
| 0.0725759 | 0 |
| 0.072335 | 0 |
| 0.0720949 | 0 |
| 0.0718555 | 0 |
| 0.071617 | 0 |
| 0.0713792 | 0 |
| 0.0711422 | 0 |
| 0.0709061 | 0 |
| 0.0706707 | 0 |
| 0.070436 | 0 |
| 0.0702022 | 0 |
| 0.0699692 | 0 |
| 0.0697369 | 0 |
| 0.0695053 | 0 |
| 0.0692746 | 0 |
| 0.0690446 | 0 |
| 0.0688154 | 0 |
| 0.0685869 | 0 |
| 0.0683592 | 0 |
| 0.0681323 | 0 |
| 0.0679061 | 0 |
| 0.0676807 | 0 |
| 0.067456 | 0 |
| 0.067232 | 0 |
| 0.0670088 | 0 |
| 0.0667864 | 0 |
| 0.0665647 | 0 |
| 0.0663437 | 0 |
| 0.0661234 | 0 |
| 0.0659039 | 0 |
| 0.0656851 | 0 |
| 0.065467 | 0 |
| 0.0652497 | 0 |
| 0.0650331 | 0 |
| 0.0648172 | 0 |
| 0.064602 | 0 |
| 0.0643875 | 0 |
| 0.0641738 | 0 |
| 0.0639607 | 0 |
| 0.0637484 | 0 |
| 0.0635367 | 0 |
| 0.0633258 | 0 |
| 0.0631156 | 0 |
| 0.062906 | 0 |
| 0.0626972 | 0 |
| 0.0624891 | 0 |
| 0.0622816 | 0 |
| 0.0620748 | 0 |
| 0.0618688 | 0 |
| 0.0616634 | 0 |
| 0.0614587 | 0 |
| 0.0612546 | 0 |
| 0.0610513 | 0 |
| 0.0608486 | 0 |
| 0.0606466 | 0 |
| 0.0604452 | 0 |
| 0.0602446 | 0 |
| 0.0600446 | 0 |
| 0.0598452 | 0 |
| 0.0596465 | 0 |
| 0.0594485 | 0 |
| 0.0592512 | 0 |
| 0.0590545 | 0 |
| 0.0588584 | 0 |
| 0.058663 | 0 |
| 0.0584683 | 0 |
| 0.0582741 | 0 |
| 0.0580807 | 0 |
| 0.0578879 | 0 |
| 0.0576957 | 0 |
| 0.0575041 | 0 |
| 0.0573132 | 0 |
| 0.057123 | 0 |
| 0.0569333 | 0 |
| 0.0567443 | 0 |
| 0.0565559 | 0 |
| 0.0563682 | 0 |
| 0.056181 | 0 |
| 0.0559945 | 0 |
| 0.0558086 | 0 |
| 0.0556234 | 0 |
| 0.0554387 | 0 |
| 0.0552547 | 0 |
| 0.0550712 | 0 |
| 0.0548884 | 0 |
| 0.0547062 | 0 |
| 0.0545245 | 0 |
| 0.0543435 | 0 |
| 0.0541631 | 0 |
| 0.0539833 | 0 |
| 0.0538041 | 0 |
| 0.0536255 | 0 |
| 0.0534474 | 0 |
| 0.05327 | 0 |
| 0.0530932 | 0 |
| 0.0529169 | 0 |
| 0.0527412 | 0 |
| 0.0525661 | 0 |
| 0.0523916 | 0 |
| 0.0522177 | 0 |
| 0.0520443 | 0 |
| 0.0518715 | 0 |
| 0.0516993 | 0 |
| 0.0515277 | 0 |
| 0.0513566 | 0 |
| 0.0511861 | 0 |
| 0.0510162 | 0 |
| 0.0508468 | 0 |
| 0.050678 | 0 |
| 0.0505098 | 0 |
| 0.0503421 | 0 |
| 0.0501749 | 0 |
| 0.0500083 | 0 |
| 0.0498422 | 0 |
| 0.0496767 | 0 |
| 0.0495117 | 0 |
| 0.0493473 | 0 |
| 0.0491834 | 0 |
| 0.0490201 | 0 |
| 0.0488573 | 0 |
| 0.048695 | 0 |
| 0.0485333 | 0 |
| 0.0483721 | 0 |
| 0.0482115 | 0 |
| 0.0480514 | 0 |
| 0.0478918 | 0 |
| 0.0477328 | 0 |
| 0.0475742 | 0 |
| 0.0474163 | 0 |
| 0.0472588 | 0 |
| 0.0471018 | 0 |
| 0.0469454 | 0 |
| 0.0467895 | 0 |
| 0.0466341 | 0 |
| 0.0464793 | 0 |
| 0.0463249 | 0 |
| 0.0461711 | 0 |
| 0.0460177 | 0 |
| 0.0458649 | 0 |
| 0.0457126 | 0 |
| 0.0455608 | 0 |
| 0.0454095 | 0 |
| 0.0452587 | 0 |
| 0.0451084 | 0 |
| 0.0449586 | 0 |
| 0.0448093 | 0 |
| 0.0446605 | 0 |
| 0.0445122 | 0 |
| 0.0443643 | 0 |
| 0.044217 | 0 |
| 0.0440702 | 0 |
| 0.0439238 | 0 |
| 0.0437779 | 0 |
| 0.0436326 | 0 |
| 0.0434877 | 0 |
| 0.0433432 | 0 |
| 0.0431993 | 0 |
| 0.0430558 | 0 |
| 0.0429128 | 0 |
| 0.0427703 | 0 |
| 0.0426283 | 0 |
| 0.0424867 | 0 |
| 0.0423456 | 0 |
| 0.042205 | 0 |
| 0.0420649 | 0 |
| 0.0419252 | 0 |
| 0.0417859 | 0 |
| 0.0416472 | 0 |
| 0.0415089 | 0 |
| 0.041371 | 0 |
| 0.0412336 | 0 |
| 0.0410967 | 0 |
| 0.0409602 | 0 |
| 0.0408242 | 0 |
| 0.0406886 | 0 |
| 0.0405535 | 0 |
| 0.0404188 | 0 |
| 0.0402846 | 0 |
| 0.0401508 | 0 |
| 0.0400174 | 0 |
| 0.0398846 | 0 |
| 0.0397521 | 0 |
| 0.0396201 | 0 |
| 0.0394885 | 0 |
| 0.0393574 | 0 |
| 0.0392267 | 0 |
| 0.0390964 | 0 |
| 0.0389666 | 0 |
| 0.0388372 | 0 |
| 0.0387082 | 0 |
| 0.0385796 | 0 |
| 0.0384515 | 0 |
| 0.0383238 | 0 |
| 0.0381966 | 0 |
| 0.0380697 | 0 |
| 0.0379433 | 0 |
| 0.0378173 | 0 |
| 0.0376917 | 0 |
| 0.0375665 | 0 |
| 0.0374418 | 0 |
| 0.0373174 | 0 |
| 0.0371935 | 0 |
| 0.03707 | 0 |
| 0.0369469 | 0 |
| 0.0368242 | 0 |
| 0.0367019 | 0 |
| 0.03658 | 0 |
| 0.0364585 | 0 |
| 0.0363374 | 0 |
| 0.0362168 | 0 |
| 0.0360965 | 0 |
| 0.0359766 | 0 |
| 0.0358571 | 0 |
| 0.0357381 | 0 |
| 0.0356194 | 0 |
| 0.0355011 | 0 |
| 0.0353832 | 0 |
| 0.0352657 | 0 |
| 0.0351486 | 0 |
| 0.0350318 | 0 |
| 0.0349155 | 0 |
| 0.0347995 | 0 |
| 0.034684 | 0 |
| 0.0345688 | 0 |
| 0.034454 | 0 |
| 0.0343396 | 0 |
| 0.0342255 | 0 |
| 0.0341119 | 0 |
| 0.0339986 | 0 |
| 0.0338857 | 0 |
| 0.0337732 | 0 |
| 0.033661 | 0 |
| 0.0335492 | 0 |
| 0.0334378 | 0 |
| 0.0333268 | 0 |
| 0.0332161 | 0 |
| 0.0331058 | 0 |
| 0.0329958 | 0 |
| 0.0328862 | 0 |
| 0.032777 | 0 |
| 0.0326682 | 0 |
| 0.0325597 | 0 |
| 0.0324516 | 0 |
| 0.0323438 | 0 |
| 0.0322364 | 0 |
| 0.0321293 | 0 |
| 0.0320226 | 0 |
| 0.0319163 | 0 |
| 0.0318103 | 0 |
| 0.0317047 | 0 |
| 0.0315994 | 0 |
| 0.0314944 | 0 |
| 0.0313898 | 0 |
| 0.0312856 | 0 |
| 0.0311817 | 0 |
| 0.0310781 | 0 |
| 0.0309749 | 0 |
| 0.0308721 | 0 |
| 0.0307695 | 0 |
| 0.0306674 | 0 |
| 0.0305655 | 0 |
| 0.030464 | 0 |
| 0.0303628 | 0 |
| 0.030262 | 0 |
| 0.0301615 | 0 |
| 0.0300613 | 0 |
| 0.0299615 | 0 |
| 0.029862 | 0 |
| 0.0297628 | 0 |
| 0.029664 | 0 |
| 0.0295655 | 0 |
| 0.0294673 | 0 |
| 0.0293694 | 0 |
| 0.0292719 | 0 |
| 0.0291747 | 0 |
| 0.0290778 | 0 |
| 0.0289813 | 0 |
| 0.028885 | 0 |
| 0.0287891 | 0 |
| 0.0286935 | 0 |
| 0.0285982 | 0 |
| 0.0285032 | 0 |
| 0.0284086 | 0 |
| 0.0283142 | 0 |
| 0.0282202 | 0 |
| 0.0281265 | 0 |
| 0.0280331 | 0 |
| 0.02794 | 0 |
| 0.0278472 | 0 |
| 0.0277547 | 0 |
| 0.0276625 | 0 |
| 0.0275707 | 0 |
| 0.0274791 | 0 |
| 0.0273878 | 0 |
| 0.0272969 | 0 |
| 0.0272062 | 0 |
| 0.0271159 | 0 |
| 0.0270258 | 0 |
| 0.0269361 | 0 |
| 0.0268466 | 0 |
| 0.0267575 | 0 |
| 0.0266686 | 0 |
| 0.0265801 | 0 |
| 0.0264918 | 0 |
| 0.0264038 | 0 |
| 0.0263161 | 0 |
| 0.0262287 | 0 |
| 0.0261416 | 0 |
| 0.0260548 | 0 |
| 0.0259683 | 0 |
| 0.025882 | 0 |
| 0.0257961 | 0 |
| 0.0257104 | 0 |
| 0.025625 | 0 |
| 0.0255399 | 0 |
| 0.0254551 | 0 |
| 0.0253706 | 0 |
| 0.0252863 | 0 |
| 0.0252024 | 0 |
| 0.0251187 | 0 |
| 0.0250352 | 0 |
| 0.0249527 | 0 |
| 0.024871 | 0 |
| 0.0247896 | 0 |
| 0.0247085 | 0 |
| 0.0246276 | 0 |
| 0.024547 | 0 |
| 0.0244666 | 0 |
| 0.0243865 | 0 |
| 0.0243067 | 0 |
| 0.0242271 | 0 |
| 0.0241478 | 0 |
| 0.0240688 | 0 |
| 0.02399 | 0 |
| 0.0239114 | 0 |
| 0.0238332 | 0 |
| 0.0237552 | 0 |
| 0.0236774 | 0 |
| 0.0236024 | 0 |
| 0.0235303 | 0 |
| 0.0234583 | 0 |
| 0.0233866 | 0 |
| 0.023315 | 0 |
| 0.0232437 | 0 |
| 0.0231727 | 0 |
| 0.0231018 | 0 |
| 0.0230311 | 0 |
| 0.0229607 | 0 |
| 0.0228905 | 0 |
| 0.0228205 | 0 |
| 0.0227476 | 0 |
| 0.0226719 | 0 |
| 0.0225965 | 0 |
| 0.0225213 | 0 |
| 0.0224464 | 0 |
| 0.0223717 | 0 |
| 0.0222972 | 0 |
| 0.022223 | 0 |
| 0.0221491 | 0 |
| 0.0220754 | 0 |
| 0.0220019 | 0 |
| 0.0219287 | 0 |
| 0.0218558 | 0 |
| 0.021783 | 0 |
| 0.0217105 | 0 |
| 0.0216383 | 0 |
| 0.0215663 | 0 |
| 0.0214945 | 0 |
| 0.021423 | 0 |
| 0.0213517 | 0 |
| 0.0212807 | 0 |
| 0.0212099 | 0 |
| 0.0211393 | 0 |
| 0.0210689 | 0 |
| 0.0209988 | 0 |
| 0.020929 | 0 |
| 0.0208593 | 0 |
| 0.0207899 | 0 |
| 0.0207207 | 0 |
| 0.0206518 | 0 |
| 0.0205831 | 0 |
| 0.0205146 | 0 |
| 0.0204463 | 0 |
| 0.0203783 | 0 |
| 0.0203105 | 0 |
| 0.0202429 | 0 |
| 0.0201755 | 0 |
| 0.0201084 | 0 |
| 0.0200415 | 0 |
| 0.0199748 | 0 |
| 0.0199083 | 0 |
| 0.0198421 | 0 |
| 0.019776 | 0 |
| 0.0197102 | 0 |
| 0.0196447 | 0 |
| 0.0195793 | 0 |
| 0.0195141 | 0 |
| 0.0194492 | 0 |
| 0.0193845 | 0 |
| 0.01932 | 0 |
| 0.0192557 | 0 |
| 0.0191916 | 0 |
| 0.0191278 | 0 |
| 0.0190641 | 0 |
| 0.0190007 | 0 |
| 0.0189374 | 0 |
| 0.0188744 | 0 |
| 0.0188116 | 0 |
| 0.018749 | 0 |
| 0.0186866 | 0 |
| 0.0186245 | 0 |
| 0.0185625 | 0 |
| 0.0185007 | 0 |
| 0.0184392 | 0 |
| 0.0183778 | 0 |
| 0.0183166 | 0 |
| 0.0182557 | 0 |
| 0.0181949 | 0 |
| 0.0181344 | 0 |
| 0.0180741 | 0 |
| 0.0180139 | 0 |
| 0.017954 | 0 |
| 0.0178942 | 0 |
| 0.0178347 | 0 |
| 0.0177753 | 0 |
| 0.0177162 | 0 |
| 0.0176572 | 0 |
| 0.0175985 | 0 |
| 0.0175399 | 0 |
| 0.0174816 | 0 |
| 0.0174234 | 0 |
| 0.0173654 | 0 |
| 0.0173076 | 0 |
| 0.01725 | 0 |
| 0.0171926 | 0 |
| 0.0171354 | 0 |
| 0.0170784 | 0 |
| 0.0170216 | 0 |
| 0.0169649 | 0 |
| 0.0169085 | 0 |
| 0.0168522 | 0 |
| 0.0167962 | 0 |
| 0.0167403 | 0 |
| 0.0166846 | 0 |
| 0.016629 | 0 |
| 0.0165737 | 0 |
| 0.0165186 | 0 |
| 0.0164636 | 0 |
| 0.0164088 | 0 |
| 0.0163542 | 0 |
| 0.0162998 | 0 |
| 0.0162455 | 0 |
| 0.0161915 | 0 |
| 0.0161376 | 0 |
| 0.0160839 | 0 |
| 0.0160304 | 0 |
| 0.0159771 | 0 |
| 0.0159239 | 0 |
| 0.0158709 | 0 |
| 0.0158181 | 0 |
| 0.0157655 | 0 |
| 0.015713 | 0 |
| 0.0156607 | 0 |
| 0.0156086 | 0 |
| 0.0155567 | 0 |
| 0.0155049 | 0 |
| 0.0154533 | 0 |
| 0.0154019 | 0 |
| 0.0153506 | 0 |
| 0.0152995 | 0 |
| 0.0152486 | 0 |
| 0.0151979 | 0 |
| 0.0151473 | 0 |
| 0.0150969 | 0 |
| 0.0150467 | 0 |
| 0.0149966 | 0 |
| 0.0149467 | 0 |
| 0.014897 | 0 |
| 0.0148474 | 0 |
| 0.014798 | 0 |
| 0.0147488 | 0 |
| 0.0146997 | 0 |
| 0.0146508 | 0 |
| 0.014602 | 0 |
| 0.0145534 | 0 |
| 0.014505 | 0 |
| 0.0144567 | 0 |
| 0.0144086 | 0 |
| 0.0143607 | 0 |
| 0.0143129 | 0 |
| 0.0142653 | 0 |
| 0.0142178 | 0 |
| 0.0141705 | 0 |
| 0.0141233 | 0 |
| 0.0140763 | 0 |
| 0.0140295 | 0 |
| 0.0139828 | 0 |
| 0.0139363 | 0 |
| 0.0138899 | 0 |
| 0.0138437 | 0 |
| 0.0137976 | 0 |
| 0.0137517 | 0 |
| 0.013706 | 0 |
| 0.0136604 | 0 |
| 0.0136149 | 0 |
| 0.0135696 | 0 |
| 0.0135244 | 0 |
| 0.0134794 | 0 |
| 0.0134346 | 0 |
| 0.0133899 | 0 |
| 0.0133453 | 0 |
| 0.0133009 | 0 |
| 0.0132567 | 0 |
| 0.0132126 | 0 |
| 0.0131686 | 0 |
| 0.0131248 | 0 |
| 0.0130811 | 0 |
| 0.0130376 | 0 |
| 0.0129942 | 0 |
| 0.0129509 | 0 |
| 0.0129078 | 0 |
| 0.0128649 | 0 |
| 0.0128221 | 0 |
| 0.0127794 | 0 |
| 0.0127369 | 0 |
| 0.0126945 | 0 |
| 0.0126523 | 0 |
| 0.0126102 | 0 |
| 0.0125682 | 0 |
| 0.0125264 | 0 |
| 0.0124847 | 0 |
| 0.0124432 | 0 |
| 0.0124018 | 0 |
| 0.0123605 | 0 |
| 0.0123194 | 0 |
| 0.0122784 | 0 |
| 0.0122375 | 0 |
| 0.0121968 | 0 |
| 0.0121562 | 0 |
| 0.0121158 | 0 |
| 0.0120754 | 0 |
| 0.0120353 | 0 |
| 0.0119952 | 0 |
| 0.0119553 | 0 |
| 0.0119155 | 0 |
| 0.0118759 | 0 |
| 0.0118363 | 0 |
| 0.011797 | 0 |
| 0.0117577 | 0 |
| 0.0117186 | 0 |
| 0.0116796 | 0 |
| 0.0116407 | 0 |
| 0.011602 | 0 |
| 0.0115634 | 0 |
| 0.0115249 | 0 |
| 0.0114866 | 0 |
| 0.0114483 | 0 |
| 0.0114102 | 0 |
| 0.0113723 | 0 |
| 0.0113344 | 0 |
| 0.0112967 | 0 |
| 0.0112591 | 0 |
| 0.0112217 | 0 |
| 0.0111843 | 0 |
| 0.0111471 | 0 |
| 0.01111 | 0 |
| 0.011073 | 0 |
| 0.0110362 | 0 |
| 0.0109995 | 0 |
| 0.0109629 | 0 |
| 0.0109264 | 0 |
| 0.01089 | 0 |
| 0.0108538 | 0 |
| 0.0108177 | 0 |
| 0.0107817 | 0 |
| 0.0107458 | 0 |
| 0.01071 | 0 |
| 0.0106744 | 0 |
| 0.0106389 | 0 |
| 0.0106035 | 0 |
| 0.0105682 | 0 |
| 0.010533 | 0 |
| 0.010498 | 0 |
| 0.0104631 | 0 |
| 0.0104282 | 0 |
| 0.0103935 | 0 |
| 0.010359 | 0 |
| 0.0103245 | 0 |
| 0.0102901 | 0 |
| 0.0102559 | 0 |
| 0.0102218 | 0 |
| 0.0101878 | 0 |
| 0.0101539 | 0 |
| 0.0101201 | 0 |
| 0.0100864 | 0 |
| 0.0100528 | 0 |
| 0.0100194 | 0 |
| 0.00998604 | 0 |
| 0.00995281 | 0 |
| 0.00991969 | 0 |
| 0.00988668 | 0 |
| 0.00985378 | 0 |
| 0.00982099 | 0 |
| 0.00978831 | 0 |
| 0.00975574 | 0 |
| 0.00972328 | 0 |
| 0.00969092 | 0 |
| 0.00965868 | 0 |
| 0.00962654 | 0 |
| 0.0095945 | 0 |
| 0.00956258 | 0 |
| 0.00953076 | 0 |
| 0.00949904 | 0 |
| 0.00946744 | 0 |
| 0.00943593 | 0 |
| 0.00940453 | 0 |
| 0.00937324 | 0 |
| 0.00934205 | 0 |
| 0.00931097 | 0 |
| 0.00927998 | 0 |
| 0.0092491 | 0 |
| 0.00921833 | 0 |
| 0.00918765 | 0 |
| 0.00915708 | 0 |
| 0.00912661 | 0 |
| 0.00909624 | 0 |
| 0.00906597 | 0 |
| 0.0090358 | 0 |
| 0.00900574 | 0 |
| 0.00897577 | 0 |
| 0.0089459 | 0 |
| 0.00891614 | 0 |
| 0.00888647 | 0 |
| 0.0088569 | 0 |
| 0.00882742 | 0 |
| 0.00879805 | 0 |
| 0.00876877 | 0 |
| 0.0087396 | 0 |
| 0.00871051 | 0 |
| 0.00868153 | 0 |
| 0.00865264 | 0 |
| 0.00862385 | 0 |
| 0.00859515 | 0 |
| 0.00856655 | 0 |
| 0.00853805 | 0 |
| 0.00850964 | 0 |
| 0.00848132 | 0 |
| 0.0084531 | 0 |
| 0.00842497 | 0 |
| 0.00839694 | 0 |
| 0.00836899 | 0 |
| 0.00834115 | 0 |
| 0.00831339 | 0 |
| 0.00828573 | 0 |
| 0.00825816 | 0 |
| 0.00823068 | 0 |
| 0.00820329 | 0 |
| 0.00817599 | 0 |
| 0.00814879 | 0 |
| 0.00812167 | 0 |
| 0.00809465 | 0 |
| 0.00806771 | 0 |
| 0.00804087 | 0 |
| 0.00801411 | 0 |
| 0.00798744 | 0 |
| 0.00796086 | 0 |
| 0.00793437 | 0 |
| 0.00790797 | 0 |
| 0.00788166 | 0 |
| 0.00785543 | 0 |
| 0.00782929 | 0 |
| 0.00780324 | 0 |
| 0.00777727 | 0 |
| 0.00775139 | 0 |
| 0.0077256 | 0 |
| 0.00769989 | 0 |
| 0.00767427 | 0 |
| 0.00764874 | 0 |
| 0.00762328 | 0 |
| 0.00759792 | 0 |
| 0.00757263 | 0 |
| 0.00754744 | 0 |
| 0.00752232 | 0 |
| 0.00749729 | 0 |
| 0.00747234 | 0 |
| 0.00744748 | 0 |
| 0.0074227 | 0 |
| 0.007398 | 0 |
| 0.00737338 | 0 |
| 0.00734885 | 0 |
| 0.00732439 | 0 |
| 0.00730002 | 0 |
| 0.00727573 | 0 |
| 0.00725152 | 0 |
| 0.00722739 | 0 |
| 0.00720334 | 0 |
| 0.00717937 | 0 |
| 0.00715548 | 0 |
| 0.00713167 | 0 |
| 0.00710794 | 0 |
| 0.00708429 | 0 |
| 0.00706071 | 0 |
| 0.00703722 | 0 |
| 0.0070138 | 0 |
| 0.00699046 | 0 |
| 0.0069672 | 0 |
| 0.00694402 | 0 |
| 0.00692091 | 0 |
| 0.00689788 | 0 |
| 0.00687493 | 0 |
| 0.00685205 | 0 |
| 0.00682925 | 0 |
| 0.00680653 | 0 |
| 0.00678388 | 0 |
| 0.00676131 | 0 |
| 0.00673881 | 0 |
| 0.00671638 | 0 |
| 0.00669403 | 0 |
| 0.00667176 | 0 |
| 0.00664956 | 0 |
| 0.00662743 | 0 |
| 0.00660538 | 0 |
| 0.0065834 | 0 |
| 0.00656149 | 0 |
| 0.00653966 | 0 |
| 0.0065179 | 0 |
| 0.00649621 | 0 |
| 0.00647459 | 0 |
| 0.00645305 | 0 |
| 0.00643158 | 0 |
| 0.00641017 | 0 |
| 0.00638884 | 0 |
| 0.00636759 | 0 |
| 0.0063464 | 0 |
| 0.00632528 | 0 |
| 0.00630423 | 0 |
| 0.00628325 | 0 |
| 0.00626235 | 0 |
| 0.00624151 | 0 |
| 0.00622074 | 0 |
| 0.00620004 | 0 |
| 0.00617941 | 0 |
| 0.00615885 | 0 |
| 0.00613835 | 0 |
| 0.00611793 | 0 |
| 0.00609757 | 0 |
| 0.00607728 | 0 |
| 0.00605706 | 0 |
| 0.0060369 | 0 |
| 0.00601681 | 0 |
| 0.00599679 | 0 |
| 0.00597684 | 0 |
| 0.00595695 | 0 |
| 0.00593713 | 0 |
| 0.00591737 | 0 |
| 0.00589768 | 0 |
| 0.00587806 | 0 |
| 0.0058585 | 0 |
| 0.005839 | 0 |
| 0.00581957 | 0 |
| 0.00580021 | 0 |
| 0.00578091 | 0 |
| 0.00576167 | 0 |
| 0.0057425 | 0 |
| 0.00572339 | 0 |
| 0.00570435 | 0 |
| 0.00568536 | 0 |
| 0.00566645 | 0 |
| 0.00564759 | 0 |
| 0.0056288 | 0 |
| 0.00561007 | 0 |
| 0.0055914 | 0 |
| 0.0055728 | 0 |
| 0.00555425 | 0 |
| 0.00553577 | 0 |
| 0.00551735 | 0 |
| 0.00549899 | 0 |
| 0.00548069 | 0 |
| 0.00546245 | 0 |
| 0.00544428 | 0 |
| 0.00542616 | 0 |
| 0.00540811 | 0 |
| 0.00539011 | 0 |
| 0.00537217 | 0 |
| 0.0053543 | 0 |
| 0.00533648 | 0 |
| 0.00531872 | 0 |
| 0.00530103 | 0 |
| 0.00528339 | 0 |
| 0.00526581 | 0 |
| 0.00524828 | 0 |
| 0.00523082 | 0 |
| 0.00521341 | 0 |
| 0.00519607 | 0 |
| 0.00517878 | 0 |
| 0.00516154 | 0 |
| 0.00514437 | 0 |
| 0.00512725 | 0 |
| 0.00511019 | 0 |
| 0.00509318 | 0 |
| 0.00507624 | 0 |
| 0.00505935 | 0 |
| 0.00504251 | 0 |
| 0.00502573 | 0 |
| 0.00500901 | 0 |
| 0.00499234 | 0 |
| 0.00497573 | 0 |
| 0.00495917 | 0 |
| 0.00494267 | 0 |
| 0.00492622 | 0 |
| 0.00490983 | 0 |
| 0.00489349 | 0 |
| 0.00487721 | 0 |
| 0.00486098 | 0 |
| 0.0048448 | 0 |
| 0.00482868 | 0 |
| 0.00481262 | 0 |
| 0.0047966 | 0 |
| 0.00478064 | 0 |
| 0.00476473 | 0 |
| 0.00474888 | 0 |
| 0.00473308 | 0 |
| 0.00471733 | 0 |
| 0.00470163 | 0 |
| 0.00468598 | 0 |
| 0.00467039 | 0 |
| 0.00465485 | 0 |
| 0.00463936 | 0 |
| 0.00462392 | 0 |
| 0.00460854 | 0 |
| 0.0045932 | 0 |
| 0.00457792 | 0 |
| 0.00456269 | 0 |
| 0.0045475 | 0 |
| 0.00453237 | 0 |
| 0.00451729 | 0 |
| 0.00450226 | 0 |
| 0.00448728 | 0 |
| 0.00447234 | 0 |
| 0.00445746 | 0 |
| 0.00444263 | 0 |
| 0.00442785 | 0 |
| 0.00441311 | 0 |
| 0.00439843 | 0 |
| 0.00438379 | 0 |
| 0.00436921 | 0 |
| 0.00435467 | 0 |
| 0.00434018 | 0 |
| 0.00432573 | 0 |
| 0.00431134 | 0 |
| 0.00429699 | 0 |
| 0.0042827 | 0 |
| 0.00426844 | 0 |
| 0.00425424 | 0 |
| 0.00424008 | 0 |
| 0.00422598 | 0 |
| 0.00421191 | 0 |
| 0.0041979 | 0 |
| 0.00418393 | 0 |
| 0.00417001 | 0 |
| 0.00415613 | 0 |
| 0.0041423 | 0 |
| 0.00412852 | 0 |
| 0.00411478 | 0 |
| 0.00410109 | 0 |
| 0.00408744 | 0 |
| 0.00407384 | 0 |
| 0.00406028 | 0 |
| 0.00404677 | 0 |
| 0.00403331 | 0 |
| 0.00401989 | 0 |
| 0.00400651 | 0 |
| 0.00399318 | 0 |
| 0.00397989 | 0 |
| 0.00396665 | 0 |
| 0.00395345 | 0 |
| 0.00394029 | 0 |
| 0.00392718 | 0 |
| 0.00391411 | 0 |
| 0.00390109 | 0 |
| 0.00388811 | 0 |
| 0.00387517 | 0 |
| 0.00386228 | 0 |
| 0.00384942 | 0 |
| 0.00383662 | 0 |
| 0.00382385 | 0 |
| 0.00381112 | 0 |
| 0.00379844 | 0 |
| 0.0037858 | 0 |
| 0.00377321 | 0 |
| 0.00376065 | 0 |
| 0.00374814 | 0 |
| 0.00373566 | 0 |
| 0.00372323 | 0 |
| 0.00371084 | 0 |
| 0.0036985 | 0 |
| 0.00368619 | 0 |
| 0.00367392 | 0 |
| 0.0036617 | 0 |
| 0.00364951 | 0 |
| 0.00363737 | 0 |
| 0.00362527 | 0 |
| 0.0036132 | 0 |
| 0.00360118 | 0 |
| 0.0035892 | 0 |
| 0.00357725 | 0 |
| 0.00356535 | 0 |
| 0.00355349 | 0 |
| 0.00354166 | 0 |
| 0.00352988 | 0 |
| 0.00351813 | 0 |
| 0.00350643 | 0 |
| 0.00349476 | 0 |
| 0.00348313 | 0 |
| 0.00347154 | 0 |
| 0.00345999 | 0 |
| 0.00344847 | 0 |
| 0.003437 | 0 |
| 0.00342556 | 0 |
| 0.00341416 | 0 |
| 0.0034028 | 0 |
| 0.00339148 | 0 |
| 0.00338019 | 0 |
| 0.00336895 | 0 |
| 0.00335774 | 0 |
| 0.00334656 | 0 |
| 0.00333543 | 0 |
| 0.00332433 | 0 |
| 0.00331327 | 0 |
| 0.00330224 | 0 |
| 0.00329125 | 0 |
| 0.0032803 | 0 |
| 0.00326939 | 0 |
| 0.00325851 | 0 |
| 0.00324766 | 0 |
| 0.00323686 | 0 |
| 0.00322609 | 0 |
| 0.00321535 | 0 |
| 0.00320465 | 0 |
| 0.00319399 | 0 |
| 0.00318336 | 0 |
| 0.00317277 | 0 |
| 0.00316221 | 0 |
| 0.00315169 | 0 |
| 0.0031412 | 0 |
| 0.00313075 | 0 |
| 0.00312033 | 0 |
| 0.00310995 | 0 |
| 0.0030996 | 0 |
| 0.00308928 | 0 |
| 0.00307901 | 0 |
| 0.00306876 | 0 |
| 0.00305855 | 0 |
| 0.00304837 | 0 |
| 0.00303823 | 0 |
| 0.00302812 | 0 |
| 0.00301804 | 0 |
| 0.003008 | 0 |
| 0.00299799 | 0 |
| 0.00298801 | 0 |
| 0.00297807 | 0 |
| 0.00296816 | 0 |
| 0.00295828 | 0 |
| 0.00294844 | 0 |
| 0.00293863 | 0 |
| 0.00292885 | 0 |
| 0.0029191 | 0 |
| 0.00290939 | 0 |
| 0.00289971 | 0 |
| 0.00289006 | 0 |
| 0.00288044 | 0 |
| 0.00287086 | 0 |
| 0.00286131 | 0 |
| 0.00285179 | 0 |
| 0.0028423 | 0 |
| 0.00283284 | 0 |
| 0.00282341 | 0 |
| 0.00281402 | 0 |
| 0.00280465 | 0 |
| 0.00279532 | 0 |
| 0.00278602 | 0 |
| 0.00277675 | 0 |
| 0.00276751 | 0 |
| 0.0027583 | 0 |
| 0.00274912 | 0 |
| 0.00273997 | 0 |
| 0.00273086 | 0 |
| 0.00272177 | 0 |
| 0.00271271 | 0 |
| 0.00270369 | 0 |
| 0.00269469 | 0 |
| 0.00268572 | 0 |
| 0.00267679 | 0 |
| 0.00266788 | 0 |
| 0.002659 | 0 |
| 0.00265015 | 0 |
| 0.00264133 | 0 |
| 0.00263255 | 0 |
| 0.00262379 | 0 |
| 0.00261505 | 0 |
| 0.00260635 | 0 |
| 0.00259768 | 0 |
| 0.00258904 | 0 |
| 0.00258042 | 0 |
| 0.00257183 | 0 |
| 0.00256328 | 0 |
| 0.00255475 | 0 |
| 0.00254625 | 0 |
| 0.00253777 | 0 |
| 0.00252933 | 0 |
| 0.00252091 | 0 |
| 0.00251252 | 0 |
| 0.00250416 | 0 |
| 0.00249583 | 0 |
| 0.00248753 | 0 |
| 0.00247925 | 0 |
| 0.002471 | 0 |
| 0.00246278 | 0 |
| 0.00245458 | 0 |
| 0.00244641 | 0 |
| 0.00243827 | 0 |
| 0.00243016 | 0 |
| 0.00242207 | 0 |
| 0.00241401 | 0 |
| 0.00240598 | 0 |
| 0.00239798 | 0 |
| 0.00239 | 0 |
| 0.00238204 | 0 |
| 0.00237412 | 0 |
| 0.00236622 | 0 |
| 0.00235834 | 0 |
| 0.0023505 | 0 |
| 0.00234267 | 0 |
| 0.00233488 | 0 |
| 0.00232711 | 0 |
| 0.00231937 | 0 |
| 0.00231165 | 0 |
| 0.00230396 | 0 |
| 0.00229629 | 0 |
| 0.00228865 | 0 |
| 0.00228103 | 0 |
| 0.00227344 | 0 |
| 0.00226588 | 0 |
| 0.00225834 | 0 |
| 0.00225082 | 0 |
| 0.00224333 | 0 |
| 0.00223587 | 0 |
| 0.00222843 | 0 |
| 0.00222101 | 0 |
| 0.00221362 | 0 |
| 0.00220626 | 0 |
| 0.00219892 | 0 |
| 0.0021916 | 0 |
| 0.00218431 | 0 |
| 0.00217704 | 0 |
| 0.00216979 | 0 |
| 0.00216257 | 0 |
| 0.00215538 | 0 |
| 0.00214821 | 0 |
| 0.00214106 | 0 |
| 0.00213393 | 0 |
| 0.00212683 | 0 |
| 0.00211975 | 0 |
| 0.0021127 | 0 |
| 0.00210567 | 0 |
| 0.00209866 | 0 |
| 0.00209168 | 0 |
| 0.00208472 | 0 |
| 0.00207778 | 0 |
| 0.00207087 | 0 |
| 0.00206398 | 0 |
| 0.00205711 | 0 |
| 0.00205027 | 0 |
| 0.00204344 | 0 |
| 0.00203664 | 0 |
| 0.00202987 | 0 |
| 0.00202311 | 0 |
| 0.00201638 | 0 |
| 0.00200967 | 0 |
| 0.00200298 | 0 |
| 0.00199632 | 0 |
| 0.00198968 | 0 |
| 0.00198305 | 0 |
| 0.00197646 | 0 |
| 0.00196988 | 0 |
| 0.00196332 | 0 |
| 0.00195679 | 0 |
| 0.00195028 | 0 |
| 0.00194379 | 0 |
| 0.00193732 | 0 |
| 0.00193088 | 0 |
| 0.00192445 | 0 |
| 0.00191805 | 0 |
| 0.00191166 | 0 |
| 0.0019053 | 0 |
| 0.00189896 | 0 |
| 0.00189264 | 0 |
| 0.00188635 | 0 |
| 0.00188007 | 0 |
| 0.00187381 | 0 |
| 0.00186758 | 0 |
| 0.00186136 | 0 |
| 0.00185517 | 0 |
| 0.001849 | 0 |
| 0.00184284 | 0 |
| 0.00183671 | 0 |
| 0.0018306 | 0 |
| 0.00182451 | 0 |
| 0.00181844 | 0 |
| 0.00181239 | 0 |
| 0.00180636 | 0 |
| 0.00180035 | 0 |
| 0.00179436 | 0 |
| 0.00178838 | 0 |
| 0.00178243 | 0 |
| 0.0017765 | 0 |
| 0.00177059 | 0 |
| 0.0017647 | 0 |
| 0.00175883 | 0 |
| 0.00175297 | 0 |
| 0.00174714 | 0 |
| 0.00174133 | 0 |
| 0.00173553 | 0 |
| 0.00172976 | 0 |
| 0.001724 | 0 |
| 0.00171827 | 0 |
| 0.00171255 | 0 |
| 0.00170685 | 0 |
| 0.00170117 | 0 |
| 0.00169551 | 0 |
| 0.00168987 | 0 |
| 0.00168424 | 0 |
| 0.00167864 | 0 |
| 0.00167305 | 0 |
| 0.00166749 | 0 |
| 0.00166194 | 0 |
| 0.00165641 | 0 |
| 0.0016509 | 0 |
| 0.0016454 | 0 |
| 0.00163993 | 0 |
| 0.00163447 | 0 |
| 0.00162903 | 0 |
| 0.00162361 | 0 |
| 0.00161821 | 0 |
| 0.00161282 | 0 |
| 0.00160746 | 0 |
| 0.00160211 | 0 |
| 0.00159678 | 0 |
| 0.00159146 | 0 |
| 0.00158617 | 0 |
| 0.00158089 | 0 |
| 0.00157563 | 0 |
| 0.00157039 | 0 |
| 0.00156516 | 0 |
| 0.00155995 | 0 |
| 0.00155476 | 0 |
| 0.00154959 | 0 |
| 0.00154443 | 0 |
| 0.00153929 | 0 |
| 0.00153417 | 0 |
| 0.00152907 | 0 |
| 0.00152398 | 0 |
| 0.00151891 | 0 |
| 0.00151385 | 0 |
| 0.00150882 | 0 |
| 0.0015038 | 0 |
| 0.00149879 | 0 |
| 0.0014938 | 0 |
| 0.00148883 | 0 |
| 0.00148388 | 0 |
| 0.00147894 | 0 |
| 0.00147402 | 0 |
| 0.00146912 | 0 |
| 0.00146423 | 0 |
| 0.00145935 | 0 |
| 0.0014545 | 0 |
| 0.00144966 | 0 |
| 0.00144483 | 0 |
| 0.00144003 | 0 |
| 0.00143524 | 0 |
| 0.00143046 | 0 |
| 0.0014257 | 0 |
| 0.00142096 | 0 |
| 0.00141623 | 0 |
| 0.00141151 | 0 |
| 0.00140682 | 0 |
| 0.00140214 | 0 |
| 0.00139747 | 0 |
| 0.00139282 | 0 |
| 0.00138819 | 0 |
| 0.00138357 | 0 |
| 0.00137896 | 0 |
| 0.00137437 | 0 |
| 0.0013698 | 0 |
| 0.00136524 | 0 |
| 0.0013607 | 0 |
| 0.00135617 | 0 |
| 0.00135166 | 0 |
| 0.00134716 | 0 |
| 0.00134268 | 0 |
| 0.00133821 | 0 |
| 0.00133376 | 0 |
| 0.00132932 | 0 |
| 0.0013249 | 0 |
| 0.00132049 | 0 |
| 0.00131609 | 0 |
| 0.00131171 | 0 |
| 0.00130735 | 0 |
| 0.001303 | 0 |
| 0.00129866 | 0 |
| 0.00129434 | 0 |
| 0.00129004 | 0 |
| 0.00128574 | 0 |
| 0.00128146 | 0 |
| 0.0012772 | 0 |
| 0.00127295 | 0 |
| 0.00126871 | 0 |
| 0.00126449 | 0 |
| 0.00126029 | 0 |
| 0.00125609 | 0 |
| 0.00125191 | 0 |
| 0.00124775 | 0 |
| 0.00124359 | 0 |
| 0.00123946 | 0 |
| 0.00123533 | 0 |
| 0.00123122 | 0 |
| 0.00122712 | 0 |
| 0.00122304 | 0 |
| 0.00121897 | 0 |
| 0.00121491 | 0 |
| 0.00121087 | 0 |
| 0.00120684 | 0 |
| 0.00120283 | 0 |
| 0.00119882 | 0 |
| 0.00119484 | 0 |
| 0.00119086 | 0 |
| 0.0011869 | 0 |
| 0.00118295 | 0 |
| 0.00117901 | 0 |
| 0.00117509 | 0 |
| 0.00117118 | 0 |
| 0.00116728 | 0 |
| 0.0011634 | 0 |
| 0.00115953 | 0 |
| 0.00115567 | 0 |
| 0.00115182 | 0 |
| 0.00114799 | 0 |
| 0.00114417 | 0 |
| 0.00114036 | 0 |
| 0.00113657 | 0 |
| 0.00113278 | 0 |
| 0.00112902 | 0 |
| 0.00112526 | 0 |
| 0.00112151 | 0 |
| 0.00111778 | 0 |
| 0.00111406 | 0 |
| 0.00111036 | 0 |
| 0.00110666 | 0 |
| 0.00110298 | 0 |
| 0.00109931 | 0 |
| 0.00109565 | 0 |
| 0.001092 | 0 |
| 0.00108837 | 0 |
| 0.00108475 | 0 |
| 0.00108114 | 0 |
| 0.00107754 | 0 |
| 0.00107396 | 0 |
| 0.00107038 | 0 |
| 0.00106682 | 0 |
| 0.00106327 | 0 |
| 0.00105973 | 0 |
| 0.00105621 | 0 |
| 0.00105269 | 0 |
| 0.00104919 | 0 |
| 0.0010457 | 0 |
| 0.00104222 | 0 |
| 0.00103875 | 0 |
| 0.00103529 | 0 |
| 0.00103185 | 0 |
| 0.00102842 | 0 |
| 0.00102499 | 0 |
| 0.00102158 | 0 |
| 0.00101818 | 0 |
| 0.0010148 | 0 |
| 0.00101142 | 0 |
| 0.00100805 | 0 |
| 0.0010047 | 0 |
| 0.00100136 | 0 |
| 0.000998024 | 0 |
| 0.000994703 | 0 |
| 0.000991393 | 0 |
| 0.000988094 | 0 |
| 0.000984806 | 0 |
| 0.000981529 | 0 |
| 0.000978263 | 0 |
| 0.000975008 | 0 |
| 0.000971763 | 0 |
| 0.00096853 | 0 |
| 0.000965307 | 0 |
| 0.000962095 | 0 |
| 0.000958893 | 0 |
| 0.000955703 | 0 |
| 0.000952522 | 0 |
| 0.000949353 | 0 |
| 0.000946194 | 0 |
| 0.000943045 | 0 |
| 0.000939907 | 0 |
| 0.00093678 | 0 |
| 0.000933663 | 0 |
| 0.000930556 | 0 |
| 0.000927459 | 0 |
| 0.000924373 | 0 |
| 0.000921297 | 0 |
| 0.000918232 | 0 |
| 0.000915176 | 0 |
| 0.000912131 | 0 |
| 0.000909096 | 0 |
| 0.000906071 | 0 |
| 0.000903056 | 0 |
| 0.000900051 | 0 |
| 0.000897056 | 0 |
| 0.000894071 | 0 |
| 0.000891096 | 0 |
| 0.000888131 | 0 |
| 0.000885175 | 0 |
| 0.00088223 | 0 |
| 0.000879294 | 0 |
| 0.000876368 | 0 |
| 0.000873452 | 0 |
| 0.000870546 | 0 |
| 0.000867649 | 0 |
| 0.000864762 | 0 |
| 0.000861884 | 0 |
| 0.000859016 | 0 |
| 0.000856158 | 0 |
| 0.000853309 | 0 |
| 0.00085047 | 0 |
| 0.00084764 | 0 |
| 0.000844819 | 0 |
| 0.000842008 | 0 |
| 0.000839206 | 0 |
| 0.000836414 | 0 |
| 0.00083363 | 0 |
| 0.000830856 | 0 |
| 0.000828092 | 0 |
| 0.000825336 | 0 |
| 0.00082259 | 0 |
| 0.000819853 | 0 |
| 0.000817125 | 0 |
| 0.000814406 | 0 |
| 0.000811696 | 0 |
| 0.000808995 | 0 |
| 0.000806303 | 0 |
| 0.00080362 | 0 |
| 0.000800946 | 0 |
| 0.00079828 | 0 |
| 0.000795624 | 0 |
| 0.000792977 | 0 |
| 0.000790338 | 0 |
| 0.000787708 | 0 |
| 0.000785087 | 0 |
| 0.000782475 | 0 |
| 0.000779871 | 0 |
| 0.000777276 | 0 |
| 0.000774689 | 0 |
| 0.000772112 | 0 |
| 0.000769542 | 0 |
| 0.000766982 | 0 |
| 0.000764429 | 0 |
| 0.000761886 | 0 |
| 0.000759351 | 0 |
| 0.000756824 | 0 |
| 0.000754305 | 0 |
| 0.000751795 | 0 |
| 0.000749294 | 0 |
| 0.000746801 | 0 |
| 0.000744315 | 0 |
| 0.000741839 | 0 |
| 0.00073937 | 0 |
| 0.00073691 | 0 |
| 0.000734458 | 0 |
| 0.000732014 | 0 |
| 0.000729578 | 0 |
| 0.00072715 | 0 |
| 0.000724731 | 0 |
| 0.000722319 | 0 |
| 0.000719916 | 0 |
| 0.00071752 | 0 |
| 0.000715133 | 0 |
| 0.000712753 | 0 |
| 0.000710381 | 0 |
| 0.000708017 | 0 |
| 0.000705661 | 0 |
| 0.000703313 | 0 |
| 0.000700973 | 0 |
| 0.000698641 | 0 |
| 0.000696316 | 0 |
| 0.000693999 | 0 |
| 0.000691689 | 0 |
| 0.000689388 | 0 |
| 0.000687094 | 0 |
| 0.000684807 | 0 |
| 0.000682529 | 0 |
| 0.000680258 | 0 |
| 0.000677994 | 0 |
| 0.000675738 | 0 |
| 0.000673489 | 0 |
| 0.000671248 | 0 |
| 0.000669015 | 0 |
| 0.000666789 | 0 |
| 0.00066457 | 0 |
| 0.000662358 | 0 |
| 0.000660154 | 0 |
| 0.000657958 | 0 |
| 0.000655768 | 0 |
| 0.000653586 | 0 |
| 0.000651411 | 0 |
| 0.000649244 | 0 |
| 0.000647083 | 0 |
| 0.00064493 | 0 |
| 0.000642784 | 0 |
| 0.000640645 | 0 |
| 0.000638513 | 0 |
| 0.000636389 | 0 |
| 0.000634271 | 0 |
| 0.000632161 | 0 |
| 0.000630057 | 0 |
| 0.000627961 | 0 |
| 0.000625871 | 0 |
| 0.000623788 | 0 |
| 0.000621713 | 0 |
| 0.000619644 | 0 |
| 0.000617582 | 0 |
| 0.000615527 | 0 |
| 0.000613479 | 0 |
| 0.000611437 | 0 |
| 0.000609403 | 0 |
| 0.000607375 | 0 |
| 0.000605354 | 0 |
| 0.00060334 | 0 |
| 0.000601332 | 0 |
| 0.000599331 | 0 |
| 0.000597337 | 0 |
| 0.000595349 | 0 |
| 0.000593368 | 0 |
| 0.000591394 | 0 |
| 0.000589426 | 0 |
| 0.000587464 | 0 |
| 0.00058551 | 0 |
| 0.000583561 | 0 |
| 0.000581619 | 0 |
| 0.000579684 | 0 |
| 0.000577755 | 0 |
| 0.000575833 | 0 |
| 0.000573916 | 0 |
| 0.000572007 | 0 |
| 0.000570103 | 0 |
| 0.000568206 | 0 |
| 0.000566316 | 0 |
| 0.000564431 | 0 |
| 0.000562553 | 0 |
| 0.000560681 | 0 |
| 0.000558815 | 0 |
| 0.000556956 | 0 |
| 0.000555103 | 0 |
| 0.000553255 | 0 |
| 0.000551414 | 0 |
| 0.00054958 | 0 |
| 0.000547751 | 0 |
| 0.000545928 | 0 |
| 0.000544112 | 0 |
| 0.000542301 | 0 |
| 0.000540497 | 0 |
| 0.000538698 | 0 |
| 0.000536905 | 0 |
| 0.000535119 | 0 |
| 0.000533338 | 0 |
| 0.000531564 | 0 |
| 0.000529795 | 0 |
| 0.000528032 | 0 |
| 0.000526275 | 0 |
| 0.000524524 | 0 |
| 0.000522778 | 0 |
| 0.000521039 | 0 |
| 0.000519305 | 0 |
| 0.000517577 | 0 |
| 0.000515855 | 0 |
| 0.000514138 | 0 |
| 0.000512427 | 0 |
| 0.000510722 | 0 |
| 0.000509023 | 0 |
| 0.000507329 | 0 |
| 0.000505641 | 0 |
| 0.000503958 | 0 |
| 0.000502281 | 0 |
| 0.00050061 | 0 |
| 0.000498944 | 0 |
| 0.000497284 | 0 |
| 0.000495629 | 0 |
| 0.00049398 | 0 |
| 0.000492336 | 0 |
| 0.000490698 | 0 |
| 0.000489065 | 0 |
| 0.000487438 | 0 |
| 0.000485816 | 0 |
| 0.000484199 | 0 |
| 0.000482588 | 0 |
| 0.000480982 | 0 |
| 0.000479382 | 0 |
| 0.000477786 | 0 |
| 0.000476197 | 0 |
| 0.000474612 | 0 |
| 0.000473033 | 0 |
| 0.000471459 | 0 |
| 0.00046989 | 0 |
| 0.000468326 | 0 |
| 0.000466768 | 0 |
| 0.000465215 | 0 |
| 0.000463667 | 0 |
| 0.000462124 | 0 |
| 0.000460586 | 0 |
| 0.000459054 | 0 |
| 0.000457526 | 0 |
| 0.000456004 | 0 |
| 0.000454486 | 0 |
| 0.000452974 | 0 |
| 0.000451467 | 0 |
| 0.000449964 | 0 |
| 0.000448467 | 0 |
| 0.000446975 | 0 |
| 0.000445487 | 0 |
| 0.000444005 | 0 |
| 0.000442528 | 0 |
| 0.000441055 | 0 |
| 0.000439587 | 0 |
| 0.000438125 | 0 |
| 0.000436667 | 0 |
| 0.000435214 | 0 |
| 0.000433766 | 0 |
| 0.000432322 | 0 |
| 0.000430884 | 0 |
| 0.00042945 | 0 |
| 0.000428021 | 0 |
| 0.000426597 | 0 |
| 0.000425177 | 0 |
| 0.000423762 | 0 |
| 0.000422352 | 0 |
| 0.000420947 | 0 |
| 0.000419546 | 0 |
| 0.00041815 | 0 |
| 0.000416759 | 0 |
| 0.000415372 | 0 |
| 0.00041399 | 0 |
| 0.000412612 | 0 |
| 0.000411239 | 0 |
| 0.000409871 | 0 |
| 0.000408507 | 0 |
| 0.000407147 | 0 |
| 0.000405793 | 0 |
| 0.000404442 | 0 |
| 0.000403097 | 0 |
| 0.000401755 | 0 |
| 0.000400418 | 0 |
| 0.000399086 | 0 |
| 0.000397758 | 0 |
| 0.000396434 | 0 |
| 0.000395115 | 0 |
| 0.000393801 | 0 |
| 0.00039249 | 0 |
| 0.000391184 | 0 |
| 0.000389882 | 0 |
| 0.000388585 | 0 |
| 0.000387292 | 0 |
| 0.000386003 | 0 |
| 0.000384719 | 0 |
| 0.000383439 | 0 |
| 0.000382163 | 0 |
| 0.000380891 | 0 |
| 0.000379624 | 0 |
| 0.000378361 | 0 |
| 0.000377102 | 0 |
| 0.000375847 | 0 |
| 0.000374596 | 0 |
| 0.00037335 | 0 |
| 0.000372107 | 0 |
| 0.000370869 | 0 |
| 0.000369635 | 0 |
| 0.000368405 | 0 |
| 0.000367179 | 0 |
| 0.000365957 | 0 |
| 0.00036474 | 0 |
| 0.000363526 | 0 |
| 0.000362316 | 0 |
| 0.000361111 | 0 |
| 0.000359909 | 0 |
| 0.000358711 | 0 |
| 0.000357518 | 0 |
| 0.000356328 | 0 |
| 0.000355142 | 0 |
| 0.000353961 | 0 |
| 0.000352783 | 0 |
| 0.000351609 | 0 |
| 0.000350439 | 0 |
| 0.000349273 | 0 |
| 0.000348111 | 0 |
| 0.000346952 | 0 |
| 0.000345798 | 0 |
| 0.000344647 | 0 |
| 0.0003435 | 0 |
| 0.000342357 | 0 |
| 0.000341218 | 0 |
| 0.000340083 | 0 |
| 0.000338951 | 0 |
| 0.000337823 | 0 |
| 0.000336699 | 0 |
| 0.000335579 | 0 |
| 0.000334462 | 0 |
| 0.000333349 | 0 |
| 0.00033224 | 0 |
| 0.000331134 | 0 |
| 0.000330032 | 0 |
| 0.000328934 | 0 |
| 0.00032784 | 0 |
| 0.000326749 | 0 |
| 0.000325661 | 0 |
| 0.000324578 | 0 |
| 0.000323498 | 0 |
| 0.000322421 | 0 |
| 0.000321348 | 0 |
| 0.000320279 | 0 |
| 0.000319213 | 0 |
| 0.000318151 | 0 |
| 0.000317093 | 0 |
| 0.000316037 | 0 |
| 0.000314986 | 0 |
| 0.000313938 | 0 |
| 0.000312893 | 0 |
| 0.000311852 | 0 |
| 0.000310814 | 0 |
| 0.00030978 | 0 |
| 0.000308749 | 0 |
| 0.000307722 | 0 |
| 0.000306698 | 0 |
| 0.000305677 | 0 |
| 0.00030466 | 0 |
| 0.000303646 | 0 |
| 0.000302636 | 0 |
| 0.000301629 | 0 |
| 0.000300625 | 0 |
| 0.000299625 | 0 |
| 0.000298628 | 0 |
| 0.000297634 | 0 |
| 0.000296644 | 0 |
| 0.000295657 | 0 |
| 0.000294673 | 0 |
| 0.000293692 | 0 |
| 0.000292715 | 0 |
| 0.000291741 | 0 |
| 0.00029077 | 0 |
| 0.000289803 | 0 |
| 0.000288838 | 0 |
| 0.000287877 | 0 |
| 0.000286919 | 0 |
| 0.000285965 | 0 |
| 0.000285013 | 0 |
| 0.000284065 | 0 |
| 0.000283119 | 0 |
| 0.000282177 | 0 |
| 0.000281238 | 0 |
| 0.000280302 | 0 |
| 0.00027937 | 0 |
| 0.00027844 | 0 |
| 0.000277514 | 0 |
| 0.00027659 | 0 |
| 0.00027567 | 0 |
| 0.000274753 | 0 |
| 0.000273838 | 0 |
| 0.000272927 | 0 |
| 0.000272019 | 0 |
| 0.000271114 | 0 |
| 0.000270212 | 0 |
| 0.000269312 | 0 |
| 0.000268416 | 0 |
| 0.000267523 | 0 |
| 0.000266633 | 0 |
| 0.000265746 | 0 |
| 0.000264861 | 0 |
| 0.00026398 | 0 |
| 0.000263102 | 0 |
| 0.000262226 | 0 |
| 0.000261354 | 0 |
| 0.000260484 | 0 |
| 0.000259617 | 0 |
| 0.000258753 | 0 |
| 0.000257892 | 0 |
| 0.000257034 | 0 |
| 0.000256179 | 0 |
| 0.000255326 | 0 |
| 0.000254477 | 0 |
| 0.00025363 | 0 |
| 0.000252786 | 0 |
| 0.000251945 | 0 |
| 0.000251107 | 0 |
| 0.000250271 | 0 |
| 0.000249438 | 0 |
| 0.000248608 | 0 |
| 0.000247781 | 0 |
| 0.000246956 | 0 |
| 0.000246135 | 0 |
| 0.000245316 | 0 |
| 0.000244499 | 0 |
| 0.000243686 | 0 |
| 0.000242875 | 0 |
| 0.000242067 | 0 |
| 0.000241261 | 0 |
| 0.000240458 | 0 |
| 0.000239658 | 0 |
| 0.000238861 | 0 |
| 0.000238066 | 0 |
| 0.000237274 | 0 |
| 0.000236484 | 0 |
| 0.000235697 | 0 |
| 0.000234913 | 0 |
| 0.000234131 | 0 |
| 0.000233352 | 0 |
| 0.000232576 | 0 |
| 0.000231802 | 0 |
| 0.000231031 | 0 |
| 0.000230262 | 0 |
| 0.000229496 | 0 |
| 0.000228732 | 0 |
| 0.000227971 | 0 |
| 0.000227212 | 0 |
| 0.000226456 | 0 |
| 0.000225703 | 0 |
| 0.000224952 | 0 |
| 0.000224203 | 0 |
| 0.000223457 | 0 |
| 0.000222713 | 0 |
| 0.000221972 | 0 |
| 0.000221234 | 0 |
| 0.000220498 | 0 |
| 0.000219764 | 0 |
| 0.000219033 | 0 |
| 0.000218304 | 0 |
| 0.000217577 | 0 |
| 0.000216853 | 0 |
| 0.000216132 | 0 |
| 0.000215413 | 0 |
| 0.000214696 | 0 |
| 0.000213981 | 0 |
| 0.000213269 | 0 |
| 0.00021256 | 0 |
| 0.000211852 | 0 |
| 0.000211147 | 0 |
| 0.000210445 | 0 |
| 0.000209745 | 0 |
| 0.000209047 | 0 |
| 0.000208351 | 0 |
| 0.000207658 | 0 |
| 0.000206967 | 0 |
| 0.000206278 | 0 |
| 0.000205592 | 0 |
| 0.000204908 | 0 |
| 0.000204226 | 0 |
| 0.000203546 | 0 |
| 0.000202869 | 0 |
| 0.000202194 | 0 |
| 0.000201521 | 0 |
| 0.00020085 | 0 |
| 0.000200182 | 0 |
| 0.000199516 | 0 |
| 0.000198852 | 0 |
| 0.00019819 | 0 |
| 0.000197531 | 0 |
| 0.000196874 | 0 |
| 0.000196218 | 0 |
| 0.000195566 | 0 |
| 0.000194915 | 0 |
| 0.000194266 | 0 |
| 0.00019362 | 0 |
| 0.000192975 | 0 |
| 0.000192333 | 0 |
| 0.000191693 | 0 |
| 0.000191055 | 0 |
| 0.00019042 | 0 |
| 0.000189786 | 0 |
| 0.000189155 | 0 |
| 0.000188525 | 0 |
| 0.000187898 | 0 |
| 0.000187273 | 0 |
| 0.000186649 | 0 |
| 0.000186028 | 0 |
| 0.000185409 | 0 |
| 0.000184792 | 0 |
| 0.000184177 | 0 |
| 0.000183565 | 0 |
| 0.000182954 | 0 |
| 0.000182345 | 0 |
| 0.000181738 | 0 |
| 0.000181134 | 0 |
| 0.000180531 | 0 |
| 0.00017993 | 0 |
| 0.000179331 | 0 |
| 0.000178735 | 0 |
| 0.00017814 | 0 |
| 0.000177547 | 0 |
| 0.000176956 | 0 |
| 0.000176367 | 0 |
| 0.000175781 | 0 |
| 0.000175196 | 0 |
| 0.000174613 | 0 |
| 0.000174032 | 0 |
| 0.000173453 | 0 |
| 0.000172875 | 0 |
| 0.0001723 | 0 |
| 0.000171727 | 0 |
| 0.000171155 | 0 |
| 0.000170586 | 0 |
| 0.000170018 | 0 |
| 0.000169452 | 0 |
| 0.000168889 | 0 |
| 0.000168327 | 0 |
| 0.000167767 | 0 |
| 0.000167208 | 0 |
| 0.000166652 | 0 |
| 0.000166097 | 0 |
| 0.000165545 | 0 |
| 0.000164994 | 0 |
| 0.000164445 | 0 |
| 0.000163898 | 0 |
| 0.000163352 | 0 |
| 0.000162809 | 0 |
| 0.000162267 | 0 |
| 0.000161727 | 0 |
| 0.000161189 | 0 |
| 0.000160652 | 0 |
| 0.000160118 | 0 |
| 0.000159585 | 0 |
| 0.000159054 | 0 |
| 0.000158525 | 0 |
| 0.000157997 | 0 |
| 0.000157472 | 0 |
| 0.000156948 | 0 |
| 0.000156425 | 0 |
| 0.000155905 | 0 |
| 0.000155386 | 0 |
| 0.000154869 | 0 |
| 0.000154354 | 0 |
| 0.00015384 | 0 |
| 0.000153328 | 0 |
| 0.000152818 | 0 |
| 0.000152309 | 0 |
| 0.000151803 | 0 |
| 0.000151297 | 0 |
| 0.000150794 | 0 |
| 0.000150292 | 0 |
| 0.000149792 | 0 |
| 0.000149294 | 0 |
| 0.000148797 | 0 |
| 0.000148302 | 0 |
| 0.000147808 | 0 |
| 0.000147316 | 0 |
| 0.000146826 | 0 |
| 0.000146338 | 0 |
| 0.000145851 | 0 |
| 0.000145365 | 0 |
| 0.000144882 | 0 |
| 0.0001444 | 0 |
| 0.000143919 | 0 |
| 0.00014344 | 0 |
| 0.000142963 | 0 |
| 0.000142487 | 0 |
| 0.000142013 | 0 |
| 0.00014154 | 0 |
| 0.000141069 | 0 |
| 0.0001406 | 0 |
| 0.000140132 | 0 |
| 0.000139666 | 0 |
| 0.000139201 | 0 |
| 0.000138738 | 0 |
| 0.000138276 | 0 |
| 0.000137816 | 0 |
| 0.000137358 | 0 |
| 0.000136901 | 0 |
| 0.000136445 | 0 |
| 0.000135991 | 0 |
| 0.000135538 | 0 |
| 0.000135087 | 0 |
| 0.000134638 | 0 |
| 0.00013419 | 0 |
| 0.000133743 | 0 |
| 0.000133298 | 0 |
| 0.000132855 | 0 |
| 0.000132413 | 0 |
| 0.000131972 | 0 |
| 0.000131533 | 0 |
| 0.000131095 | 0 |
| 0.000130659 | 0 |
| 0.000130224 | 0 |
| 0.000129791 | 0 |
| 0.000129359 | 0 |
| 0.000128929 | 0 |
| 0.0001285 | 0 |
| 0.000128072 | 0 |
| 0.000127646 | 0 |
| 0.000127221 | 0 |
| 0.000126798 | 0 |
| 0.000126376 | 0 |
| 0.000125955 | 0 |
| 0.000125536 | 0 |
| 0.000125119 | 0 |
| 0.000124702 | 0 |
| 0.000124287 | 0 |
| 0.000123874 | 0 |
| 0.000123461 | 0 |
| 0.000123051 | 0 |
| 0.000122641 | 0 |
| 0.000122233 | 0 |
| 0.000121826 | 0 |
| 0.000121421 | 0 |
| 0.000121017 | 0 |
| 0.000120614 | 0 |
| 0.000120213 | 0 |
| 0.000119813 | 0 |
| 0.000119414 | 0 |
| 0.000119017 | 0 |
| 0.000118621 | 0 |
| 0.000118226 | 0 |
| 0.000117833 | 0 |
| 0.000117441 | 0 |
| 0.00011705 | 0 |
| 0.00011666 | 0 |
| 0.000116272 | 0 |
| 0.000115885 | 0 |
| 0.0001155 | 0 |
| 0.000115115 | 0 |
| 0.000114732 | 0 |
| 0.00011435 | 0 |
| 0.00011397 | 0 |
| 0.000113591 | 0 |
| 0.000113213 | 0 |
| 0.000112836 | 0 |
| 0.000112461 | 0 |
| 0.000112086 | 0 |
| 0.000111713 | 0 |
| 0.000111342 | 0 |
| 0.000110971 | 0 |
| 0.000110602 | 0 |
| 0.000110234 | 0 |
| 0.000109867 | 0 |
| 0.000109501 | 0 |
| 0.000109137 | 0 |
| 0.000108774 | 0 |
| 0.000108412 | 0 |
| 0.000108051 | 0 |
| 0.000107692 | 0 |
| 0.000107333 | 0 |
| 0.000106976 | 0 |
| 0.00010662 | 0 |
| 0.000106265 | 0 |
| 0.000105912 | 0 |
| 0.000105559 | 0 |
| 0.000105208 | 0 |
| 0.000104858 | 0 |
| 0.000104509 | 0 |
| 0.000104161 | 0 |
| 0.000103815 | 0 |
| 0.000103469 | 0 |
| 0.000103125 | 0 |
| 0.000102782 | 0 |
| 0.00010244 | 0 |
| 0.000102099 | 0 |
| 0.000101759 | 0 |
| 0.000101421 | 0 |
| 9.9737e-05 | 0 |
| 9.67964e-05 | 0 |
| 9.39426e-05 | 0 |
| 9.11729e-05 | 0 |
| 8.84849e-05 | 0 |
| 8.58761e-05 | 0 |
| 8.33442e-05 | 0 |
| 8.0887e-05 | 0 |
| 7.85022e-05 | 0 |
| 7.61877e-05 | 0 |
| 7.39415e-05 | 0 |
| 7.17615e-05 | 0 |
| 6.96457e-05 | 0 |
| 6.75924e-05 | 0 |
| 6.55996e-05 | 0 |
| 6.36655e-05 | 0 |
| 6.17885e-05 | 0 |
| 5.99668e-05 | 0 |
| 5.81988e-05 | 0 |
| 5.64829e-05 | 0 |
| 5.48176e-05 | 0 |
| 5.32014e-05 | 0 |
| 5.16329e-05 | 0 |
| 5.01106e-05 | 0 |
| 4.86332e-05 | 0 |
| 4.71994e-05 | 0 |
| 4.58078e-05 | 0 |
| 4.44572e-05 | 0 |
| 4.31465e-05 | 0 |
| 4.18744e-05 | 0 |
| 4.06399e-05 | 0 |
| 3.94417e-05 | 0 |
| 3.82788e-05 | 0 |
| 3.71502e-05 | 0 |
| 3.6055e-05 | 0 |
| 3.49919e-05 | 0 |
| 3.39603e-05 | 0 |
| 3.2959e-05 | 0 |
| 3.19873e-05 | 0 |
| 3.10442e-05 | 0 |
| 3.0129e-05 | 0 |
| 2.92407e-05 | 0 |
| 2.83786e-05 | 0 |
| 2.75419e-05 | 0 |
| 2.67299e-05 | 0 |
| 2.59418e-05 | 0 |
| 2.5177e-05 | 0 |
| 2.44347e-05 | 0 |
| 2.37143e-05 | 0 |
| 2.30151e-05 | 0 |
| 2.23366e-05 | 0 |
| 2.1678e-05 | 0 |
| 2.10389e-05 | 0 |
| 2.04186e-05 | 0 |
| 1.98166e-05 | 0 |
| 1.92323e-05 | 0 |
| 1.86653e-05 | 0 |
| 1.8115e-05 | 0 |
| 1.75809e-05 | 0 |
| 1.70626e-05 | 0 |
| 1.65595e-05 | 0 |
| 1.60713e-05 | 0 |
| 1.55975e-05 | 0 |
| 1.51376e-05 | 0 |
| 1.46913e-05 | 0 |
| 1.42582e-05 | 0 |
| 1.38378e-05 | 0 |
| 1.34298e-05 | 0 |
| 1.30339e-05 | 0 |
| 1.26496e-05 | 0 |
| 1.22767e-05 | 0 |
| 1.19147e-05 | 0 |
| 1.15634e-05 | 0 |
| 1.12225e-05 | 0 |
| 1.08916e-05 | 0 |
| 1.05705e-05 | 0 |
| 1.02589e-05 | 0 |
| 9.9564e-06 | 0 |
| 9.66286e-06 | 0 |
| 9.37797e-06 | 0 |
| 9.10148e-06 | 0 |
| 8.83314e-06 | 0 |
| 8.57272e-06 | 0 |
| 8.31997e-06 | 0 |
| 8.07467e-06 | 0 |
| 7.83661e-06 | 0 |
| 7.60556e-06 | 0 |
| 7.38133e-06 | 0 |
| 7.16371e-06 | 0 |
| 6.9525e-06 | 0 |
| 6.74752e-06 | 0 |
| 6.54858e-06 | 0 |
| 6.35551e-06 | 0 |
| 6.16813e-06 | 0 |
| 5.98628e-06 | 0 |
| 5.80979e-06 | 0 |
| 5.6385e-06 | 0 |
| 5.47226e-06 | 0 |
| 5.31092e-06 | 0 |
| 5.15434e-06 | 0 |
| 5.00237e-06 | 0 |
| 4.85489e-06 | 0 |
| 4.71175e-06 | 0 |
| 4.57284e-06 | 0 |
| 4.43802e-06 | 0 |
| 4.30717e-06 | 0 |
| 4.18018e-06 | 0 |
| 4.05694e-06 | 0 |
| 3.93733e-06 | 0 |
| 3.82125e-06 | 0 |
| 3.70858e-06 | 0 |
| 3.59924e-06 | 0 |
| 3.49313e-06 | 0 |
| 3.39014e-06 | 0 |
| 3.29019e-06 | 0 |
| 3.19319e-06 | 0 |
| 3.09904e-06 | 0 |
| 3.00767e-06 | 0 |
| 2.919e-06 | 0 |
| 2.83294e-06 | 0 |
| 2.74941e-06 | 0 |
| 2.66835e-06 | 0 |
| 2.58968e-06 | 0 |
| 2.51333e-06 | 0 |
| 2.43923e-06 | 0 |
| 2.36732e-06 | 0 |
| 2.29752e-06 | 0 |
| 2.22978e-06 | 0 |
| 2.16404e-06 | 0 |
| 2.10024e-06 | 0 |
| 2.03832e-06 | 0 |
| 1.97822e-06 | 0 |
| 1.9199e-06 | 0 |
| 1.8633e-06 | 0 |
| 1.80836e-06 | 0 |
| 1.75504e-06 | 0 |
| 1.7033e-06 | 0 |
| 1.65308e-06 | 0 |
| 1.60434e-06 | 0 |
| 1.55704e-06 | 0 |
| 1.51114e-06 | 0 |
| 1.46659e-06 | 0 |
| 1.42335e-06 | 0 |
| 1.38138e-06 | 0 |
| 1.34065e-06 | 0 |
| 1.30113e-06 | 0 |
| 1.26277e-06 | 0 |
| 1.22554e-06 | 0 |
| 1.1894e-06 | 0 |
| 1.15434e-06 | 0 |
| 1.1203e-06 | 0 |
| 1.08727e-06 | 0 |
| 1.05522e-06 | 0 |
| 1.02411e-06 | 0 |
| 9.93914e-07 | 0 |
| 9.64611e-07 | 0 |
| 9.36171e-07 | 0 |
| 9.0857e-07 | 0 |
| 8.81783e-07 | 0 |
| 8.55786e-07 | 0 |
| 8.30554e-07 | 0 |
| 8.06067e-07 | 0 |
| 7.82302e-07 | 0 |
| 7.59238e-07 | 0 |
| 7.36853e-07 | 0 |
| 7.15129e-07 | 0 |
| 6.94045e-07 | 0 |
| 6.73582e-07 | 0 |
| 6.53723e-07 | 0 |
| 6.34449e-07 | 0 |
| 6.15744e-07 | 0 |
| 5.9759e-07 | 0 |
| 5.79971e-07 | 0 |
| 5.62872e-07 | 0 |
| 5.46277e-07 | 0 |
| 5.30171e-07 | 0 |
| 5.1454e-07 | 0 |
| 4.9937e-07 | 0 |
| 4.84647e-07 | 0 |
| 4.70358e-07 | 0 |
| 4.56491e-07 | 0 |
| 4.43032e-07 | 0 |
| 4.2997e-07 | 0 |
| 4.17294e-07 | 0 |
| 4.04991e-07 | 0 |
| 3.9305e-07 | 0 |
| 3.81462e-07 | 0 |
| 3.70215e-07 | 0 |
| 3.593e-07 | 0 |
| 3.48707e-07 | 0 |
| 3.38426e-07 | 0 |
| 3.28449e-07 | 0 |
| 3.18765e-07 | 0 |
| 3.09367e-07 | 0 |
| 3.00246e-07 | 0 |
| 2.91394e-07 | 0 |
| 2.82803e-07 | 0 |
| 2.74465e-07 | 0 |
| 2.66373e-07 | 0 |
| 2.58519e-07 | 0 |
| 2.50897e-07 | 0 |
| 2.435e-07 | 0 |
| 2.36321e-07 | 0 |
| 2.29354e-07 | 0 |
| 2.22592e-07 | 0 |
| 2.16029e-07 | 0 |
| 2.0966e-07 | 0 |
| 2.03478e-07 | 0 |
| 1.97479e-07 | 0 |
| 1.91657e-07 | 0 |
| 1.86006e-07 | 0 |
| 1.80522e-07 | 0 |
| 1.752e-07 | 0 |
| 1.70035e-07 | 0 |
| 1.65022e-07 | 0 |
| 1.60156e-07 | 0 |
| 1.55434e-07 | 0 |
| 1.50852e-07 | 0 |
| 1.46404e-07 | 0 |
| 1.42088e-07 | 0 |
| 1.37899e-07 | 0 |
| 1.33833e-07 | 0 |
| 1.29887e-07 | 0 |
| 1.26058e-07 | 0 |
| 1.22341e-07 | 0 |
| 1.18734e-07 | 0 |
| 1.15234e-07 | 0 |
| 1.11836e-07 | 0 |
| 1.08539e-07 | 0 |
| 1.05339e-07 | 0 |
| 1.02233e-07 | 0 |
| 9.92191e-08 | 0 |
| 9.62938e-08 | 0 |
| 9.34548e-08 | 0 |
| 9.06995e-08 | 0 |
| 8.80254e-08 | 0 |
| 8.54302e-08 | 0 |
| 8.29115e-08 | 0 |
| 8.0467e-08 | 0 |
| 7.80946e-08 | 0 |
| 7.57921e-08 | 0 |
| 7.35576e-08 | 0 |
| 7.13889e-08 | 0 |
| 6.92841e-08 | 0 |
| 6.72414e-08 | 0 |
| 6.5259e-08 | 0 |
| 6.33349e-08 | 0 |
| 6.14676e-08 | 0 |
| 5.96554e-08 | 0 |
| 5.78966e-08 | 0 |
| 5.61896e-08 | 0 |
| 5.4533e-08 | 0 |
| 5.29252e-08 | 0 |
| 5.13648e-08 | 0 |
| 4.98504e-08 | 0 |
| 4.83807e-08 | 0 |
| 4.69543e-08 | 0 |
| 4.55699e-08 | 0 |
| 4.42264e-08 | 0 |
| 4.29225e-08 | 0 |
| 4.1657e-08 | 0 |
| 4.04288e-08 | 0 |
| 3.92369e-08 | 0 |
| 3.80801e-08 | 0 |
| 3.69574e-08 | 0 |
| 3.58677e-08 | 0 |
| 3.48103e-08 | 0 |
| 3.3784e-08 | 0 |
| 3.27879e-08 | 0 |
| 3.18212e-08 | 0 |
| 3.0883e-08 | 0 |
| 2.99725e-08 | 0 |
| 2.90888e-08 | 0 |
| 2.82312e-08 | 0 |
| 2.73989e-08 | 0 |
| 2.65911e-08 | 0 |
| 2.58071e-08 | 0 |
| 2.50462e-08 | 0 |
| 2.43078e-08 | 0 |
| 2.35911e-08 | 0 |
| 2.28956e-08 | 0 |
| 2.22206e-08 | 0 |
| 2.15654e-08 | 0 |
| 2.09296e-08 | 0 |
| 2.03126e-08 | 0 |
| 1.97137e-08 | 0 |
| 1.91325e-08 | 0 |
| 1.85684e-08 | 0 |
| 1.8021e-08 | 0 |
| 1.74896e-08 | 0 |
| 1.6974e-08 | 0 |
| 1.64736e-08 | 0 |
| 1.59879e-08 | 0 |
| 1.55165e-08 | 0 |
| 1.5059e-08 | 0 |
| 1.4615e-08 | 0 |
| 1.41842e-08 | 0 |
| 1.3766e-08 | 0 |
| 1.33601e-08 | 0 |
| 1.29662e-08 | 0 |